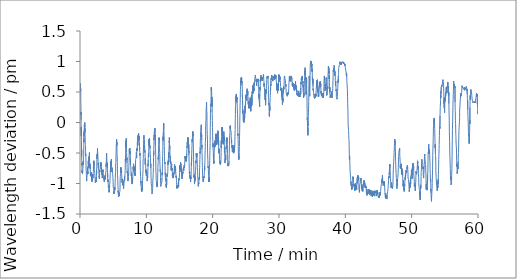
| Category | time / s |
|---|---|
| 0.0 | 0.529 |
| 0.004467121760050456 | 0.517 |
| 0.009117587407430013 | 0.542 |
| 0.013951404889424642 | 0.591 |
| 0.018701871236165363 | 0.566 |
| 0.023435688018798827 | 0.64 |
| 0.033303332328796384 | 0.628 |
| 0.038303836186726885 | 0.64 |
| 0.04400440057118734 | 0.64 |
| 0.04900490442911784 | 0.628 |
| 0.05747241973876953 | 0.603 |
| 0.06765677134195963 | 0.579 |
| 0.07260727087656657 | 0.591 |
| 0.08245824972788493 | 0.554 |
| 0.08747541904449463 | 0.529 |
| 0.09310932159423828 | 0.529 |
| 0.10212688446044922 | 0.554 |
| 0.10771076679229737 | 0.492 |
| 0.11311132113138835 | 0.431 |
| 0.12204553286234537 | 0.357 |
| 0.1271127223968506 | 0.332 |
| 0.13723038832346598 | 0.295 |
| 0.14213088353474934 | 0.246 |
| 0.14828150272369384 | 0.123 |
| 0.15388205051422119 | 0.172 |
| 0.1628996213277181 | 0.037 |
| 0.17298397223154705 | -0.086 |
| 0.1776177724202474 | -0.135 |
| 0.1833850065867106 | -0.074 |
| 0.1891355832417806 | -0.16 |
| 0.19448611736297608 | -0.222 |
| 0.20397040049235027 | -0.135 |
| 0.20925424893697103 | -0.222 |
| 0.21502149899800618 | -0.283 |
| 0.22358902295430502 | -0.32 |
| 0.2293229341506958 | -0.332 |
| 0.2386572043100993 | -0.542 |
| 0.2444577693939209 | -0.443 |
| 0.2530919869740804 | -0.566 |
| 0.25787578423817953 | -0.628 |
| 0.26264293988545734 | -0.628 |
| 0.26861018339792886 | -0.652 |
| 0.2775277535120646 | -0.689 |
| 0.28236157099405923 | -0.677 |
| 0.2873120705286662 | -0.665 |
| 0.29682968457539877 | -0.714 |
| 0.3016135056813558 | -0.739 |
| 0.30796411832173665 | -0.763 |
| 0.31664833227793376 | -0.825 |
| 0.3218655188878377 | -0.812 |
| 0.32669933636983234 | -0.812 |
| 0.33640030225118 | -0.788 |
| 0.34218421777089436 | -0.812 |
| 0.3512351195017497 | -0.788 |
| 0.3560522715250651 | -0.776 |
| 0.36585325400034585 | -0.8 |
| 0.37525418599446614 | -0.837 |
| 0.38588858445485436 | -0.837 |
| 0.39487281640370686 | -0.825 |
| 0.40455711682637535 | -0.812 |
| 0.41440810362497965 | -0.8 |
| 0.4254258712132772 | -0.776 |
| 0.43396007219950355 | -0.763 |
| 0.44362768332163494 | -0.776 |
| 0.44996167023976646 | -0.751 |
| 0.4555622180302938 | -0.714 |
| 0.4644964536031087 | -0.64 |
| 0.47446412245432534 | -0.628 |
| 0.484165088335673 | -0.689 |
| 0.49444943269093833 | -0.689 |
| 0.49923325379689537 | -0.702 |
| 0.5048504829406738 | -0.677 |
| 0.5143180847167969 | -0.64 |
| 0.5201520204544068 | -0.603 |
| 0.5297696352005005 | -0.603 |
| 0.5385038534800212 | -0.603 |
| 0.5442877531051635 | -0.579 |
| 0.5549054861068725 | -0.542 |
| 0.5634563525517782 | -0.419 |
| 0.569190255800883 | -0.382 |
| 0.5796913067499797 | -0.271 |
| 0.5889422178268433 | -0.32 |
| 0.5981098016103109 | -0.197 |
| 0.607944122950236 | -0.16 |
| 0.6140780687332154 | -0.222 |
| 0.6224622329076132 | -0.135 |
| 0.6323132197062175 | -0.111 |
| 0.6383638381958008 | -0.086 |
| 0.6473147392272949 | -0.074 |
| 0.653165316581726 | -0.037 |
| 0.6616828362147014 | -0.025 |
| 0.6678001006444295 | -0.049 |
| 0.6812181234359741 | -0.025 |
| 0.6912357886632283 | -0.025 |
| 0.6963863054911296 | -0.074 |
| 0.7031036376953125 | -0.086 |
| 0.7118711868921915 | -0.037 |
| 0.7176050821940104 | 0 |
| 0.7276894330978394 | -0.148 |
| 0.7371570348739624 | -0.098 |
| 0.7475414196650187 | -0.172 |
| 0.752508568763733 | -0.16 |
| 0.7589425563812255 | -0.209 |
| 0.7675767501195272 | -0.197 |
| 0.778977902730306 | -0.197 |
| 0.7850285053253174 | -0.246 |
| 0.7941294193267823 | -0.295 |
| 0.7992299159367879 | -0.357 |
| 0.8091308991114299 | -0.369 |
| 0.8153648694356282 | -0.357 |
| 0.8241990884145101 | -0.369 |
| 0.8309330860773723 | -0.382 |
| 0.839850656191508 | -0.455 |
| 0.8503850380579631 | -0.542 |
| 0.8558355887730916 | -0.517 |
| 0.8612694501876831 | -0.529 |
| 0.8700536727905274 | -0.542 |
| 0.8798046350479126 | -0.542 |
| 0.8860886017481486 | -0.579 |
| 0.895589550336202 | -0.579 |
| 0.9050238370895386 | -0.665 |
| 0.9103577057520549 | -0.714 |
| 0.9192419211069743 | -0.726 |
| 0.9290262381235759 | -0.788 |
| 0.9392272551854451 | -0.8 |
| 0.9458612362543742 | -0.812 |
| 0.9545454502105712 | -0.849 |
| 0.9641130685806274 | -0.874 |
| 0.9738473892211914 | -0.874 |
| 0.983981720606486 | -0.886 |
| 0.9937493721644084 | -0.899 |
| 1.0035003344217936 | -0.96 |
| 1.0101010004679363 | -0.923 |
| 1.015301521619161 | -0.923 |
| 1.0293362696965536 | -0.923 |
| 1.034503436088562 | -0.936 |
| 1.0443210840225219 | -0.911 |
| 1.0500883340835572 | -0.911 |
| 1.0588725566864015 | -0.874 |
| 1.0689068873723349 | -0.874 |
| 1.0747574726740519 | -0.849 |
| 1.0802746852238974 | -0.825 |
| 1.0861419359842936 | -0.8 |
| 1.0947261333465577 | -0.8 |
| 1.1045937856038412 | -0.812 |
| 1.1115278005599976 | -0.8 |
| 1.1200953324635823 | -0.763 |
| 1.1260625998179117 | -0.739 |
| 1.1344467719395956 | -0.763 |
| 1.1495816230773925 | -0.812 |
| 1.1561322689056397 | -0.849 |
| 1.1657832384109497 | -0.812 |
| 1.1803346872329712 | -0.837 |
| 1.1853518565495809 | -0.825 |
| 1.1954028526941936 | -0.788 |
| 1.201220122973124 | -0.788 |
| 1.2152215162913005 | -0.763 |
| 1.224822465578715 | -0.763 |
| 1.2399239857991537 | -0.739 |
| 1.250041651725769 | -0.714 |
| 1.2560255845387778 | -0.739 |
| 1.26472647190094 | -0.628 |
| 1.2708604017893472 | -0.689 |
| 1.2799779891967773 | -0.64 |
| 1.2864452997843425 | -0.603 |
| 1.2953295230865478 | -0.702 |
| 1.301630155245463 | -0.726 |
| 1.3101643323898315 | -0.665 |
| 1.316314951578776 | -0.714 |
| 1.3250658194224039 | -0.665 |
| 1.3348334709803262 | -0.677 |
| 1.341900849342346 | -0.603 |
| 1.3507517337799073 | -0.566 |
| 1.3605027039845785 | -0.628 |
| 1.3719705184300741 | -0.591 |
| 1.3818215052286784 | -0.628 |
| 1.3906057198842368 | -0.554 |
| 1.4011901060740153 | -0.615 |
| 1.4097076177597045 | -0.566 |
| 1.4194586038589478 | -0.492 |
| 1.4296929518381754 | -0.579 |
| 1.439027221997579 | -0.603 |
| 1.4458612362543741 | -0.628 |
| 1.4557789007822672 | -0.628 |
| 1.464863133430481 | -0.677 |
| 1.47494748433431 | -0.665 |
| 1.4813814560572307 | -0.714 |
| 1.4906657218933106 | -0.677 |
| 1.4992165724436441 | -0.677 |
| 1.5046504497528077 | -0.714 |
| 1.5135680198669434 | -0.714 |
| 1.5232523202896118 | -0.751 |
| 1.533169968922933 | -0.714 |
| 1.5394372701644898 | -0.763 |
| 1.5488048712412517 | -0.763 |
| 1.5581724723180135 | -0.812 |
| 1.5671733697255452 | -0.849 |
| 1.5772910515467327 | -0.874 |
| 1.5920925378799438 | -0.812 |
| 1.6014101187388101 | -0.849 |
| 1.61164448261261 | -0.862 |
| 1.6176950852076213 | -0.837 |
| 1.6266459862391154 | -0.874 |
| 1.6312297662099202 | -0.837 |
| 1.64113077322642 | -0.837 |
| 1.6515317996342977 | -0.837 |
| 1.6615494728088378 | -0.849 |
| 1.6672500530878702 | -0.812 |
| 1.6761675993601481 | -0.837 |
| 1.6861352682113648 | -0.886 |
| 1.6913357893625895 | -0.886 |
| 1.7031203031539917 | -0.874 |
| 1.711804501215617 | -0.837 |
| 1.7178551038106282 | -0.825 |
| 1.7264559666315715 | -0.849 |
| 1.733239968617757 | -0.849 |
| 1.743841036160787 | -0.923 |
| 1.752508568763733 | -0.923 |
| 1.7622762203216553 | -0.923 |
| 1.7721271991729737 | -0.936 |
| 1.7783111492792765 | -0.948 |
| 1.7882621526718139 | -0.936 |
| 1.7973463853200278 | -0.948 |
| 1.8075974225997924 | -0.972 |
| 1.817715088526408 | -0.96 |
| 1.8243824164072673 | -0.96 |
| 1.8338000377019246 | -0.886 |
| 1.8433509826660157 | -0.923 |
| 1.8496349493662516 | -0.911 |
| 1.8582691351572673 | -0.96 |
| 1.86391970316569 | -0.948 |
| 1.8736206690470378 | -0.923 |
| 1.8836050192515055 | -0.923 |
| 1.8894722700119018 | -0.849 |
| 1.8981897989908854 | -0.874 |
| 1.9079241196314494 | -0.862 |
| 1.9181084712346395 | -0.849 |
| 1.9279261191685995 | -0.837 |
| 1.933893370628357 | -0.849 |
| 1.943360988299052 | -0.849 |
| 1.9531619707743326 | -0.874 |
| 1.9598126331965129 | -0.911 |
| 1.968946886062622 | -0.886 |
| 1.9786811828613282 | -0.825 |
| 1.9888155380884807 | -0.825 |
| 1.9984331528345745 | -0.812 |
| 2.00805078347524 | -0.825 |
| 2.0180851221084595 | -0.8 |
| 2.0289862155914307 | -0.726 |
| 2.034486770629883 | -0.751 |
| 2.043504333496094 | -0.64 |
| 2.0532052993774412 | -0.665 |
| 2.0627895832061767 | -0.677 |
| 2.072473899523417 | -0.652 |
| 2.0774410565694175 | -0.628 |
| 2.087125372886658 | -0.64 |
| 2.0982764879862468 | -0.652 |
| 2.1082274675369264 | -0.689 |
| 2.116811672846476 | -0.652 |
| 2.122545568148295 | -0.652 |
| 2.1286961873372396 | -0.64 |
| 2.1378304322560626 | -0.652 |
| 2.148664855957031 | -0.677 |
| 2.157065685590108 | -0.776 |
| 2.1668166716893515 | -0.776 |
| 2.1766509691874187 | -0.776 |
| 2.183151618639628 | -0.763 |
| 2.192769249280294 | -0.763 |
| 2.2013534545898437 | -0.788 |
| 2.2108877340952557 | -0.812 |
| 2.217288366953532 | -0.825 |
| 2.225855898857117 | -0.837 |
| 2.235590203603109 | -0.837 |
| 2.2453745206197104 | -0.849 |
| 2.2601593176523846 | -0.899 |
| 2.2699769894282023 | -0.911 |
| 2.2762609322865806 | -0.911 |
| 2.286578639348348 | -0.911 |
| 2.295496185620626 | -0.911 |
| 2.305330522855123 | -0.96 |
| 2.3110477526982627 | -0.985 |
| 2.3198653062184653 | -0.985 |
| 2.3294829368591308 | -0.985 |
| 2.339483936627706 | -0.972 |
| 2.345334521929423 | -0.985 |
| 2.3548521359761554 | -0.948 |
| 2.365153169631958 | -0.948 |
| 2.3799046357472737 | -0.96 |
| 2.3898222843805947 | -0.972 |
| 2.3998066186904907 | -0.96 |
| 2.4093075672785442 | -0.96 |
| 2.4151248216629027 | -0.948 |
| 2.429126222928365 | -0.948 |
| 2.439477252960205 | -0.972 |
| 2.449211565653483 | -0.96 |
| 2.455495516459147 | -0.899 |
| 2.464146383603414 | -0.923 |
| 2.474180738131205 | -0.886 |
| 2.4839983860651653 | -0.899 |
| 2.4901156504948934 | -0.788 |
| 2.4988998730977374 | -0.837 |
| 2.508767517407735 | -0.8 |
| 2.5185518344243367 | -0.812 |
| 2.5287861824035645 | -0.726 |
| 2.538570499420166 | -0.677 |
| 2.5483548164367678 | -0.615 |
| 2.5546054363250734 | -0.566 |
| 2.568473490079244 | -0.579 |
| 2.5784244855244953 | -0.591 |
| 2.5881421168645224 | -0.517 |
| 2.5983598232269287 | -0.579 |
| 2.6080774545669554 | -0.517 |
| 2.6192285696665447 | -0.505 |
| 2.6279127677281697 | -0.48 |
| 2.6378304163614907 | -0.419 |
| 2.6479814529418944 | -0.468 |
| 2.6577157497406008 | -0.455 |
| 2.6673500537872314 | -0.48 |
| 2.677134354909261 | -0.468 |
| 2.683585000038147 | -0.517 |
| 2.6920191685358685 | -0.554 |
| 2.6982364734013875 | -0.566 |
| 2.7072040398915607 | -0.566 |
| 2.7179717699686687 | -0.591 |
| 2.7268893400828045 | -0.64 |
| 2.736590305964152 | -0.665 |
| 2.7467746496200562 | -0.689 |
| 2.756308937072754 | -0.665 |
| 2.7673433860143026 | -0.751 |
| 2.7762609322865806 | -0.751 |
| 2.7859952529271443 | -0.763 |
| 2.795879570643107 | -0.751 |
| 2.8026468992233275 | -0.739 |
| 2.8125479062398275 | -0.763 |
| 2.8212321043014525 | -0.788 |
| 2.8314831177393596 | -0.788 |
| 2.8365169525146485 | -0.788 |
| 2.846217918395996 | -0.825 |
| 2.8579357703526815 | -0.825 |
| 2.866920002301534 | -0.825 |
| 2.876670972506205 | -0.862 |
| 2.88630526860555 | -0.862 |
| 2.897089687983195 | -0.899 |
| 2.911424454053243 | -0.874 |
| 2.921158750851949 | -0.874 |
| 2.931243101755778 | -0.923 |
| 2.9410274028778076 | -0.862 |
| 2.9511284192403155 | -0.837 |
| 2.960879405339559 | -0.788 |
| 2.9706803719202677 | -0.8 |
| 2.9806647062301637 | -0.812 |
| 2.9865986347198485 | -0.776 |
| 2.9960662364959716 | -0.763 |
| 3.005983901023865 | -0.763 |
| 3.015584866205851 | -0.763 |
| 3.0254025220870973 | -0.776 |
| 3.035170149803162 | -0.751 |
| 3.045287839571635 | -0.739 |
| 3.0559389034907025 | -0.714 |
| 3.0647564490636188 | -0.689 |
| 3.0748241186141967 | -0.677 |
| 3.080891402562459 | -0.652 |
| 3.0899423042933147 | -0.689 |
| 3.100059986114502 | -0.714 |
| 3.10987761815389 | -0.689 |
| 3.1199119726816815 | -0.726 |
| 3.1306130329767865 | -0.677 |
| 3.139097221692403 | -0.714 |
| 3.148898204167684 | -0.677 |
| 3.1590492010116575 | -0.652 |
| 3.168700170516968 | -0.702 |
| 3.178434483210246 | -0.714 |
| 3.1882354497909544 | -0.689 |
| 3.1977697531382243 | -0.714 |
| 3.2121878544489544 | -0.763 |
| 3.2217387994130453 | -0.739 |
| 3.2315064509709677 | -0.751 |
| 3.2413407723108927 | -0.788 |
| 3.251475119590759 | -0.776 |
| 3.262326200803121 | -0.776 |
| 3.2719605048497518 | -0.812 |
| 3.2812114159266152 | -0.8 |
| 3.2918458223342895 | -0.788 |
| 3.3004966894785563 | -0.849 |
| 3.30999763806661 | -0.825 |
| 3.319865282376607 | -0.825 |
| 3.3296329339345294 | -0.862 |
| 3.3399339516957602 | -0.874 |
| 3.35000163714091 | -0.886 |
| 3.3612694183985394 | -0.911 |
| 3.3703370014826457 | -0.899 |
| 3.380004636446635 | -0.862 |
| 3.386038565635681 | -0.874 |
| 3.3950894673665366 | -0.837 |
| 3.4097742875417074 | -0.849 |
| 3.416474954287211 | -0.849 |
| 3.4250924666722615 | -0.849 |
| 3.434960134824117 | -0.837 |
| 3.441410787900289 | -0.776 |
| 3.4548954566319785 | -0.763 |
| 3.465029803911845 | -0.8 |
| 3.4710970878601075 | -0.8 |
| 3.479797951380412 | -0.776 |
| 3.489732273419698 | -0.8 |
| 3.500616685549418 | -0.812 |
| 3.509684268633525 | -0.837 |
| 3.520618685086568 | -0.849 |
| 3.5294028997421263 | -0.825 |
| 3.53915388584137 | -0.849 |
| 3.549071534474691 | -0.849 |
| 3.5592225551605225 | -0.874 |
| 3.5689568519592285 | -0.899 |
| 3.575490856170654 | -0.886 |
| 3.5853418350219726 | -0.899 |
| 3.5952761729558307 | -0.899 |
| 3.6042603890101117 | -0.923 |
| 3.613878019650777 | -0.899 |
| 3.623578985532125 | -0.948 |
| 3.6333966334660848 | -0.96 |
| 3.6431976159413657 | -0.948 |
| 3.6530319372812907 | -0.96 |
| 3.6627662340799967 | -0.972 |
| 3.6728505849838258 | -0.972 |
| 3.683201622962952 | -0.948 |
| 3.69305260181427 | -0.972 |
| 3.7038203557332356 | -0.923 |
| 3.7126045703887938 | -0.923 |
| 3.722855583826701 | -0.936 |
| 3.732706570625305 | -0.923 |
| 3.7398739496866864 | -0.886 |
| 3.750641703605652 | -0.899 |
| 3.759592588742574 | -0.886 |
| 3.769676939646403 | -0.936 |
| 3.7762942711512246 | -0.936 |
| 3.7849451224009196 | -0.886 |
| 3.7950961351394654 | -0.899 |
| 3.8047637859980266 | -0.862 |
| 3.8146481037139894 | -0.886 |
| 3.8245824178059897 | -0.923 |
| 3.8346834341684977 | -0.874 |
| 3.841067401568095 | -0.899 |
| 3.8499182860056558 | -0.899 |
| 3.8594192345937093 | -0.849 |
| 3.866286603609721 | -0.849 |
| 3.87502080599467 | -0.825 |
| 3.885638538996379 | -0.825 |
| 3.894706106185913 | -0.837 |
| 3.9049071232477823 | -0.812 |
| 3.9150248050689695 | -0.8 |
| 3.924792432785034 | -0.776 |
| 3.9363102515538535 | -0.702 |
| 3.9464112679163614 | -0.714 |
| 3.9559455553690595 | -0.677 |
| 3.966279935836792 | -0.726 |
| 3.9748807827631634 | -0.64 |
| 3.986615284283956 | -0.579 |
| 3.9954661687215167 | -0.529 |
| 4.005400506655375 | -0.505 |
| 4.016284918785095 | -0.517 |
| 4.0249524513880415 | -0.529 |
| 4.04005397160848 | -0.591 |
| 4.046037904421488 | -0.603 |
| 4.055155467987061 | -0.628 |
| 4.069406906763713 | -0.64 |
| 4.079157869021098 | -0.615 |
| 4.093642656008402 | -0.665 |
| 4.1032769521077475 | -0.652 |
| 4.112877917289734 | -0.689 |
| 4.122578883171082 | -0.665 |
| 4.133463303248088 | -0.751 |
| 4.143130938212077 | -0.837 |
| 4.152248517672221 | -0.899 |
| 4.162132835388183 | -0.837 |
| 4.172883915901184 | -0.899 |
| 4.186601956685384 | -0.972 |
| 4.193202622731527 | -0.972 |
| 4.20362032254537 | -0.972 |
| 4.217155019442241 | -0.985 |
| 4.2275727192560835 | -0.936 |
| 4.237423706054687 | -0.972 |
| 4.247191349665324 | -0.972 |
| 4.261909484863281 | -0.985 |
| 4.271760471661886 | -1.034 |
| 4.281544788678487 | -1.071 |
| 4.291162419319153 | -1.083 |
| 4.301180068651835 | -1.059 |
| 4.312181186676026 | -1.059 |
| 4.322265521685282 | -1.059 |
| 4.331666469573975 | -1.034 |
| 4.341550787289937 | -1.046 |
| 4.347801399230957 | -1.071 |
| 4.3619361559549965 | -1.12 |
| 4.372237189610799 | -1.108 |
| 4.382354871431986 | -1.145 |
| 4.392239189147949 | -1.157 |
| 4.40217350323995 | -1.132 |
| 4.417008336385091 | -1.096 |
| 4.426609285672506 | -1.132 |
| 4.437693738937378 | -1.132 |
| 4.446477937698364 | -1.083 |
| 4.457112336158753 | -1.059 |
| 4.470930385589599 | -1.071 |
| 4.481031386057536 | -1.009 |
| 4.490949050585429 | -1.022 |
| 4.500700036684672 | -0.997 |
| 4.510367671648662 | -0.972 |
| 4.524885789553324 | -0.948 |
| 4.531403104464213 | -0.911 |
| 4.540554022789001 | -0.923 |
| 4.550588353474935 | -0.899 |
| 4.560406001408895 | -0.849 |
| 4.571557116508484 | -0.825 |
| 4.58059135278066 | -0.788 |
| 4.590975721677144 | -0.812 |
| 4.597159671783447 | -0.8 |
| 4.6071106672286986 | -0.726 |
| 4.621395436922709 | -0.751 |
| 4.631446433067322 | -0.665 |
| 4.6409807205200195 | -0.689 |
| 4.650581669807434 | -0.64 |
| 4.661066071192423 | -0.652 |
| 4.6713170846303305 | -0.64 |
| 4.679934620857239 | -0.652 |
| 4.689668917655945 | -0.665 |
| 4.701536766688029 | -0.628 |
| 4.710421005884807 | -0.615 |
| 4.721438765525818 | -0.603 |
| 4.731773138046265 | -0.603 |
| 4.740690684318542 | -0.652 |
| 4.751025048891703 | -0.714 |
| 4.76082603931427 | -0.739 |
| 4.769543568293254 | -0.739 |
| 4.780761353174845 | -0.788 |
| 4.79026231765747 | -0.812 |
| 4.799879932403565 | -0.788 |
| 4.809314219156901 | -0.763 |
| 4.819298553466797 | -0.739 |
| 4.83013296922048 | -0.751 |
| 4.83898385365804 | -0.751 |
| 4.848751505215962 | -0.751 |
| 4.85858580271403 | -0.726 |
| 4.8701203028361 | -0.739 |
| 4.883688322703043 | -0.763 |
| 4.8936893224716185 | -0.763 |
| 4.904557069142659 | -0.763 |
| 4.914324720700582 | -0.8 |
| 4.923658982912699 | -0.837 |
| 4.938077084223429 | -0.862 |
| 4.949128206570943 | -0.874 |
| 4.9584458033243815 | -0.899 |
| 4.9682467699050905 | -0.923 |
| 4.9778977394104 | -0.923 |
| 4.99273255666097 | -0.972 |
| 5.002850238482157 | -1.009 |
| 5.012517873446146 | -1.059 |
| 5.022152169545492 | -1.046 |
| 5.0320864836374914 | -1.046 |
| 5.0433376232783 | -1.059 |
| 5.052521872520447 | -1.071 |
| 5.062139503161112 | -1.083 |
| 5.072323854764303 | -1.071 |
| 5.082124837239584 | -1.096 |
| 5.093059269587199 | -1.12 |
| 5.101676789919535 | -1.157 |
| 5.111744451522827 | -1.169 |
| 5.121528768539429 | -1.132 |
| 5.131296420097351 | -1.169 |
| 5.145481173197428 | -1.182 |
| 5.155365482966105 | -1.169 |
| 5.161899471282959 | -1.157 |
| 5.171050389607747 | -1.169 |
| 5.180934699376424 | -1.169 |
| 5.191519101460774 | -1.157 |
| 5.201736783981323 | -1.145 |
| 5.21080436706543 | -1.132 |
| 5.221772138277689 | -1.12 |
| 5.230623022715251 | -1.059 |
| 5.241640782356262 | -1.083 |
| 5.250558336575826 | -1.096 |
| 5.260175967216492 | -1.108 |
| 5.27081036567688 | -1.083 |
| 5.279344550768534 | -1.059 |
| 5.2901289701461796 | -1.059 |
| 5.299763250350952 | -0.985 |
| 5.310014287630717 | -0.936 |
| 5.3194652398427325 | -0.936 |
| 5.328949522972107 | -0.899 |
| 5.3389171679814655 | -0.862 |
| 5.349084854125977 | -0.825 |
| 5.365369820594788 | -0.825 |
| 5.374470718701681 | -0.8 |
| 5.384305055936178 | -0.677 |
| 5.395056120554606 | -0.677 |
| 5.408807484308879 | -0.652 |
| 5.418941839536031 | -0.64 |
| 5.42930953502655 | -0.517 |
| 5.440210636456808 | -0.529 |
| 5.454445385932923 | -0.468 |
| 5.4647464195887245 | -0.369 |
| 5.475014122327169 | -0.369 |
| 5.481831471125285 | -0.357 |
| 5.490499003728231 | -0.345 |
| 5.505550503730774 | -0.345 |
| 5.515384817123413 | -0.271 |
| 5.529936265945435 | -0.332 |
| 5.539587235450744 | -0.369 |
| 5.5510050535202025 | -0.32 |
| 5.560039289792379 | -0.394 |
| 5.571273732185364 | -0.382 |
| 5.580191302299499 | -0.492 |
| 5.590075620015463 | -0.529 |
| 5.599826606114705 | -0.529 |
| 5.611161073048909 | -0.566 |
| 5.624812436103821 | -0.652 |
| 5.634980122248332 | -0.702 |
| 5.644764423370361 | -0.776 |
| 5.654915436108907 | -0.849 |
| 5.664549732208252 | -0.874 |
| 5.678984522819519 | -0.862 |
| 5.688735485076904 | -0.911 |
| 5.698253099123637 | -0.96 |
| 5.707654054959615 | -0.972 |
| 5.717288335164388 | -1.034 |
| 5.732206503550212 | -1.059 |
| 5.747091317176819 | -1.096 |
| 5.757859071095784 | -1.145 |
| 5.766476583480835 | -1.12 |
| 5.776260900497436 | -1.132 |
| 5.791045721371969 | -1.182 |
| 5.800663336118062 | -1.169 |
| 5.810047618548075 | -1.182 |
| 5.820165284474691 | -1.219 |
| 5.826515936851502 | -1.219 |
| 5.839933935801188 | -1.219 |
| 5.849684921900431 | -1.219 |
| 5.859519219398498 | -1.157 |
| 5.869336867332459 | -1.182 |
| 5.880304638544718 | -1.169 |
| 5.895006100336711 | -1.194 |
| 5.904740420977275 | -1.206 |
| 5.915341488520304 | -1.206 |
| 5.924309039115906 | -1.206 |
| 5.934076682726542 | -1.182 |
| 5.948578135172526 | -1.157 |
| 5.963829652468363 | -1.157 |
| 5.973563973108927 | -1.169 |
| 5.983781655629476 | -1.157 |
| 5.99433270295461 | -1.145 |
| 6.007800722122193 | -1.132 |
| 6.018218437830607 | -1.096 |
| 6.0276527007420855 | -1.083 |
| 6.03738702138265 | -1.059 |
| 6.046971305211385 | -0.96 |
| 6.062039486567179 | -0.923 |
| 6.072757220268249 | -0.886 |
| 6.0815914392471315 | -0.886 |
| 6.091742451985677 | -0.862 |
| 6.102826889355978 | -0.837 |
| 6.117711702982585 | -0.825 |
| 6.126629273096721 | -0.788 |
| 6.136396916707357 | -0.776 |
| 6.146181217829386 | -0.739 |
| 6.156798950831095 | -0.739 |
| 6.170450321833292 | -0.812 |
| 6.180384635925293 | -0.739 |
| 6.191152389844259 | -0.825 |
| 6.199953269958496 | -0.837 |
| 6.209670901298523 | -0.837 |
| 6.220905367533366 | -0.751 |
| 6.231106384595235 | -0.739 |
| 6.239857252438863 | -0.751 |
| 6.249758251508077 | -0.763 |
| 6.259359200795491 | -0.776 |
| 6.274127356211344 | -0.812 |
| 6.284211683273315 | -0.849 |
| 6.294079351425171 | -0.837 |
| 6.303513622283935 | -0.849 |
| 6.313181249300639 | -0.923 |
| 6.323782316843668 | -0.96 |
| 6.333583299318949 | -0.985 |
| 6.343984333674113 | -0.96 |
| 6.35395200252533 | -0.923 |
| 6.362936234474182 | -0.911 |
| 6.3822214841842655 | -0.972 |
| 6.391889119148255 | -0.985 |
| 6.401906784375509 | -0.948 |
| 6.412941233317057 | -0.96 |
| 6.422742215792338 | -0.972 |
| 6.436460256576538 | -0.936 |
| 6.446227884292602 | -0.985 |
| 6.456112217903137 | -0.997 |
| 6.465496484438578 | -0.972 |
| 6.4752641359965 | -1.022 |
| 6.48546515305837 | -0.997 |
| 6.496266237894694 | -1.034 |
| 6.506583937009176 | -0.985 |
| 6.515234804153442 | -0.972 |
| 6.526402568817138 | -0.96 |
| 6.536686937014262 | -0.985 |
| 6.546487919489542 | -0.972 |
| 6.560272638003031 | -1.059 |
| 6.570040265719096 | -1.083 |
| 6.57990791797638 | -1.059 |
| 6.590942366917928 | -1.059 |
| 6.6001266161600745 | -1.046 |
| 6.6101776202519735 | -1.034 |
| 6.619845255215963 | -1.022 |
| 6.630012933413187 | -0.997 |
| 6.639747254053751 | -0.997 |
| 6.655032102266947 | -0.997 |
| 6.664983105659485 | -0.972 |
| 6.679984601338704 | -0.972 |
| 6.689952270189921 | -0.936 |
| 6.699769902229309 | -0.948 |
| 6.714338032404582 | -0.911 |
| 6.724372371037801 | -0.948 |
| 6.7341400225957235 | -0.948 |
| 6.744191018740336 | -0.948 |
| 6.755175455411275 | -0.874 |
| 6.769343535105388 | -0.874 |
| 6.776110887527466 | -0.886 |
| 6.785311802228292 | -0.849 |
| 6.794312699635824 | -0.825 |
| 6.805813852945963 | -0.788 |
| 6.819281872113546 | -0.763 |
| 6.8300662676493324 | -0.603 |
| 6.839200520515442 | -0.603 |
| 6.848184752464294 | -0.591 |
| 6.857885718345642 | -0.64 |
| 6.877237669626871 | -0.529 |
| 6.892722535133362 | -0.308 |
| 6.9024235010147095 | -0.406 |
| 6.9123245000839235 | -0.357 |
| 6.922342173258463 | -0.357 |
| 6.937143651644389 | -0.32 |
| 6.946861282984416 | -0.357 |
| 6.957545685768127 | -0.295 |
| 6.9667299350102745 | -0.295 |
| 6.978231088320414 | -0.259 |
| 6.9927658875783285 | -0.332 |
| 7.002550188700358 | -0.283 |
| 7.01208446820577 | -0.443 |
| 7.021852119763692 | -0.492 |
| 7.0311530510584515 | -0.48 |
| 7.045754504203797 | -0.505 |
| 7.055505482355754 | -0.579 |
| 7.065289783477783 | -0.615 |
| 7.075024104118347 | -0.579 |
| 7.084641718864441 | -0.665 |
| 7.099526556332906 | -0.739 |
| 7.114411369959513 | -0.825 |
| 7.124279022216797 | -0.825 |
| 7.134246683120727 | -0.812 |
| 7.143897652626038 | -0.8 |
| 7.15973257223765 | -0.825 |
| 7.1687668005625405 | -0.837 |
| 7.1785511175791425 | -0.862 |
| 7.188635452588399 | -0.874 |
| 7.198803154627482 | -0.899 |
| 7.213571286201477 | -0.899 |
| 7.223355603218079 | -0.911 |
| 7.232806555430094 | -0.96 |
| 7.242507521311442 | -0.972 |
| 7.257525682449341 | -0.96 |
| 7.267610017458598 | -0.886 |
| 7.277561020851135 | -0.886 |
| 7.287395334243774 | -0.849 |
| 7.297062969207763 | -0.874 |
| 7.307864054044088 | -0.862 |
| 7.322098803520203 | -0.874 |
| 7.332949884732565 | -0.862 |
| 7.342750867207845 | -0.849 |
| 7.35313523610433 | -0.763 |
| 7.363069566090902 | -0.726 |
| 7.3787211338678995 | -0.702 |
| 7.387688700358073 | -0.714 |
| 7.397606348991394 | -0.652 |
| 7.40759068330129 | -0.628 |
| 7.417975052197774 | -0.455 |
| 7.433243250846862 | -0.468 |
| 7.4433609326680505 | -0.431 |
| 7.454228687286377 | -0.48 |
| 7.46821342309316 | -0.48 |
| 7.477931054433187 | -0.505 |
| 7.488398766517639 | -0.492 |
| 7.497866384188334 | -0.419 |
| 7.5077173709869385 | -0.492 |
| 7.517318336168925 | -0.48 |
| 7.524068999290466 | -0.468 |
| 7.537787040074666 | -0.468 |
| 7.547404670715332 | -0.517 |
| 7.553838634490967 | -0.48 |
| 7.562356170018514 | -0.468 |
| 7.57209046681722 | -0.505 |
| 7.581774767239889 | -0.505 |
| 7.5915090878804525 | -0.628 |
| 7.601393405596415 | -0.603 |
| 7.611527752876282 | -0.615 |
| 7.621078705787658 | -0.689 |
| 7.632129804293315 | -0.702 |
| 7.641130701700846 | -0.702 |
| 7.65086502234141 | -0.702 |
| 7.660749340057373 | -0.726 |
| 7.670750339825948 | -0.726 |
| 7.681034700075785 | -0.763 |
| 7.687085302670797 | -0.788 |
| 7.696636255582174 | -0.837 |
| 7.706603916486104 | -0.825 |
| 7.715971517562866 | -0.825 |
| 7.72587251663208 | -0.874 |
| 7.7357568343480425 | -0.874 |
| 7.742440835634867 | -0.862 |
| 7.75237516562144 | -0.862 |
| 7.761742766698202 | -0.849 |
| 7.772943886121114 | -0.825 |
| 7.781461405754089 | -0.837 |
| 7.791379070281982 | -0.911 |
| 7.7971629699071245 | -0.923 |
| 7.806163867314656 | -0.948 |
| 7.812964550654093 | -0.972 |
| 7.826799265543619 | -0.985 |
| 7.836350218454997 | -0.96 |
| 7.842634185155233 | -1.009 |
| 7.851585086186727 | -0.948 |
| 7.861119365692138 | -0.911 |
| 7.871253720919291 | -0.923 |
| 7.877754370371501 | -0.923 |
| 7.886471899350484 | -0.923 |
| 7.896639585494995 | -0.923 |
| 7.906457233428955 | -0.96 |
| 7.917658352851868 | -0.985 |
| 7.926242550214131 | -0.948 |
| 7.935843499501546 | -0.96 |
| 7.942027449607849 | -0.936 |
| 7.951161702473958 | -0.936 |
| 7.9611460367838545 | -0.886 |
| 7.967796699206034 | -0.899 |
| 7.976414219538371 | -0.849 |
| 7.986265222231547 | -0.849 |
| 7.995682819684347 | -0.849 |
| 8.00596718788147 | -0.8 |
| 8.015718150138856 | -0.726 |
| 8.025819166501362 | -0.714 |
| 8.035603483517965 | -0.739 |
| 8.045304449399312 | -0.726 |
| 8.055005423227946 | -0.776 |
| 8.060889355341594 | -0.714 |
| 8.070256956418355 | -0.714 |
| 8.079791235923768 | -0.677 |
| 8.089475536346436 | -0.739 |
| 8.099543205897014 | -0.751 |
| 8.109244187672934 | -0.726 |
| 8.120861999193828 | -0.714 |
| 8.129779569307964 | -0.702 |
| 8.139897235234578 | -0.739 |
| 8.15151507059733 | -0.751 |
| 8.160065937042237 | -0.776 |
| 8.17006693681081 | -0.812 |
| 8.179667886098226 | -0.8 |
| 8.189902234077454 | -0.763 |
| 8.199969919522603 | -0.763 |
| 8.20585383574168 | -0.739 |
| 8.214888087908427 | -0.849 |
| 8.224589053789774 | -0.837 |
| 8.23415667215983 | -0.837 |
| 8.244641049702961 | -0.812 |
| 8.254242022832235 | -0.862 |
| 8.26442636648814 | -0.862 |
| 8.274093985557556 | -0.825 |
| 8.284278353055319 | -0.837 |
| 8.295296120643616 | -0.825 |
| 8.303946987787883 | -0.837 |
| 8.313497932751973 | -0.874 |
| 8.323265568415325 | -0.837 |
| 8.333016554514566 | -0.812 |
| 8.343367584546407 | -0.751 |
| 8.353001888593038 | -0.788 |
| 8.363036219278971 | -0.751 |
| 8.369603554407755 | -0.665 |
| 8.378471104303996 | -0.652 |
| 8.39285586675008 | -0.603 |
| 8.399073155721029 | -0.615 |
| 8.408257420857748 | -0.603 |
| 8.417841704686483 | -0.603 |
| 8.424742404619852 | -0.591 |
| 8.433726620674133 | -0.603 |
| 8.443544268608093 | -0.615 |
| 8.453228569030761 | -0.579 |
| 8.463112902641296 | -0.566 |
| 8.473530602455138 | -0.542 |
| 8.483398254712423 | -0.529 |
| 8.493115886052449 | -0.492 |
| 8.503083570798237 | -0.505 |
| 8.508834139506023 | -0.492 |
| 8.518501766522725 | -0.517 |
| 8.528652787208557 | -0.529 |
| 8.54000391960144 | -0.579 |
| 8.549621534347533 | -0.554 |
| 8.555488801002502 | -0.492 |
| 8.564006320635478 | -0.48 |
| 8.57405731678009 | -0.419 |
| 8.583858299255372 | -0.431 |
| 8.593559273084004 | -0.419 |
| 8.604377023379008 | -0.468 |
| 8.61352793375651 | -0.455 |
| 8.633446606000264 | -0.431 |
| 8.64028062025706 | -0.419 |
| 8.648998149236043 | -0.32 |
| 8.659165835380554 | -0.332 |
| 8.668916805585225 | -0.32 |
| 8.678867801030476 | -0.345 |
| 8.688868800799051 | -0.382 |
| 8.699019821484884 | -0.332 |
| 8.708704121907552 | -0.345 |
| 8.7151047706604 | -0.259 |
| 8.725505805015564 | -0.32 |
| 8.734290019671123 | -0.332 |
| 8.744291019439697 | -0.332 |
| 8.754358688990274 | -0.246 |
| 8.760192600886027 | -0.209 |
| 8.774760723114014 | -0.246 |
| 8.78052797317505 | -0.222 |
| 8.789445519447327 | -0.259 |
| 8.799796549479167 | -0.209 |
| 8.805063756306966 | -0.197 |
| 8.816131536165873 | -0.185 |
| 8.829766217867533 | -0.234 |
| 8.835966833432515 | -0.185 |
| 8.844801052411396 | -0.259 |
| 8.854418683052064 | -0.283 |
| 8.86581981976827 | -0.259 |
| 8.874537372589112 | -0.234 |
| 8.88435502052307 | -0.283 |
| 8.894289334615072 | -0.259 |
| 8.904623699188232 | -0.222 |
| 8.91959187189738 | -0.295 |
| 8.929876240094503 | -0.332 |
| 8.939910570780436 | -0.369 |
| 8.946161206563314 | -0.332 |
| 8.955262104670206 | -0.345 |
| 8.965363121032714 | -0.382 |
| 8.975597469011943 | -0.431 |
| 8.980564634005228 | -0.406 |
| 8.989998920758564 | -0.455 |
| 9.000083255767823 | -0.455 |
| 9.011651086807252 | -0.492 |
| 9.020635302861532 | -0.517 |
| 9.030953001976012 | -0.542 |
| 9.03733696937561 | -0.542 |
| 9.046154538790384 | -0.505 |
| 9.057422320048014 | -0.542 |
| 9.065989836057026 | -0.603 |
| 9.076890937487285 | -0.628 |
| 9.08530843257904 | -0.739 |
| 9.096326200167338 | -0.788 |
| 9.107610670725505 | -0.8 |
| 9.11617820262909 | -0.8 |
| 9.122978885968527 | -0.862 |
| 9.131763084729512 | -0.886 |
| 9.141414054234822 | -0.899 |
| 9.151931770642598 | -0.923 |
| 9.16129937171936 | -0.936 |
| 9.17110035419464 | -0.96 |
| 9.180784654617309 | -0.96 |
| 9.186968604723612 | -0.985 |
| 9.201236701011657 | -0.96 |
| 9.207137282689413 | -1.034 |
| 9.216121522585551 | -1.046 |
| 9.225939170519512 | -1.034 |
| 9.230923000971476 | -1.046 |
| 9.242457485198974 | -1.071 |
| 9.251108352343241 | -1.083 |
| 9.261292703946431 | -1.108 |
| 9.271343700091045 | -1.083 |
| 9.28157807191213 | -1.108 |
| 9.291229033470154 | -1.108 |
| 9.29752966562907 | -1.096 |
| 9.306597232818604 | -1.083 |
| 9.31668156782786 | -1.132 |
| 9.326499215761821 | -1.132 |
| 9.336300206184386 | -1.12 |
| 9.345984506607056 | -1.132 |
| 9.35605218410492 | -1.132 |
| 9.362369489669799 | -1.12 |
| 9.37098700205485 | -1.132 |
| 9.385721802711487 | -1.083 |
| 9.396472883224487 | -1.034 |
| 9.406190538406372 | -1.096 |
| 9.41627487341563 | -1.034 |
| 9.42582581837972 | -1.022 |
| 9.436760250727335 | -0.948 |
| 9.44517776966095 | -0.911 |
| 9.45469536781311 | -0.886 |
| 9.464696367581686 | -0.899 |
| 9.474514023462932 | -0.849 |
| 9.484598366419474 | -0.825 |
| 9.495316100120544 | -0.788 |
| 9.50383361975352 | -0.702 |
| 9.513467915852864 | -0.64 |
| 9.523218886057537 | -0.64 |
| 9.534670035044352 | -0.591 |
| 9.543570939699809 | -0.529 |
| 9.553421918551127 | -0.455 |
| 9.56318957010905 | -0.431 |
| 9.572873870531717 | -0.443 |
| 9.582591501871745 | -0.455 |
| 9.592659171422323 | -0.406 |
| 9.59864310423533 | -0.369 |
| 9.607777349154155 | -0.443 |
| 9.617661666870116 | -0.32 |
| 9.627095953623455 | -0.246 |
| 9.636896936098735 | -0.209 |
| 9.642164119084676 | -0.222 |
| 9.651698406537374 | -0.271 |
| 9.661149350802104 | -0.295 |
| 9.671283706029255 | -0.295 |
| 9.681351367632548 | -0.32 |
| 9.69098567167918 | -0.295 |
| 9.700986671447755 | -0.32 |
| 9.71057097117106 | -0.332 |
| 9.72093866666158 | -0.332 |
| 9.730222916603088 | -0.32 |
| 9.740040572484334 | -0.357 |
| 9.749808216094971 | -0.382 |
| 9.759992567698161 | -0.48 |
| 9.770043587684631 | -0.455 |
| 9.780344605445862 | -0.468 |
| 9.79002890586853 | -0.455 |
| 9.799779884020488 | -0.505 |
| 9.806530555089315 | -0.492 |
| 9.815431451797485 | -0.579 |
| 9.825165756543477 | -0.64 |
| 9.83536676565806 | -0.689 |
| 9.841467388470967 | -0.689 |
| 9.850651637713115 | -0.615 |
| 9.859635869661966 | -0.591 |
| 9.86968686580658 | -0.652 |
| 9.87935450077057 | -0.64 |
| 9.885838484764099 | -0.652 |
| 9.895506119728088 | -0.652 |
| 9.905657132466635 | -0.677 |
| 9.914174652099609 | -0.763 |
| 9.923508922259012 | -0.751 |
| 9.93322656949361 | -0.763 |
| 9.943127552668253 | -0.825 |
| 9.949094820022584 | -0.825 |
| 9.959679206212362 | -0.776 |
| 9.969346833229064 | -0.812 |
| 9.978164386749267 | -0.837 |
| 9.987898683547973 | -0.837 |
| 9.997766335805258 | -0.874 |
| 10.012434482574463 | -0.812 |
| 10.023018868764241 | -0.812 |
| 10.032469820976257 | -0.776 |
| 10.03867043654124 | -0.837 |
| 10.046987938880921 | -0.837 |
| 10.061756086349487 | -0.837 |
| 10.068523422876995 | -0.812 |
| 10.077140951156617 | -0.837 |
| 10.087141950925192 | -0.886 |
| 10.09682625134786 | -0.911 |
| 10.108110721906026 | -0.936 |
| 10.116711568832397 | -0.96 |
| 10.126379203796386 | -0.948 |
| 10.136530216534933 | -0.936 |
| 10.141364034016927 | -0.923 |
| 10.152448487281799 | -0.948 |
| 10.161966101328533 | -0.911 |
| 10.171583716074625 | -0.886 |
| 10.18090132077535 | -0.911 |
| 10.187301969528198 | -0.923 |
| 10.196752905845642 | -0.899 |
| 10.206037171681722 | -0.911 |
| 10.215854819615682 | -0.886 |
| 10.225672467549641 | -0.886 |
| 10.2357568025589 | -0.763 |
| 10.246457886695861 | -0.739 |
| 10.255458768208822 | -0.689 |
| 10.266526556015014 | -0.689 |
| 10.275677466392517 | -0.714 |
| 10.284811719258625 | -0.615 |
| 10.295779466629028 | -0.591 |
| 10.304397002855938 | -0.603 |
| 10.310647638638814 | -0.529 |
| 10.319548519452413 | -0.529 |
| 10.32926615079244 | -0.505 |
| 10.341117334365844 | -0.566 |
| 10.349901549021403 | -0.566 |
| 10.360419273376465 | -0.492 |
| 10.370686968167623 | -0.406 |
| 10.38080464998881 | -0.345 |
| 10.394339338938396 | -0.283 |
| 10.40394030412038 | -0.345 |
| 10.410390933354696 | -0.295 |
| 10.419425169626871 | -0.382 |
| 10.429709537823994 | -0.271 |
| 10.439610536893209 | -0.308 |
| 10.445977838834127 | -0.332 |
| 10.454562020301818 | -0.332 |
| 10.465946483612061 | -0.283 |
| 10.475947483380635 | -0.259 |
| 10.489615519841513 | -0.283 |
| 10.495932817459106 | -0.308 |
| 10.504583684603373 | -0.332 |
| 10.514468002319337 | -0.369 |
| 10.52446900208791 | -0.419 |
| 10.535420099894205 | -0.382 |
| 10.543970950444539 | -0.431 |
| 10.553705271085104 | -0.419 |
| 10.563706270853679 | -0.431 |
| 10.569806869824728 | -0.455 |
| 10.579891220728557 | -0.48 |
| 10.588508749008179 | -0.505 |
| 10.598293050130208 | -0.529 |
| 10.608494083086649 | -0.517 |
| 10.618245053291322 | -0.529 |
| 10.629479519526164 | -0.579 |
| 10.638380400339763 | -0.615 |
| 10.648048035303752 | -0.714 |
| 10.657815686861674 | -0.677 |
| 10.667633318901062 | -0.689 |
| 10.679067802429199 | -0.677 |
| 10.687718669573465 | -0.751 |
| 10.6977530002594 | -0.8 |
| 10.70777067343394 | -0.874 |
| 10.714571356773376 | -0.899 |
| 10.728072698911031 | -0.948 |
| 10.73812370300293 | -0.997 |
| 10.749474835395812 | -0.997 |
| 10.758025685946146 | -0.997 |
| 10.767810002962749 | -0.985 |
| 10.782728171348571 | -1.009 |
| 10.78926215171814 | -1.046 |
| 10.797829667727152 | -1.071 |
| 10.804246989885966 | -1.059 |
| 10.81283118724823 | -1.071 |
| 10.82434900601705 | -1.108 |
| 10.83441666762034 | -1.108 |
| 10.842817521095276 | -1.12 |
| 10.85281852086385 | -1.108 |
| 10.862402804692586 | -1.169 |
| 10.872770500183105 | -1.157 |
| 10.8817214012146 | -1.145 |
| 10.891489052772522 | -1.157 |
| 10.901006650924682 | -1.145 |
| 10.910857653617859 | -1.132 |
| 10.921175352732341 | -1.145 |
| 10.930759636561076 | -1.12 |
| 10.940577284495037 | -1.108 |
| 10.95044493675232 | -1.083 |
| 10.960212588310242 | -1.059 |
| 10.971680402755737 | -0.96 |
| 10.980864636103313 | -0.96 |
| 10.995332749684652 | -0.948 |
| 11.00156672000885 | -0.948 |
| 11.0103009223938 | -0.911 |
| 11.025052404403686 | -0.862 |
| 11.0351034005483 | -0.837 |
| 11.044887717564901 | -0.837 |
| 11.051288350423176 | -0.812 |
| 11.05983920097351 | -0.739 |
| 11.070673616727193 | -0.714 |
| 11.079757873217265 | -0.652 |
| 11.089775538444519 | -0.579 |
| 11.099509835243225 | -0.505 |
| 11.109210801124572 | -0.529 |
| 11.12317888736725 | -0.468 |
| 11.129596185684203 | -0.419 |
| 11.138897116978963 | -0.406 |
| 11.14844806989034 | -0.357 |
| 11.154465333620708 | -0.259 |
| 11.168350052833556 | -0.283 |
| 11.178184366226196 | -0.283 |
| 11.18940216700236 | -0.209 |
| 11.198219720522562 | -0.234 |
| 11.208387406667073 | -0.185 |
| 11.218788433074952 | -0.148 |
| 11.228106037775676 | -0.185 |
| 11.238007020950317 | -0.16 |
| 11.248241384824118 | -0.234 |
| 11.254358649253845 | -0.185 |
| 11.267793337504068 | -0.098 |
| 11.27759431997935 | -0.098 |
| 11.283911617596944 | -0.098 |
| 11.289562169710795 | -0.123 |
| 11.298179705937704 | -0.098 |
| 11.308147366841634 | -0.172 |
| 11.317781670888264 | -0.185 |
| 11.32776600519816 | -0.172 |
| 11.337750339508057 | -0.234 |
| 11.347517967224121 | -0.209 |
| 11.362286122639974 | -0.369 |
| 11.37202041943868 | -0.394 |
| 11.378654416402181 | -0.382 |
| 11.388088703155518 | -0.431 |
| 11.397672986984253 | -0.443 |
| 11.4114910364151 | -0.529 |
| 11.421258687973022 | -0.603 |
| 11.427542654673259 | -0.714 |
| 11.44184406598409 | -0.8 |
| 11.447828006744384 | -0.825 |
| 11.46222943464915 | -0.825 |
| 11.472130433718364 | -0.862 |
| 11.482348116238912 | -0.923 |
| 11.492482471466065 | -0.948 |
| 11.499116468429566 | -0.936 |
| 11.512951183319093 | -0.948 |
| 11.52431898911794 | -0.972 |
| 11.534319988886516 | -0.997 |
| 11.543104203542073 | -0.997 |
| 11.552905186017354 | -0.997 |
| 11.5675066391627 | -1.034 |
| 11.577640986442566 | -1.034 |
| 11.582774837811789 | -1.022 |
| 11.592475803693135 | -1.009 |
| 11.60249346892039 | -1.009 |
| 11.613827935854594 | -1.022 |
| 11.62327888806661 | -1.059 |
| 11.632463137308756 | -1.046 |
| 11.64233078956604 | -1.009 |
| 11.648548070589701 | -0.972 |
| 11.661949419975281 | -0.985 |
| 11.671417037645975 | -1.034 |
| 11.68145136833191 | -0.985 |
| 11.691002321243285 | -0.948 |
| 11.700736618041992 | -0.923 |
| 11.711871067682901 | -0.874 |
| 11.721422036488852 | -0.837 |
| 11.731256333986918 | -0.8 |
| 11.741907405853272 | -0.739 |
| 11.750958315531413 | -0.702 |
| 11.760642615954081 | -0.689 |
| 11.770260254542032 | -0.677 |
| 11.780611268679301 | -0.652 |
| 11.7903289159139 | -0.628 |
| 11.800013216336568 | -0.579 |
| 11.809630854924519 | -0.603 |
| 11.819265135129292 | -0.529 |
| 11.828999455769857 | -0.529 |
| 11.838567066192628 | -0.517 |
| 11.848651417096455 | -0.419 |
| 11.858802437782288 | -0.357 |
| 11.868786772092184 | -0.357 |
| 11.875004053115845 | -0.308 |
| 11.883754936854045 | -0.308 |
| 11.893522572517394 | -0.32 |
| 11.903490233421326 | -0.295 |
| 11.913791251182555 | -0.246 |
| 11.92379225095113 | -0.234 |
| 11.93374325434367 | -0.283 |
| 11.943894267082214 | -0.259 |
| 11.954762037595113 | -0.332 |
| 11.963712922732036 | -0.382 |
| 11.973680583635966 | -0.431 |
| 11.983331553141277 | -0.431 |
| 11.993515904744466 | -0.455 |
| 12.003283556302389 | -0.443 |
| 12.013267866770427 | -0.492 |
| 12.023085522651673 | -0.554 |
| 12.03291983604431 | -0.603 |
| 12.042654156684875 | -0.665 |
| 12.052771822611492 | -0.665 |
| 12.062306102116903 | -0.677 |
| 12.071807066599527 | -0.726 |
| 12.081608033180236 | -0.776 |
| 12.091392350196838 | -0.8 |
| 12.102676820755004 | -0.788 |
| 12.111311022440592 | -0.776 |
| 12.12119533220927 | -0.8 |
| 12.131229670842488 | -0.849 |
| 12.14104731877645 | -0.899 |
| 12.150898305575053 | -0.936 |
| 12.160849301020304 | -0.911 |
| 12.17190039952596 | -0.985 |
| 12.181301355361938 | -1.046 |
| 12.191035652160645 | -1.034 |
| 12.20065328280131 | -1.059 |
| 12.21027090549469 | -1.022 |
| 12.220255239804585 | -1.022 |
| 12.23542342185974 | -1.034 |
| 12.241590706507365 | -1.034 |
| 12.255425421396891 | -1.022 |
| 12.2655264377594 | -1.034 |
| 12.271493705113729 | -1.022 |
| 12.280577937761942 | -1.009 |
| 12.290245572725931 | -1.009 |
| 12.300013216336568 | -1.022 |
| 12.310514267285665 | -1.022 |
| 12.319865202903747 | -1.034 |
| 12.329599499702454 | -1.022 |
| 12.339800516764322 | -1.009 |
| 12.34950150648753 | -0.972 |
| 12.359719189008077 | -0.948 |
| 12.369353485107421 | -0.936 |
| 12.37943782011668 | -0.886 |
| 12.389522171020507 | -0.825 |
| 12.401089986165365 | -0.862 |
| 12.409657502174378 | -0.812 |
| 12.419558501243591 | -0.763 |
| 12.429559501012166 | -0.677 |
| 12.439010453224181 | -0.64 |
| 12.453945271174113 | -0.542 |
| 12.460195899009705 | -0.542 |
| 12.469863533973694 | -0.505 |
| 12.479464483261108 | -0.443 |
| 12.488965439796448 | -0.394 |
| 12.499199803670248 | -0.32 |
| 12.509267473220826 | -0.308 |
| 12.51596813996633 | -0.246 |
| 12.526019136110941 | -0.295 |
| 12.534703350067138 | -0.234 |
| 12.544454320271809 | -0.222 |
| 12.55462200641632 | -0.259 |
| 12.564639671643574 | -0.172 |
| 12.574407323201497 | -0.098 |
| 12.584141635894776 | -0.098 |
| 12.594976035753886 | -0.049 |
| 12.604376983642577 | -0.098 |
| 12.613561232884726 | -0.012 |
| 12.623478889465332 | 0 |
| 12.633079854647319 | -0.037 |
| 12.643230867385864 | -0.086 |
| 12.6528151512146 | -0.148 |
| 12.662949506441752 | -0.135 |
| 12.668633405367533 | -0.209 |
| 12.67931780020396 | -0.222 |
| 12.69320251941681 | -0.259 |
| 12.70325353940328 | -0.369 |
| 12.713354555765788 | -0.394 |
| 12.724538985888163 | -0.455 |
| 12.733389886220296 | -0.505 |
| 12.74474101861318 | -0.554 |
| 12.753308534622192 | -0.615 |
| 12.759592501322429 | -0.628 |
| 12.768276699384053 | -0.652 |
| 12.778277699152628 | -0.64 |
| 12.788295372327168 | -0.677 |
| 12.798179690043131 | -0.652 |
| 12.804847017923992 | -0.677 |
| 12.814698020617167 | -0.714 |
| 12.823132189114888 | -0.726 |
| 12.837917002042134 | -0.8 |
| 12.848134684562684 | -0.825 |
| 12.857935667037964 | -0.849 |
| 12.867786653836568 | -0.825 |
| 12.877670971552531 | -0.899 |
| 12.889705522855122 | -0.936 |
| 12.90327353477478 | -0.96 |
| 12.91292450428009 | -0.96 |
| 12.922675466537475 | -0.972 |
| 12.932726486523945 | -0.972 |
| 12.942627469698587 | -0.936 |
| 12.952811821301777 | -0.936 |
| 12.959179123242697 | -0.936 |
| 12.96791333357493 | -0.911 |
| 12.977797651290894 | -0.972 |
| 12.988332033157349 | -1.046 |
| 12.997449620564778 | -1.009 |
| 13.007467285792034 | -1.046 |
| 13.01756828625997 | -1.071 |
| 13.027269268035889 | -1.071 |
| 13.0379536708196 | -1.022 |
| 13.051588368415832 | -0.997 |
| 13.061222672462463 | -1.022 |
| 13.071640372276306 | -1.022 |
| 13.081891385714213 | -0.936 |
| 13.093742569287619 | -0.886 |
| 13.10297683874766 | -0.886 |
| 13.113427869478862 | -0.862 |
| 13.123178855578105 | -0.837 |
| 13.133246533075969 | -0.886 |
| 13.14684788386027 | -0.899 |
| 13.156348832448323 | -0.874 |
| 13.165933140118916 | -0.874 |
| 13.175784118970235 | -0.862 |
| 13.185568435986836 | -0.849 |
| 13.196819551785786 | -0.874 |
| 13.206687204043071 | -0.849 |
| 13.215288066864014 | -0.862 |
| 13.22537240187327 | -0.837 |
| 13.236706868807476 | -0.8 |
| 13.250358239809673 | -0.751 |
| 13.25687555472056 | -0.739 |
| 13.265326404571534 | -0.652 |
| 13.27504403591156 | -0.689 |
| 13.284661666552227 | -0.652 |
| 13.29634617169698 | -0.652 |
| 13.30511372089386 | -0.628 |
| 13.314581338564555 | -0.652 |
| 13.324348966280619 | -0.603 |
| 13.334266638755798 | -0.579 |
| 13.349101456006368 | -0.542 |
| 13.359152452150981 | -0.517 |
| 13.369020104408264 | -0.492 |
| 13.379071100552876 | -0.505 |
| 13.389038769404094 | -0.579 |
| 13.403756920496622 | -0.48 |
| 13.413957937558491 | -0.48 |
| 13.423592217763265 | -0.419 |
| 13.433443220456441 | -0.394 |
| 13.443194182713826 | -0.382 |
| 13.457945672671 | -0.308 |
| 13.467713300387064 | -0.332 |
| 13.477497617403666 | -0.246 |
| 13.487781969706218 | -0.308 |
| 13.49848305384318 | -0.345 |
| 13.511801036198934 | -0.406 |
| 13.521535348892211 | -0.382 |
| 13.531419666608175 | -0.394 |
| 13.541020639737447 | -0.394 |
| 13.5505215883255 | -0.443 |
| 13.562106068929037 | -0.492 |
| 13.571023639043172 | -0.505 |
| 13.580657935142517 | -0.554 |
| 13.590375566482544 | -0.628 |
| 13.60034323533376 | -0.652 |
| 13.610327569643657 | -0.615 |
| 13.620095221201579 | -0.554 |
| 13.629812852541606 | -0.628 |
| 13.639363805452982 | -0.677 |
| 13.648998101552328 | -0.64 |
| 13.663766233126323 | -0.665 |
| 13.67345053354899 | -0.64 |
| 13.683434867858887 | -0.665 |
| 13.693402536710103 | -0.677 |
| 13.703153522809346 | -0.689 |
| 13.71783831914266 | -0.726 |
| 13.728389366467793 | -0.739 |
| 13.737306936581929 | -0.714 |
| 13.747374606132507 | -0.788 |
| 13.76179269949595 | -0.726 |
| 13.778394373257955 | -0.726 |
| 13.78776196638743 | -0.702 |
| 13.797046232223511 | -0.689 |
| 13.80776396592458 | -0.702 |
| 13.816398167610169 | -0.677 |
| 13.827299253145855 | -0.702 |
| 13.83585011959076 | -0.751 |
| 13.845534420013427 | -0.776 |
| 13.854918686548869 | -0.763 |
| 13.864903020858765 | -0.763 |
| 13.875654085477192 | -0.776 |
| 13.8852383852005 | -0.751 |
| 13.894255956013998 | -0.763 |
| 13.909140769640604 | -0.788 |
| 13.919375133514404 | -0.849 |
| 13.93107630411784 | -0.874 |
| 13.940427239735921 | -0.862 |
| 13.949444802602132 | -0.837 |
| 13.95954581896464 | -0.837 |
| 13.969130102793375 | -0.849 |
| 13.980231221516927 | -0.837 |
| 13.98884874979655 | -0.849 |
| 13.998449699083965 | -0.849 |
| 14.008050672213237 | -0.849 |
| 14.017634956041972 | -0.911 |
| 14.029236117998758 | -0.849 |
| 14.038270354270935 | -0.862 |
| 14.047821323076883 | -0.874 |
| 14.057805633544922 | -0.862 |
| 14.067889984448751 | -0.862 |
| 14.082541449864705 | -0.874 |
| 14.092525784174601 | -0.862 |
| 14.102026732762655 | -0.899 |
| 14.111627689997356 | -0.874 |
| 14.121562019983928 | -0.849 |
| 14.132046405474345 | -0.849 |
| 14.14166403611501 | -0.862 |
| 14.15161501566569 | -0.837 |
| 14.16151602268219 | -0.825 |
| 14.17146700223287 | -0.849 |
| 14.186718535423278 | -0.812 |
| 14.196752866109213 | -0.788 |
| 14.206670538584392 | -0.776 |
| 14.21663818359375 | -0.751 |
| 14.223338850339253 | -0.763 |
| 14.237090237935384 | -0.726 |
| 14.246757872899373 | -0.751 |
| 14.25739227135976 | -0.689 |
| 14.266676537195842 | -0.714 |
| 14.276344172159831 | -0.726 |
| 14.291012303034465 | -0.726 |
| 14.30071325302124 | -0.739 |
| 14.310347572962444 | -0.763 |
| 14.320081869761148 | -0.776 |
| 14.330332883199056 | -0.751 |
| 14.345067699750265 | -0.763 |
| 14.354551982879638 | -0.8 |
| 14.364436300595601 | -0.763 |
| 14.374153939882914 | -0.812 |
| 14.383588218688965 | -0.714 |
| 14.394956016540528 | -0.776 |
| 14.404640316963196 | -0.751 |
| 14.413857920964558 | -0.776 |
| 14.423608883221943 | -0.8 |
| 14.433509866396586 | -0.788 |
| 14.448244682947795 | -0.8 |
| 14.458362372716268 | -0.849 |
| 14.465229717890422 | -0.874 |
| 14.474663988749187 | -0.899 |
| 14.48361488978068 | -0.886 |
| 14.49493268330892 | -0.886 |
| 14.505283721288045 | -0.874 |
| 14.51395125389099 | -0.886 |
| 14.523518872261047 | -0.886 |
| 14.530436237653097 | -0.911 |
| 14.543737570444742 | -0.948 |
| 14.55328852335612 | -0.948 |
| 14.563139502207438 | -0.985 |
| 14.573090505599975 | -1.009 |
| 14.583024819691977 | -1.009 |
| 14.594159269332886 | -1.059 |
| 14.603676883379618 | -1.059 |
| 14.613194521268209 | -1.083 |
| 14.622628784179687 | -1.034 |
| 14.632613118489584 | -1.071 |
| 14.643797572453817 | -1.046 |
| 14.653498538335164 | -1.034 |
| 14.662316083908081 | -1.059 |
| 14.67198371887207 | -1.071 |
| 14.681701350212098 | -1.083 |
| 14.69241909980774 | -1.083 |
| 14.701436670621236 | -1.046 |
| 14.712121073404948 | -1.046 |
| 14.721255318323772 | -1.046 |
| 14.730706270535787 | -1.046 |
| 14.741290656725566 | -1.059 |
| 14.750024851163229 | -1.071 |
| 14.759775837262472 | -1.034 |
| 14.76942680676778 | -1.022 |
| 14.779494468371073 | -1.046 |
| 14.799296450614928 | -1.059 |
| 14.808997416496277 | -1.022 |
| 14.818798398971557 | -1.009 |
| 14.828666051228842 | -0.985 |
| 14.838667050997417 | -0.985 |
| 14.850268220901489 | -1.022 |
| 14.863702885309856 | -1.046 |
| 14.873820567131043 | -0.936 |
| 14.883688219388326 | -0.948 |
| 14.893455870946248 | -0.936 |
| 14.904573655128479 | -0.911 |
| 14.913557887077332 | -0.948 |
| 14.923575536410015 | -0.923 |
| 14.933209832509359 | -0.936 |
| 14.943327522277832 | -0.923 |
| 14.954395286242168 | -0.911 |
| 14.963546204566956 | -0.936 |
| 14.972880466779072 | -0.911 |
| 14.982764784495036 | -0.899 |
| 14.992615787188212 | -0.886 |
| 15.007467269897461 | -0.825 |
| 15.017751638094584 | -0.714 |
| 15.026569167772928 | -0.739 |
| 15.03620347181956 | -0.714 |
| 15.051154971122742 | -0.751 |
| 15.065939768155415 | -0.702 |
| 15.07580743630727 | -0.739 |
| 15.085425051053365 | -0.751 |
| 15.095259388287863 | -0.776 |
| 15.105077036221822 | -0.726 |
| 15.115228033065796 | -0.739 |
| 15.124862337112427 | -0.751 |
| 15.131646354993185 | -0.714 |
| 15.140197205543519 | -0.689 |
| 15.150281556447347 | -0.652 |
| 15.162016050020855 | -0.702 |
| 15.170966951052348 | -0.714 |
| 15.18073460261027 | -0.689 |
| 15.190402221679687 | -0.677 |
| 15.196919536590576 | -0.702 |
| 15.210387555758158 | -0.677 |
| 15.220621919631958 | -0.714 |
| 15.230489571889242 | -0.776 |
| 15.240273888905843 | -0.812 |
| 15.249774837493897 | -0.812 |
| 15.264692989985148 | -0.8 |
| 15.274577299753824 | -0.8 |
| 15.284378282229106 | -0.726 |
| 15.295629421869913 | -0.812 |
| 15.304480306307475 | -0.837 |
| 15.319898502031963 | -0.849 |
| 15.330199535687765 | -0.849 |
| 15.338850402832032 | -0.812 |
| 15.348318020502726 | -0.825 |
| 15.35818567276001 | -0.874 |
| 15.368220003445943 | -0.849 |
| 15.377970989545187 | -0.923 |
| 15.387721951802572 | -0.899 |
| 15.402273400624592 | -0.899 |
| 15.411891039212545 | -0.899 |
| 15.427159237861634 | -0.899 |
| 15.43691020011902 | -0.899 |
| 15.446777852376302 | -0.899 |
| 15.456828872362772 | -0.911 |
| 15.46652983824412 | -0.899 |
| 15.481397986412048 | -0.837 |
| 15.491032282511393 | -0.812 |
| 15.500933265686035 | -0.837 |
| 15.511084286371867 | -0.8 |
| 15.521852032343547 | -0.776 |
| 15.532086388270061 | -0.788 |
| 15.540953954060873 | -0.788 |
| 15.550804917017619 | -0.788 |
| 15.560889267921448 | -0.788 |
| 15.570573568344116 | -0.776 |
| 15.586308487256368 | -0.763 |
| 15.594759321212768 | -0.763 |
| 15.604443621635436 | -0.739 |
| 15.614177934328715 | -0.739 |
| 15.623895565668741 | -0.751 |
| 15.639247099558512 | -0.788 |
| 15.64559773604075 | -0.763 |
| 15.654932006200154 | -0.776 |
| 15.664399615923564 | -0.763 |
| 15.674383950233459 | -0.751 |
| 15.689535466829936 | -0.726 |
| 15.6963361342748 | -0.702 |
| 15.706053789456686 | -0.689 |
| 15.71512135664622 | -0.689 |
| 15.725239038467407 | -0.739 |
| 15.735390051205952 | -0.726 |
| 15.745224372545879 | -0.739 |
| 15.756358822186789 | -0.739 |
| 15.765209706624349 | -0.726 |
| 15.774710655212402 | -0.702 |
| 15.785311698913574 | -0.665 |
| 15.794412620862325 | -0.64 |
| 15.804130252202352 | -0.64 |
| 15.8136812210083 | -0.628 |
| 15.824615637461344 | -0.615 |
| 15.838933738072713 | -0.603 |
| 15.845284366607666 | -0.603 |
| 15.854285271962484 | -0.554 |
| 15.86401956876119 | -0.591 |
| 15.874437284469604 | -0.554 |
| 15.889155419667562 | -0.566 |
| 15.899889834721883 | -0.628 |
| 15.90909074942271 | -0.591 |
| 15.91924177010854 | -0.566 |
| 15.92907608350118 | -0.591 |
| 15.940827250480652 | -0.554 |
| 15.950811584790548 | -0.579 |
| 15.960245871543885 | -0.591 |
| 15.969713489214579 | -0.628 |
| 15.979314438501994 | -0.591 |
| 15.98998216787974 | -0.64 |
| 15.999683133761089 | -0.591 |
| 16.009650802612306 | -0.615 |
| 16.019218436876933 | -0.628 |
| 16.02928610642751 | -0.579 |
| 16.040920599301657 | -0.554 |
| 16.049538119633993 | -0.566 |
| 16.06035588582357 | -0.542 |
| 16.069540119171144 | -0.554 |
| 16.07909108797709 | -0.579 |
| 16.093625871340432 | -0.517 |
| 16.108744049072264 | -0.529 |
| 16.11921175320943 | -0.431 |
| 16.12892940044403 | -0.431 |
| 16.13904708226522 | -0.394 |
| 16.153748552004497 | -0.419 |
| 16.163382856051125 | -0.406 |
| 16.17380055586497 | -0.406 |
| 16.18363486925761 | -0.32 |
| 16.193719220161437 | -0.357 |
| 16.2083873351415 | -0.345 |
| 16.218221672375996 | -0.357 |
| 16.228055969874063 | -0.345 |
| 16.2385236899058 | -0.295 |
| 16.24694120089213 | -0.271 |
| 16.258342337608337 | -0.246 |
| 16.26881004969279 | -0.283 |
| 16.277460916837057 | -0.32 |
| 16.287911971410114 | -0.271 |
| 16.29819631576538 | -0.246 |
| 16.308063968022665 | -0.345 |
| 16.31671483516693 | -0.308 |
| 16.32653248310089 | -0.283 |
| 16.336566837628684 | -0.32 |
| 16.347451249758404 | -0.332 |
| 16.371603671709696 | -0.455 |
| 16.38150465488434 | -0.406 |
| 16.391522336006165 | -0.357 |
| 16.40122328599294 | -0.492 |
| 16.415891416867574 | -0.468 |
| 16.425309038162233 | -0.529 |
| 16.434926652908324 | -0.542 |
| 16.444727635383607 | -0.652 |
| 16.45564540227254 | -0.677 |
| 16.469230103492738 | -0.751 |
| 16.478964400291442 | -0.788 |
| 16.48878205617269 | -0.837 |
| 16.498249665896097 | -0.825 |
| 16.508050632476806 | -0.837 |
| 16.52238540649414 | -0.8 |
| 16.532769783337912 | -0.812 |
| 16.54745458761851 | -0.849 |
| 16.557272219657897 | -0.899 |
| 16.567006532351176 | -0.899 |
| 16.581741333007812 | -0.886 |
| 16.5914089679718 | -0.862 |
| 16.601209950447082 | -0.862 |
| 16.611227615674338 | -0.874 |
| 16.62086191972097 | -0.923 |
| 16.631863021850585 | -0.886 |
| 16.642547416687012 | -0.911 |
| 16.656432135899863 | -0.923 |
| 16.66836667060852 | -0.972 |
| 16.678334339459738 | -0.948 |
| 16.692419068018594 | -0.899 |
| 16.70237007141113 | -0.886 |
| 16.71327117284139 | -0.886 |
| 16.722022032737733 | -0.899 |
| 16.731689667701723 | -0.923 |
| 16.746591170628864 | -0.886 |
| 16.756108768781026 | -0.849 |
| 16.76614312330882 | -0.8 |
| 16.77607745329539 | -0.739 |
| 16.78596177101135 | -0.689 |
| 16.7976629336675 | -0.652 |
| 16.80681385199229 | -0.702 |
| 16.81633146603902 | -0.702 |
| 16.832049703598024 | -0.566 |
| 16.841967368125914 | -0.505 |
| 16.855952103932697 | -0.492 |
| 16.865969769159953 | -0.517 |
| 16.87578740119934 | -0.505 |
| 16.88533837000529 | -0.382 |
| 16.894972666104636 | -0.295 |
| 16.90570707321167 | -0.295 |
| 16.914874649047853 | -0.271 |
| 16.92467563947042 | -0.32 |
| 16.934509952863056 | -0.295 |
| 16.94427760442098 | -0.271 |
| 16.959445786476135 | -0.172 |
| 16.969246753056844 | -0.148 |
| 16.979181083043418 | -0.148 |
| 16.989165417353313 | -0.197 |
| 16.999749819437664 | -0.148 |
| 17.01353452205658 | -0.197 |
| 17.02410223484039 | -0.209 |
| 17.034136589368185 | -0.222 |
| 17.043637537956236 | -0.185 |
| 17.053371834754945 | -0.234 |
| 17.068290003140767 | -0.308 |
| 17.074357271194458 | -0.295 |
| 17.083758203188577 | -0.32 |
| 17.092625753084818 | -0.394 |
| 17.10219338734945 | -0.431 |
| 17.1165948232015 | -0.579 |
| 17.12639580567678 | -0.603 |
| 17.13633011976878 | -0.665 |
| 17.146497821807863 | -0.677 |
| 17.15593208471934 | -0.763 |
| 17.170700232187908 | -0.8 |
| 17.185535049438478 | -0.899 |
| 17.195536049207053 | -0.874 |
| 17.205387036005657 | -0.899 |
| 17.211871019999187 | -0.911 |
| 17.222305385271707 | -0.874 |
| 17.232289719581605 | -0.849 |
| 17.241740671793618 | -0.899 |
| 17.25117495059967 | -0.985 |
| 17.26094258626302 | -1.009 |
| 17.27671083609263 | -0.997 |
| 17.285245021184284 | -0.997 |
| 17.294962652524312 | -0.96 |
| 17.30466361840566 | -0.923 |
| 17.31603144009908 | -0.96 |
| 17.330516203244528 | -0.899 |
| 17.33975047270457 | -0.911 |
| 17.348868052164715 | -0.936 |
| 17.363519517580666 | -0.874 |
| 17.37317048708598 | -0.874 |
| 17.38787194887797 | -0.849 |
| 17.397539583841958 | -0.812 |
| 17.40732388496399 | -0.812 |
| 17.41735823949178 | -0.788 |
| 17.427092536290488 | -0.763 |
| 17.447027866045634 | -0.726 |
| 17.45827898979187 | -0.702 |
| 17.467779938379923 | -0.64 |
| 17.476997518539427 | -0.64 |
| 17.48719855149587 | -0.652 |
| 17.49816632270813 | -0.665 |
| 17.506967202822366 | -0.615 |
| 17.516618156433104 | -0.591 |
| 17.526069100697836 | -0.505 |
| 17.540887252489725 | -0.554 |
| 17.55597208340963 | -0.542 |
| 17.5660231033961 | -0.554 |
| 17.57590742111206 | -0.554 |
| 17.585975082715354 | -0.517 |
| 17.59589275519053 | -0.542 |
| 17.60692718823751 | -0.554 |
| 17.61537803808848 | -0.554 |
| 17.62524568239848 | -0.505 |
| 17.63487998644511 | -0.579 |
| 17.645597720146178 | -0.579 |
| 17.656648818651835 | -0.579 |
| 17.665083003044128 | -0.603 |
| 17.675017317136128 | -0.64 |
| 17.68478496869405 | -0.677 |
| 17.69446926911672 | -0.739 |
| 17.70873737335205 | -0.763 |
| 17.718338322639465 | -0.8 |
| 17.73313980102539 | -0.788 |
| 17.743490839004515 | -0.788 |
| 17.75289178689321 | -0.862 |
| 17.768860054016113 | -0.911 |
| 17.777477566401164 | -0.923 |
| 17.78699518839518 | -0.936 |
| 17.79767958323161 | -0.923 |
| 17.806747166315713 | -0.985 |
| 17.82149863243103 | -0.985 |
| 17.836033439636232 | -1.046 |
| 17.84556770324707 | -1.034 |
| 17.855568703015646 | -0.985 |
| 17.865319689114887 | -0.972 |
| 17.879671120643614 | -0.985 |
| 17.889455437660217 | -0.997 |
| 17.8993230899175 | -1.009 |
| 17.910740900039674 | -0.997 |
| 17.92080856959025 | -0.985 |
| 17.934393270810446 | -0.972 |
| 17.944260923067727 | -0.923 |
| 17.953895219167073 | -0.899 |
| 17.963779536883035 | -0.899 |
| 17.97341383298238 | -0.911 |
| 17.988131968180337 | -0.936 |
| 17.998016285896302 | -0.911 |
| 18.00771725177765 | -0.911 |
| 18.017618250846862 | -0.862 |
| 18.027752606074014 | -0.763 |
| 18.03960378964742 | -0.739 |
| 18.049204738934836 | -0.689 |
| 18.058222301801045 | -0.652 |
| 18.068323318163554 | -0.603 |
| 18.07959112326304 | -0.579 |
| 18.093225820859274 | -0.505 |
| 18.103410172462464 | -0.48 |
| 18.113261151313782 | -0.505 |
| 18.123412171999615 | -0.406 |
| 18.132929786046347 | -0.394 |
| 18.14756458600362 | -0.271 |
| 18.157448903719583 | -0.259 |
| 18.16708319981893 | -0.246 |
| 18.17698418299357 | -0.172 |
| 18.186618487040203 | -0.172 |
| 18.200869901974997 | -0.135 |
| 18.21090423266093 | -0.148 |
| 18.221621982256572 | -0.111 |
| 18.230439519882204 | -0.086 |
| 18.24134062131246 | -0.098 |
| 18.255558721224467 | -0.074 |
| 18.265526366233825 | -0.062 |
| 18.280061149597167 | -0.037 |
| 18.290012152989707 | -0.123 |
| 18.29977980454763 | -0.148 |
| 18.314647952715557 | -0.209 |
| 18.324515604972838 | -0.234 |
| 18.33456660111745 | -0.197 |
| 18.34545103708903 | -0.283 |
| 18.359302417437235 | -0.406 |
| 18.37428725560506 | -0.369 |
| 18.384188238779704 | -0.443 |
| 18.393922535578408 | -0.492 |
| 18.404173572858173 | -0.505 |
| 18.414407936731973 | -0.529 |
| 18.429092717170715 | -0.628 |
| 18.43999381860097 | -0.652 |
| 18.448561334609984 | -0.702 |
| 18.458478999137878 | -0.739 |
| 18.468596688906352 | -0.751 |
| 18.483414816856385 | -0.862 |
| 18.49339915116628 | -0.923 |
| 18.50328346888224 | -0.911 |
| 18.513367819786072 | -0.948 |
| 18.52320213317871 | -0.96 |
| 18.552805105845135 | -0.948 |
| 18.558922386169435 | -0.96 |
| 18.567489902178448 | -0.972 |
| 18.57710751692454 | -0.972 |
| 18.58687516848246 | -0.972 |
| 18.60187667210897 | -0.972 |
| 18.61177767117818 | -0.96 |
| 18.621528633435567 | -0.96 |
| 18.636146767934164 | -0.923 |
| 18.646314454078674 | -0.886 |
| 18.661282602945963 | -0.874 |
| 18.670800232887267 | -0.899 |
| 18.68051787217458 | -0.899 |
| 18.69035218556722 | -0.874 |
| 18.70051987171173 | -0.911 |
| 18.719671789805094 | -0.886 |
| 18.7294060866038 | -0.862 |
| 18.73924039999644 | -0.849 |
| 18.748808018366496 | -0.837 |
| 18.75880901813507 | -0.8 |
| 18.773593839009603 | -0.751 |
| 18.78367818991343 | -0.739 |
| 18.79034551779429 | -0.776 |
| 18.799913136164346 | -0.714 |
| 18.81339782079061 | -0.714 |
| 18.829166070620218 | -0.64 |
| 18.837816937764487 | -0.542 |
| 18.847634569803873 | -0.554 |
| 18.85721886952718 | -0.517 |
| 18.86731988588969 | -0.455 |
| 18.882088017463683 | -0.406 |
| 18.89167231718699 | -0.345 |
| 18.901606639226276 | -0.308 |
| 18.911324286460875 | -0.308 |
| 18.921541968981426 | -0.308 |
| 18.93616010348002 | -0.234 |
| 18.9462277730306 | -0.074 |
| 18.95604542096456 | -0.012 |
| 18.965763052304585 | -0.025 |
| 18.975564034779868 | -0.012 |
| 18.990432182947796 | 0.037 |
| 19.000166503588357 | 0.074 |
| 19.010567537943523 | 0.148 |
| 19.01990180015564 | 0.209 |
| 19.029652786254882 | 0.197 |
| 19.049621438980104 | 0.246 |
| 19.060689202944438 | 0.271 |
| 19.070773553848266 | 0.332 |
| 19.080107816060384 | 0.32 |
| 19.089192072550457 | 0.295 |
| 19.10384353796641 | 0.185 |
| 19.11444458961487 | 0.197 |
| 19.12334548632304 | 0.172 |
| 19.13454660574595 | 0.16 |
| 19.144480919837953 | 0.012 |
| 19.154748622576395 | -0.074 |
| 19.164099550247194 | -0.111 |
| 19.174217240015665 | -0.135 |
| 19.183684849739073 | -0.123 |
| 19.19458593527476 | -0.197 |
| 19.205370354652405 | -0.209 |
| 19.219088387489318 | -0.32 |
| 19.228589336077373 | -0.468 |
| 19.23827363650004 | -0.505 |
| 19.253391822179157 | -0.517 |
| 19.263142784436543 | -0.603 |
| 19.277727588017783 | -0.615 |
| 19.284428254763284 | -0.628 |
| 19.29297910531362 | -0.702 |
| 19.307363867759705 | -0.702 |
| 19.31709818840027 | -0.739 |
| 19.326815819740297 | -0.726 |
| 19.336816819508872 | -0.714 |
| 19.346401119232176 | -0.751 |
| 19.360885906219483 | -0.812 |
| 19.37058687210083 | -0.812 |
| 19.380237833658853 | -0.8 |
| 19.391472283999125 | -0.874 |
| 19.405140320460003 | -0.923 |
| 19.419758454958597 | -0.899 |
| 19.429576102892558 | -0.972 |
| 19.43934375445048 | -0.923 |
| 19.449428089459737 | -0.936 |
| 19.45921240647634 | -0.972 |
| 19.474113885561625 | -0.911 |
| 19.48493163585663 | -0.923 |
| 19.49908305009206 | -0.812 |
| 19.505533703168233 | -0.812 |
| 19.514534584681194 | -0.788 |
| 19.529369401931763 | -0.714 |
| 19.538820354143777 | -0.702 |
| 19.548337968190513 | -0.677 |
| 19.55828897158305 | -0.628 |
| 19.56817328929901 | -0.554 |
| 19.582974767684938 | -0.505 |
| 19.593059102694195 | -0.455 |
| 19.603026787439983 | -0.419 |
| 19.61297776699066 | -0.345 |
| 19.62251205444336 | -0.222 |
| 19.637313532829285 | -0.123 |
| 19.64729786713918 | -0.025 |
| 19.65824897289276 | 0.037 |
| 19.672817087173463 | 0.148 |
| 19.681134589513142 | 0.197 |
| 19.695819385846455 | 0.172 |
| 19.705537017186483 | 0.222 |
| 19.715337999661763 | 0.308 |
| 19.726172423362733 | 0.271 |
| 19.73694016933441 | 0.295 |
| 19.750474850336712 | 0.369 |
| 19.760625871022544 | 0.443 |
| 19.770426853497824 | 0.529 |
| 19.780577866236367 | 0.554 |
| 19.790078822771708 | 0.579 |
| 19.804963636398316 | 0.529 |
| 19.815631365776063 | 0.529 |
| 19.824148885409038 | 0.566 |
| 19.835099983215333 | 0.542 |
| 19.84555103778839 | 0.505 |
| 19.859485753377278 | 0.443 |
| 19.869486753145853 | 0.455 |
| 19.879237739245095 | 0.394 |
| 19.889038705825804 | 0.419 |
| 19.89943975607554 | 0.259 |
| 19.913974539438883 | 0.382 |
| 19.923125449816386 | 0.308 |
| 19.9327263991038 | 0.135 |
| 19.942427388827006 | 0.135 |
| 19.951994999249777 | 0.037 |
| 19.966446455319723 | -0.025 |
| 19.97623075644175 | -0.086 |
| 19.98551502227783 | -0.16 |
| 19.99533267021179 | -0.222 |
| 20.004833618799847 | -0.234 |
| 20.025719038645427 | -0.308 |
| 20.03428657054901 | -0.394 |
| 20.044120883941652 | -0.345 |
| 20.053971870740256 | -0.406 |
| 20.063606150945027 | -0.431 |
| 20.07840765317281 | -0.419 |
| 20.088241950670877 | -0.443 |
| 20.098459649086 | -0.48 |
| 20.10819395383199 | -0.517 |
| 20.117811584472655 | -0.566 |
| 20.13242970307668 | -0.517 |
| 20.142714071273804 | -0.628 |
| 20.152648401260375 | -0.677 |
| 20.15946575005849 | -0.628 |
| 20.168033266067503 | -0.628 |
| 20.182851417859396 | -0.665 |
| 20.193185782432558 | -0.628 |
| 20.203103454907737 | -0.615 |
| 20.213871184984843 | -0.554 |
| 20.22808926900228 | -0.492 |
| 20.239107036590575 | -0.492 |
| 20.24770789941152 | -0.455 |
| 20.25772557258606 | -0.382 |
| 20.267926589647928 | -0.419 |
| 20.277544220288593 | -0.382 |
| 20.289128716786703 | -0.369 |
| 20.29934639930725 | -0.357 |
| 20.30843063990275 | -0.357 |
| 20.318064936002095 | -0.308 |
| 20.32808260122935 | -0.394 |
| 20.342800736427307 | -0.369 |
| 20.35301843484243 | -0.394 |
| 20.36315279006958 | -0.369 |
| 20.373287137349447 | -0.357 |
| 20.384121553103128 | -0.357 |
| 20.39458924929301 | -0.382 |
| 20.403906853993735 | -0.283 |
| 20.417858250935872 | -0.369 |
| 20.428142603238424 | -0.32 |
| 20.447477889060973 | -0.332 |
| 20.45722885131836 | -0.283 |
| 20.467463199297587 | -0.197 |
| 20.477080837885538 | -0.234 |
| 20.48729853630066 | -0.271 |
| 20.49826628367106 | -0.209 |
| 20.507267189025878 | -0.246 |
| 20.516951489448548 | -0.185 |
| 20.52785258293152 | -0.197 |
| 20.541087237993874 | -0.283 |
| 20.55230503877004 | -0.234 |
| 20.562339369455973 | -0.283 |
| 20.571673639615376 | -0.295 |
| 20.581374605496723 | -0.357 |
| 20.591042232513427 | -0.332 |
| 20.60591038862864 | -0.369 |
| 20.615444668134053 | -0.308 |
| 20.62552901903788 | -0.259 |
| 20.63558002312978 | -0.345 |
| 20.646581117312113 | -0.271 |
| 20.660499183336892 | -0.295 |
| 20.67055018742879 | -0.259 |
| 20.680617849032085 | -0.295 |
| 20.690352169672646 | -0.259 |
| 20.701253255208332 | -0.259 |
| 20.715821369489035 | -0.209 |
| 20.725839034716287 | -0.197 |
| 20.734873286883037 | -0.234 |
| 20.744424239794412 | -0.16 |
| 20.7540252049764 | -0.234 |
| 20.768693335851033 | -0.135 |
| 20.779811120033266 | -0.185 |
| 20.789845434824624 | -0.148 |
| 20.79997979005178 | -0.148 |
| 20.809947450955708 | -0.135 |
| 20.82381552060445 | -0.222 |
| 20.834016537666322 | -0.234 |
| 20.84383416970571 | -0.308 |
| 20.853951851526897 | -0.271 |
| 20.86461958885193 | -0.234 |
| 20.878220955530804 | -0.345 |
| 20.888371968269347 | -0.295 |
| 20.903373471895854 | -0.382 |
| 20.91324111620585 | -0.455 |
| 20.922992086410524 | -0.48 |
| 20.937943585713704 | -0.455 |
| 20.947761233647665 | -0.505 |
| 20.95774556795756 | -0.455 |
| 20.967246516545615 | -0.443 |
| 20.976697452863057 | -0.431 |
| 20.996482769648235 | -0.455 |
| 21.007083837191264 | -0.468 |
| 21.021018552780152 | -0.529 |
| 21.03060285250346 | -0.566 |
| 21.040620517730712 | -0.554 |
| 21.060155804951986 | -0.566 |
| 21.070306817690533 | -0.64 |
| 21.080024472872417 | -0.628 |
| 21.09019213517507 | -0.665 |
| 21.099909782409668 | -0.665 |
| 21.115244650840758 | -0.64 |
| 21.12494561672211 | -0.652 |
| 21.13524665037791 | -0.677 |
| 21.14553100268046 | -0.652 |
| 21.15513196786245 | -0.628 |
| 21.16861665248871 | -0.689 |
| 21.17836763858795 | -0.689 |
| 21.188551982243855 | -0.677 |
| 21.198236282666524 | -0.689 |
| 21.208020583788553 | -0.702 |
| 21.223038752873737 | -0.652 |
| 21.23272306919098 | -0.652 |
| 21.242440700531006 | -0.628 |
| 21.252175005277 | -0.603 |
| 21.262009318669637 | -0.579 |
| 21.27649410565694 | -0.492 |
| 21.2862450838089 | -0.419 |
| 21.29722952047984 | -0.295 |
| 21.306147066752114 | -0.419 |
| 21.316164739926656 | -0.369 |
| 21.330749519666035 | -0.271 |
| 21.342033982276917 | -0.259 |
| 21.350601522127786 | -0.259 |
| 21.360202487309774 | -0.234 |
| 21.376104068756103 | -0.209 |
| 21.391005555788677 | -0.123 |
| 21.399673088391623 | -0.086 |
| 21.40925738811493 | -0.148 |
| 21.424408904711406 | -0.074 |
| 21.439660422007243 | -0.222 |
| 21.44936138788859 | -0.172 |
| 21.459329056739808 | -0.074 |
| 21.468913356463116 | -0.16 |
| 21.478964352607726 | -0.222 |
| 21.490215468406678 | -0.271 |
| 21.50431688626607 | -0.246 |
| 21.514167873064675 | -0.259 |
| 21.523935516675312 | -0.209 |
| 21.53376983801524 | -0.271 |
| 21.548187939325967 | -0.32 |
| 21.557838900883993 | -0.283 |
| 21.567573221524558 | -0.345 |
| 21.577474204699197 | -0.357 |
| 21.587641882896424 | -0.345 |
| 21.602393349011738 | -0.32 |
| 21.61357780297597 | -0.357 |
| 21.627412517865498 | -0.259 |
| 21.63706350326538 | -0.197 |
| 21.646897800763448 | -0.185 |
| 21.662182672818503 | -0.234 |
| 21.6719003200531 | -0.185 |
| 21.681651282310487 | -0.148 |
| 21.69193563461304 | -0.209 |
| 21.70208667119344 | -0.222 |
| 21.721855306625365 | -0.271 |
| 21.731556272506715 | -0.308 |
| 21.74157395362854 | -0.234 |
| 21.75164162317912 | -0.308 |
| 21.761392585436504 | -0.357 |
| 21.776610787709554 | -0.492 |
| 21.78669512271881 | -0.443 |
| 21.79651277065277 | -0.419 |
| 21.80764722029368 | -0.492 |
| 21.81691482067108 | -0.517 |
| 21.837166833877564 | -0.505 |
| 21.846451099713644 | -0.554 |
| 21.856718786557515 | -0.665 |
| 21.866536434491476 | -0.652 |
| 21.876504103342693 | -0.603 |
| 21.89140558242798 | -0.615 |
| 21.901223238309225 | -0.591 |
| 21.91212433973948 | -0.542 |
| 21.921758635838827 | -0.554 |
| 21.930226135253907 | -0.554 |
| 21.9452943166097 | -0.566 |
| 21.95641208489736 | -0.554 |
| 21.966129740079243 | -0.615 |
| 21.975664019584656 | -0.529 |
| 21.985598333676656 | -0.492 |
| 22.0000497897466 | -0.48 |
| 22.01073418458303 | -0.455 |
| 22.019901768366495 | -0.455 |
| 22.028919339179993 | -0.455 |
| 22.04003712336222 | -0.406 |
| 22.0536384900411 | -0.431 |
| 22.063472803433736 | -0.369 |
| 22.07299041748047 | -0.271 |
| 22.082608032226563 | -0.345 |
| 22.097042822837828 | -0.295 |
| 22.11242768764496 | -0.332 |
| 22.122328686714173 | -0.308 |
| 22.13242970307668 | -0.283 |
| 22.14221400419871 | -0.32 |
| 22.152265000343323 | -0.246 |
| 22.16698313554128 | -0.246 |
| 22.17773421605428 | -0.308 |
| 22.19705282052358 | -0.308 |
| 22.2069704691569 | -0.357 |
| 22.218238266309104 | -0.431 |
| 22.231822951634726 | -0.443 |
| 22.24159060319265 | -0.505 |
| 22.25135825475057 | -0.542 |
| 22.26117590268453 | -0.603 |
| 22.27109355131785 | -0.652 |
| 22.29101221561432 | -0.702 |
| 22.301096550623576 | -0.677 |
| 22.311714283625285 | -0.689 |
| 22.32128190199534 | -0.714 |
| 22.33123290538788 | -0.702 |
| 22.345200967788696 | -0.677 |
| 22.355251971880595 | -0.714 |
| 22.366153049468995 | -0.714 |
| 22.374737254778545 | -0.702 |
| 22.385855038960774 | -0.677 |
| 22.400423153241476 | -0.665 |
| 22.409957432746886 | -0.689 |
| 22.41917503674825 | -0.702 |
| 22.429142689704896 | -0.714 |
| 22.44024380048116 | -0.689 |
| 22.450194803873696 | -0.689 |
| 22.459762422243752 | -0.64 |
| 22.469246705373127 | -0.615 |
| 22.479131023089092 | -0.591 |
| 22.503533466657004 | -0.505 |
| 22.528352602322897 | -0.382 |
| 22.538153584798177 | -0.295 |
| 22.548237935702005 | -0.271 |
| 22.55773888429006 | -0.259 |
| 22.57242368857066 | -0.209 |
| 22.582007988293967 | -0.209 |
| 22.591492255528767 | -0.209 |
| 22.602076649665833 | -0.185 |
| 22.611127551396688 | -0.148 |
| 22.626212406158448 | -0.062 |
| 22.635930037498476 | -0.062 |
| 22.64693113962809 | -0.098 |
| 22.656582101186117 | -0.074 |
| 22.670866870880126 | -0.049 |
| 22.685618336995443 | -0.111 |
| 22.695369323094685 | -0.098 |
| 22.705170289675394 | -0.123 |
| 22.716238069534302 | -0.123 |
| 22.72593903541565 | -0.098 |
| 22.74962473710378 | -0.135 |
| 22.759325702985127 | -0.135 |
| 22.769160016377768 | -0.123 |
| 22.780177783966064 | -0.16 |
| 22.790228803952534 | -0.209 |
| 22.803780150413512 | -0.234 |
| 22.81334776878357 | -0.246 |
| 22.8229820728302 | -0.295 |
| 22.8328497171402 | -0.332 |
| 22.847701199849446 | -0.283 |
| 22.862936067581177 | -0.332 |
| 22.873920504252116 | -0.357 |
| 22.88342145284017 | -0.369 |
| 22.89268905321757 | -0.369 |
| 22.90237335364024 | -0.369 |
| 22.919091685612997 | -0.357 |
| 22.92937605381012 | -0.419 |
| 22.938993668556215 | -0.369 |
| 22.94899466832479 | -0.394 |
| 22.957945569356283 | -0.431 |
| 22.972880403200787 | -0.48 |
| 22.982814717292786 | -0.394 |
| 22.99254903793335 | -0.443 |
| 23.002783385912576 | -0.394 |
| 23.012934406598408 | -0.431 |
| 23.027569206555686 | -0.406 |
| 23.037403519948324 | -0.431 |
| 23.048187923431396 | -0.406 |
| 23.057522185643514 | -0.431 |
| 23.07189028263092 | -0.431 |
| 23.086508417129515 | -0.468 |
| 23.096409416198732 | -0.492 |
| 23.106093716621398 | -0.505 |
| 23.11584468682607 | -0.455 |
| 23.126295733451844 | -0.406 |
| 23.140030439694723 | -0.419 |
| 23.150631499290466 | -0.431 |
| 23.159332370758058 | -0.431 |
| 23.169116687774657 | -0.468 |
| 23.17993443806966 | -0.505 |
| 23.18985208670298 | -0.406 |
| 23.199903082847595 | -0.406 |
| 23.20933736960093 | -0.394 |
| 23.21952172120412 | -0.369 |
| 23.233706466356914 | -0.406 |
| 23.243574118614198 | -0.419 |
| 23.25847562154134 | -0.394 |
| 23.268759989738463 | -0.382 |
| 23.279461050033568 | -0.48 |
| 23.29306240081787 | -0.443 |
| 23.303080066045126 | -0.455 |
| 23.313014403978983 | -0.419 |
| 23.322782055536905 | -0.406 |
| 23.332299669583637 | -0.382 |
| 23.35185162226359 | -0.308 |
| 23.361519249280295 | -0.234 |
| 23.3724036693573 | -0.185 |
| 23.381621273358665 | -0.135 |
| 23.390605505307516 | -0.111 |
| 23.405440322558086 | 0.037 |
| 23.41560798486074 | 0.062 |
| 23.425592319170633 | 0.135 |
| 23.43707679907481 | 0.259 |
| 23.450594838460287 | 0.295 |
| 23.465162952740986 | 0.332 |
| 23.47508060137431 | 0.406 |
| 23.484781583150227 | 0.394 |
| 23.494665900866192 | 0.406 |
| 23.50430020491282 | 0.406 |
| 23.518935004870098 | 0.406 |
| 23.52978608608246 | 0.419 |
| 23.538870318730673 | 0.443 |
| 23.548354601860048 | 0.345 |
| 23.557988905906676 | 0.357 |
| 23.57267370223999 | 0.468 |
| 23.582291332880654 | 0.419 |
| 23.592359002431234 | 0.431 |
| 23.602376667658486 | 0.394 |
| 23.613427766164143 | 0.382 |
| 23.636863454182944 | 0.394 |
| 23.647014466921487 | 0.419 |
| 23.65681544939677 | 0.382 |
| 23.667483186721803 | 0.406 |
| 23.676250735918682 | 0.32 |
| 23.69118555386861 | 0.308 |
| 23.701886622111 | 0.271 |
| 23.7113542397817 | 0.283 |
| 23.720588485399883 | 0.234 |
| 23.730256136258443 | 0.222 |
| 23.744390869140624 | 0.135 |
| 23.75534196694692 | 0.148 |
| 23.76605970064799 | 0.086 |
| 23.776710772514342 | -0.049 |
| 23.790328804651896 | -0.16 |
| 23.800413139661153 | -0.209 |
| 23.81018078327179 | -0.185 |
| 23.820015104611716 | -0.222 |
| 23.831782952944437 | -0.283 |
| 23.845234282811482 | -0.32 |
| 23.85478523572286 | -0.394 |
| 23.86448620160421 | -0.419 |
| 23.87425385316213 | -0.431 |
| 23.883821487426758 | -0.505 |
| 23.898289585113524 | -0.554 |
| 23.907957235972088 | -0.579 |
| 23.917524854342144 | -0.591 |
| 23.927309171358743 | -0.615 |
| 23.938060235977172 | -0.554 |
| 23.948494601249696 | -0.554 |
| 23.958945655822752 | -0.591 |
| 23.96771320501963 | -0.579 |
| 23.977630869547525 | -0.492 |
| 23.98801523844401 | -0.492 |
| 24.002149987220765 | -0.468 |
| 24.01201763947805 | -0.468 |
| 24.022352004051207 | -0.431 |
| 24.032036304473877 | -0.394 |
| 24.043320751190187 | -0.283 |
| 24.056622083981832 | -0.222 |
| 24.066123032569884 | -0.16 |
| 24.076190718015035 | -0.111 |
| 24.086008365948995 | -0.012 |
| 24.095692666371665 | 0.037 |
| 24.110110767682393 | 0.135 |
| 24.119911750157673 | 0.16 |
| 24.130729500452677 | 0.283 |
| 24.139763736724852 | 0.271 |
| 24.149398032824198 | 0.332 |
| 24.163599451382954 | 0.332 |
| 24.178167589505513 | 0.505 |
| 24.189318704605103 | 0.542 |
| 24.198269589742026 | 0.591 |
| 24.208037233352663 | 0.603 |
| 24.222655351956686 | 0.665 |
| 24.232856369018556 | 0.64 |
| 24.242090638478597 | 0.689 |
| 24.251824935277302 | 0.677 |
| 24.261592586835224 | 0.665 |
| 24.27637739976247 | 0.665 |
| 24.286095039049783 | 0.714 |
| 24.29767951965332 | 0.739 |
| 24.31093085606893 | 0.689 |
| 24.32194861570994 | 0.714 |
| 24.336133368810017 | 0.702 |
| 24.346901122728983 | 0.652 |
| 24.35686876773834 | 0.739 |
| 24.36643640200297 | 0.726 |
| 24.375003918011984 | 0.702 |
| 24.38998875617981 | 0.677 |
| 24.40027311642965 | 0.652 |
| 24.414324522018433 | 0.677 |
| 24.424308856328327 | 0.665 |
| 24.43422652085622 | 0.603 |
| 24.454411872227986 | 0.615 |
| 24.46459621588389 | 0.554 |
| 24.474397206306456 | 0.443 |
| 24.4853316227595 | 0.419 |
| 24.494599223136902 | 0.455 |
| 24.5096173842748 | 0.283 |
| 24.519751739501952 | 0.271 |
| 24.529302684466042 | 0.148 |
| 24.544270849227907 | 0.185 |
| 24.558855652809143 | 0.209 |
| 24.568473267555238 | 0.209 |
| 24.579157670338947 | 0.148 |
| 24.592909049987792 | 0.098 |
| 24.603060070673624 | 0.098 |
| 24.6182115872701 | 0.086 |
| 24.62839593887329 | 0.025 |
| 24.639730405807494 | 0.074 |
| 24.65318173567454 | 0.111 |
| 24.66293272177378 | 0.135 |
| 24.677800869941713 | 0.111 |
| 24.688051883379618 | 0.049 |
| 24.698136234283446 | 0.098 |
| 24.7129043896993 | 0 |
| 24.72378880182902 | 0.025 |
| 24.737606851259866 | 0.062 |
| 24.74867462317149 | 0.037 |
| 24.763026054700216 | 0.037 |
| 24.77301038901011 | 0.049 |
| 24.783361419041952 | 0.025 |
| 24.797329489390055 | 0.185 |
| 24.808397269248964 | 0.135 |
| 24.818014883995055 | 0.074 |
| 24.82774920463562 | 0.098 |
| 24.837983552614848 | 0.123 |
| 24.8533517519633 | 0.135 |
| 24.861752605438234 | 0.16 |
| 24.871770270665486 | 0.185 |
| 24.881537906328838 | 0.16 |
| 24.896372715632122 | 0.271 |
| 24.911307549476625 | 0.197 |
| 24.92300872008006 | 0.246 |
| 24.933759784698488 | 0.295 |
| 24.944310855865478 | 0.259 |
| 24.958028888702394 | 0.332 |
| 24.972747015953065 | 0.357 |
| 24.98414816856384 | 0.369 |
| 24.997866201400758 | 0.443 |
| 25.009567387898763 | 0.406 |
| 25.023585454622904 | 0.455 |
| 25.038653620084126 | 0.394 |
| 25.05303838253021 | 0.431 |
| 25.064722887674968 | 0.406 |
| 25.078424270947774 | 0.382 |
| 25.088441936175027 | 0.406 |
| 25.099726382891337 | 0.382 |
| 25.109427372614544 | 0.406 |
| 25.120261788368225 | 0.419 |
| 25.130046089490254 | 0.394 |
| 25.13938035170237 | 0.357 |
| 25.153681786855064 | 0.468 |
| 25.164032816886902 | 0.517 |
| 25.17386713822683 | 0.492 |
| 25.183651455243428 | 0.517 |
| 25.19766952196757 | 0.554 |
| 25.20942068894704 | 0.517 |
| 25.219355018933616 | 0.48 |
| 25.22827258904775 | 0.529 |
| 25.239056984583538 | 0.468 |
| 25.252825037638345 | 0.505 |
| 25.262492672602335 | 0.443 |
| 25.273243737220763 | 0.468 |
| 25.283878135681153 | 0.455 |
| 25.292412320772808 | 0.517 |
| 25.30391346613566 | 0.468 |
| 25.317498167355854 | 0.419 |
| 25.327415815989177 | 0.406 |
| 25.337216806411742 | 0.394 |
| 25.34668441613515 | 0.357 |
| 25.361535906791687 | 0.345 |
| 25.369119985898337 | 0.295 |
| 25.37872095108032 | 0.345 |
| 25.39265568256378 | 0.332 |
| 25.40364011923472 | 0.308 |
| 25.41424117088318 | 0.32 |
| 25.4236421028773 | 0.246 |
| 25.433293088277182 | 0.234 |
| 25.44312738577525 | 0.259 |
| 25.454011821746825 | 0.32 |
| 25.472997053464255 | 0.234 |
| 25.482881371180216 | 0.234 |
| 25.494082482655845 | 0.32 |
| 25.50456686814626 | 0.259 |
| 25.514301188786824 | 0.246 |
| 25.52896931966146 | 0.234 |
| 25.542437322934468 | 0.308 |
| 25.55238831837972 | 0.259 |
| 25.56338942050934 | 0.271 |
| 25.573057055473328 | 0.271 |
| 25.587108453114826 | 0.32 |
| 25.5970427831014 | 0.283 |
| 25.60706045627594 | 0.345 |
| 25.617744851112366 | 0.259 |
| 25.631646235783894 | 0.332 |
| 25.646664420763653 | 0.295 |
| 25.657582171758015 | 0.406 |
| 25.667383154233296 | 0.345 |
| 25.67790087064107 | 0.234 |
| 25.68826856613159 | 0.234 |
| 25.707537166277568 | 0.283 |
| 25.717188119888306 | 0.295 |
| 25.728789289792378 | 0.32 |
| 25.7384902715683 | 0.308 |
| 25.747957873344422 | 0.185 |
| 25.7617592493693 | 0.234 |
| 25.772710355122886 | 0.308 |
| 25.782728020350138 | 0.259 |
| 25.79317905108134 | 0.283 |
| 25.802546668052674 | 0.345 |
| 25.8164480527242 | 0.271 |
| 25.82708245118459 | 0.32 |
| 25.836400055885314 | 0.431 |
| 25.8461510181427 | 0.419 |
| 25.860769152641296 | 0.406 |
| 25.875620635350547 | 0.419 |
| 25.88632171948751 | 0.455 |
| 25.900106422106425 | 0.345 |
| 25.91117418607076 | 0.332 |
| 25.92140854994456 | 0.283 |
| 25.936160016059876 | 0.406 |
| 25.94497756958008 | 0.431 |
| 25.95646204948425 | 0.505 |
| 25.966713086764017 | 0.48 |
| 25.97649740378062 | 0.492 |
| 25.99064880212148 | 0.505 |
| 26.005633632342022 | 0.505 |
| 26.016534717877708 | 0.505 |
| 26.030686155954996 | 0.468 |
| 26.040520469347637 | 0.603 |
| 26.052104949951172 | 0.615 |
| 26.06243932247162 | 0.542 |
| 26.071106855074564 | 0.603 |
| 26.081024519602458 | 0.554 |
| 26.091625571250916 | 0.505 |
| 26.10499356587728 | 0.566 |
| 26.111644236246743 | 0.529 |
| 26.120628468195598 | 0.517 |
| 26.130312768618264 | 0.542 |
| 26.141463883717854 | 0.48 |
| 26.15146488348643 | 0.492 |
| 26.16018243630727 | 0.468 |
| 26.16970003445943 | 0.48 |
| 26.179417689641316 | 0.517 |
| 26.190485453605653 | 0.591 |
| 26.20468688805898 | 0.542 |
| 26.215121253331503 | 0.566 |
| 26.22495556672414 | 0.517 |
| 26.234673206011454 | 0.554 |
| 26.245857652028402 | 0.603 |
| 26.25479188760122 | 0.652 |
| 26.264376187324523 | 0.603 |
| 26.274143822987874 | 0.64 |
| 26.28416148821513 | 0.603 |
| 26.298846284548443 | 0.665 |
| 26.308863949775695 | 0.677 |
| 26.31868160565694 | 0.689 |
| 26.328382587432863 | 0.677 |
| 26.337866870562234 | 0.702 |
| 26.352885039647422 | 0.714 |
| 26.359602371851604 | 0.714 |
| 26.369670033454895 | 0.702 |
| 26.378354239463807 | 0.702 |
| 26.38825523853302 | 0.726 |
| 26.403323403994243 | 0.751 |
| 26.413107721010842 | 0.739 |
| 26.42284201780955 | 0.763 |
| 26.43315971692403 | 0.776 |
| 26.44454420407613 | 0.776 |
| 26.458828949928282 | 0.751 |
| 26.4687966187795 | 0.763 |
| 26.47868093649546 | 0.751 |
| 26.488831949234008 | 0.726 |
| 26.498499584197997 | 0.739 |
| 26.50971736907959 | 0.726 |
| 26.519201652208963 | 0.739 |
| 26.529386019706727 | 0.714 |
| 26.539470354715984 | 0.702 |
| 26.54928800264994 | 0.702 |
| 26.558622272809348 | 0.677 |
| 26.567673166592915 | 0.702 |
| 26.577207454045613 | 0.689 |
| 26.587041767438254 | 0.665 |
| 26.59702610174815 | 0.689 |
| 26.611677567164104 | 0.628 |
| 26.621478549639384 | 0.628 |
| 26.631229519844055 | 0.615 |
| 26.641030502319335 | 0.603 |
| 26.650748133659363 | 0.628 |
| 26.665132919947307 | 0.628 |
| 26.67510058879852 | 0.64 |
| 26.68611835638682 | 0.689 |
| 26.69593600432078 | 0.665 |
| 26.709770719210308 | 0.714 |
| 26.724905570348103 | 0.714 |
| 26.734839884440103 | 0.689 |
| 26.744607535998025 | 0.689 |
| 26.754325167338052 | 0.689 |
| 26.765042901039124 | 0.714 |
| 26.778660933176678 | 0.702 |
| 26.788361899058025 | 0.702 |
| 26.799329670270286 | 0.726 |
| 26.813497749964395 | 0.714 |
| 26.82338206768036 | 0.714 |
| 26.833299732208253 | 0.726 |
| 26.84331740538279 | 0.726 |
| 26.8530517021815 | 0.714 |
| 26.862752668062846 | 0.702 |
| 26.87318704922994 | 0.689 |
| 26.88272133668264 | 0.714 |
| 26.89223895072937 | 0.677 |
| 26.90190658569336 | 0.628 |
| 26.91169090270996 | 0.628 |
| 26.921341872215272 | 0.579 |
| 26.931592885653178 | 0.566 |
| 26.941327206293742 | 0.542 |
| 26.951661570866904 | 0.48 |
| 26.961529223124185 | 0.406 |
| 26.97498055299123 | 0.468 |
| 26.99433250427246 | 0.382 |
| 27.00918398698171 | 0.369 |
| 27.019968406359354 | 0.357 |
| 27.034036469459533 | 0.357 |
| 27.048737939198812 | 0.357 |
| 27.05850558280945 | 0.295 |
| 27.069340006510416 | 0.295 |
| 27.078024204572042 | 0.259 |
| 27.087658500671388 | 0.295 |
| 27.102343304951987 | 0.308 |
| 27.112427639961243 | 0.431 |
| 27.121995266278585 | 0.517 |
| 27.133163054784138 | 0.579 |
| 27.142413965861003 | 0.529 |
| 27.15618201891581 | 0.542 |
| 27.166149687767028 | 0.579 |
| 27.180801153182983 | 0.702 |
| 27.190252089500426 | 0.677 |
| 27.199619682629905 | 0.665 |
| 27.21405447324117 | 0.739 |
| 27.223955456415812 | 0.714 |
| 27.23380643526713 | 0.702 |
| 27.244240816434225 | 0.677 |
| 27.25474186738332 | 0.739 |
| 27.26946000258128 | 0.726 |
| 27.278927620251974 | 0.751 |
| 27.288461899757387 | 0.776 |
| 27.297896186510723 | 0.763 |
| 27.307347138722736 | 0.739 |
| 27.32243196964264 | 0.726 |
| 27.332149600982667 | 0.714 |
| 27.34188392162323 | 0.714 |
| 27.35216828982035 | 0.714 |
| 27.36616968313853 | 0.714 |
| 27.376504055658977 | 0.702 |
| 27.386371699968972 | 0.726 |
| 27.397322805722556 | 0.739 |
| 27.40712377230326 | 0.714 |
| 27.42162521680196 | 0.726 |
| 27.432276288668316 | 0.739 |
| 27.44626101652781 | 0.689 |
| 27.456962084770204 | 0.714 |
| 27.467746504147847 | 0.702 |
| 27.481447871526083 | 0.726 |
| 27.490948820114134 | 0.689 |
| 27.50058311621348 | 0.702 |
| 27.510800806681313 | 0.702 |
| 27.52045176823934 | 0.689 |
| 27.535369936625163 | 0.714 |
| 27.5463543732961 | 0.739 |
| 27.55527191956838 | 0.714 |
| 27.565039571126302 | 0.702 |
| 27.575490601857503 | 0.739 |
| 27.588791934649148 | 0.739 |
| 27.598642921447755 | 0.726 |
| 27.608410573005678 | 0.739 |
| 27.623512069384258 | 0.751 |
| 27.63324639002482 | 0.763 |
| 27.648081199328104 | 0.776 |
| 27.657798838615417 | 0.788 |
| 27.667549816767373 | 0.776 |
| 27.677034099896748 | 0.763 |
| 27.686435039838155 | 0.739 |
| 27.701569883028665 | 0.726 |
| 27.711270848910015 | 0.702 |
| 27.72108850479126 | 0.714 |
| 27.731739568710328 | 0.677 |
| 27.740907152493794 | 0.677 |
| 27.752308289210003 | 0.591 |
| 27.76177589893341 | 0.64 |
| 27.771210169792177 | 0.615 |
| 27.780644456545513 | 0.579 |
| 27.79181223710378 | 0.591 |
| 27.805380272865296 | 0.566 |
| 27.816014671325682 | 0.579 |
| 27.82994938691457 | 0.529 |
| 27.839833704630532 | 0.542 |
| 27.85045143763224 | 0.492 |
| 27.86470285256704 | 0.505 |
| 27.87458718617757 | 0.505 |
| 27.884604851404827 | 0.468 |
| 27.89450583457947 | 0.468 |
| 27.904323482513426 | 0.369 |
| 27.91934165159861 | 0.48 |
| 27.92915929953257 | 0.542 |
| 27.939043617248537 | 0.443 |
| 27.948711252212526 | 0.492 |
| 27.958228890101115 | 0.492 |
| 27.9726136525472 | 0.283 |
| 27.982347949345908 | 0.283 |
| 27.99196558793386 | 0.295 |
| 28.001949922243753 | 0.283 |
| 28.011900901794434 | 0.394 |
| 28.023135368029276 | 0.48 |
| 28.032152938842774 | 0.505 |
| 28.041670552889506 | 0.492 |
| 28.051404865582786 | 0.529 |
| 28.06253929932912 | 0.48 |
| 28.072023582458495 | 0.517 |
| 28.08189123471578 | 0.48 |
| 28.091742237408955 | 0.554 |
| 28.10189323425293 | 0.603 |
| 28.121395182609557 | 0.615 |
| 28.132646322250366 | 0.64 |
| 28.141380516688027 | 0.64 |
| 28.151264850298563 | 0.702 |
| 28.16119917233785 | 0.726 |
| 28.17231695652008 | 0.726 |
| 28.18081780274709 | 0.751 |
| 28.190802137056988 | 0.739 |
| 28.2007031361262 | 0.751 |
| 28.210604119300843 | 0.726 |
| 28.220221734046937 | 0.726 |
| 28.22997272014618 | 0.726 |
| 28.239607016245525 | 0.739 |
| 28.249307990074158 | 0.726 |
| 28.25922565460205 | 0.726 |
| 28.27411046822866 | 0.751 |
| 28.284094802538554 | 0.763 |
| 28.293879119555154 | 0.726 |
| 28.30374677181244 | 0.714 |
| 28.314514501889548 | 0.739 |
| 28.327799169222512 | 0.714 |
| 28.337583486239115 | 0.763 |
| 28.34728443622589 | 0.739 |
| 28.35685207049052 | 0.689 |
| 28.366536370913188 | 0.628 |
| 28.38238795598348 | 0.64 |
| 28.391238832473753 | 0.603 |
| 28.40108981927236 | 0.542 |
| 28.410557452837626 | 0.406 |
| 28.421091818809508 | 0.406 |
| 28.434509833653767 | 0.406 |
| 28.44429415067037 | 0.382 |
| 28.454928533236185 | 0.382 |
| 28.468846599260967 | 0.283 |
| 28.478497568766276 | 0.32 |
| 28.493349051475526 | 0.295 |
| 28.50325003465017 | 0.234 |
| 28.513101037343343 | 0.234 |
| 28.523052016894024 | 0.185 |
| 28.532936334609985 | 0.16 |
| 28.547754486401875 | 0.098 |
| 28.55807218551636 | 0.16 |
| 28.56692308584849 | 0.123 |
| 28.57634068330129 | 0.197 |
| 28.586058322588602 | 0.209 |
| 28.600609787305196 | 0.259 |
| 28.610810804367066 | 0.197 |
| 28.62081180413564 | 0.283 |
| 28.630496104558308 | 0.283 |
| 28.641080482800803 | 0.332 |
| 28.66041575272878 | 0.369 |
| 28.670333417256675 | 0.406 |
| 28.680251065889994 | 0.406 |
| 28.690185403823854 | 0.443 |
| 28.70160320599874 | 0.455 |
| 28.715371251106262 | 0.542 |
| 28.72508888244629 | 0.517 |
| 28.734789872169493 | 0.579 |
| 28.74927463531494 | 0.579 |
| 28.75977568626404 | 0.628 |
| 28.770510101318358 | 0.603 |
| 28.7793776512146 | 0.591 |
| 28.788878599802654 | 0.689 |
| 28.798896272977192 | 0.689 |
| 28.80956400235494 | 0.689 |
| 28.818231534957885 | 0.689 |
| 28.828282539049784 | 0.726 |
| 28.838400220870973 | 0.702 |
| 28.849751353263855 | 0.714 |
| 28.864102784792582 | 0.714 |
| 28.87422046661377 | 0.751 |
| 28.88388810157776 | 0.751 |
| 28.89367240269979 | 0.776 |
| 28.90334005355835 | 0.776 |
| 28.91827487150828 | 0.739 |
| 28.92772581577301 | 0.763 |
| 28.937326788902283 | 0.763 |
| 28.9471777677536 | 0.751 |
| 28.95689539909363 | 0.776 |
| 28.972130250930785 | 0.751 |
| 28.98191456794739 | 0.739 |
| 28.991582202911378 | 0.726 |
| 29.001233172416686 | 0.751 |
| 29.01085080305735 | 0.714 |
| 29.021535205841065 | 0.702 |
| 29.03113617102305 | 0.714 |
| 29.039653666814168 | 0.702 |
| 29.049571339289347 | 0.702 |
| 29.059338982899984 | 0.714 |
| 29.070790115992228 | 0.714 |
| 29.080491105715435 | 0.677 |
| 29.089608669281006 | 0.689 |
| 29.099559672673543 | 0.702 |
| 29.11436115105947 | 0.726 |
| 29.133879772822063 | 0.726 |
| 29.148531238238018 | 0.739 |
| 29.15938231945038 | 0.714 |
| 29.16970000267029 | 0.726 |
| 29.179667687416078 | 0.714 |
| 29.198686250050862 | 0.739 |
| 29.207737151781718 | 0.739 |
| 29.21790483792623 | 0.763 |
| 29.22757247289022 | 0.776 |
| 29.237723485628763 | 0.776 |
| 29.249391317367554 | 0.739 |
| 29.258292206128438 | 0.702 |
| 29.2681098540624 | 0.726 |
| 29.277894171079 | 0.751 |
| 29.287361788749696 | 0.726 |
| 29.301813220977785 | 0.702 |
| 29.31276431878408 | 0.714 |
| 29.323098683357237 | 0.726 |
| 29.333149687449136 | 0.763 |
| 29.342834003766377 | 0.776 |
| 29.356485350926718 | 0.763 |
| 29.367036422093708 | 0.788 |
| 29.37600397268931 | 0.776 |
| 29.38558827241262 | 0.763 |
| 29.397256104151406 | 0.776 |
| 29.406957070032757 | 0.763 |
| 29.420458420117697 | 0.726 |
| 29.43035941918691 | 0.739 |
| 29.440343753496805 | 0.739 |
| 29.451894903182982 | 0.726 |
| 29.461412517229714 | 0.739 |
| 29.470246736208598 | 0.726 |
| 29.479831035931905 | 0.763 |
| 29.48956533273061 | 0.714 |
| 29.50014971892039 | 0.739 |
| 29.509233967463175 | 0.726 |
| 29.519151616096497 | 0.739 |
| 29.53020273844401 | 0.776 |
| 29.540670434633892 | 0.776 |
| 29.55533857345581 | 0.739 |
| 29.564822856585184 | 0.726 |
| 29.57547392050425 | 0.751 |
| 29.585174886385598 | 0.702 |
| 29.59430913925171 | 0.677 |
| 29.608593900998432 | 0.665 |
| 29.618078184127807 | 0.689 |
| 29.62822920481364 | 0.689 |
| 29.638763586680096 | 0.677 |
| 29.648164518674214 | 0.665 |
| 29.662715967496236 | 0.603 |
| 29.672766987482706 | 0.628 |
| 29.68281798362732 | 0.615 |
| 29.692552304267885 | 0.529 |
| 29.702319939931233 | 0.542 |
| 29.71712141831716 | 0.615 |
| 29.72680571873983 | 0.603 |
| 29.736706701914468 | 0.554 |
| 29.751024802525837 | 0.554 |
| 29.76079245408376 | 0.591 |
| 29.77576060295105 | 0.48 |
| 29.78539492289225 | 0.48 |
| 29.795245885849 | 0.591 |
| 29.804680172602335 | 0.529 |
| 29.815881284077964 | 0.542 |
| 29.829332637786866 | 0.566 |
| 29.839983701705933 | 0.542 |
| 29.84968466758728 | 0.554 |
| 29.85930230617523 | 0.591 |
| 29.869136619567872 | 0.517 |
| 29.880804451306663 | 0.64 |
| 29.890555437405904 | 0.628 |
| 29.8992062886556 | 0.579 |
| 29.90889058907827 | 0.64 |
| 29.918724902470906 | 0.615 |
| 29.929642669359843 | 0.665 |
| 29.939493656158447 | 0.702 |
| 29.94957798322042 | 0.726 |
| 29.959278972943626 | 0.726 |
| 29.968329866727192 | 0.751 |
| 29.983098022143047 | 0.788 |
| 29.99283231894175 | 0.714 |
| 30.002583305040996 | 0.689 |
| 30.013401039441426 | 0.665 |
| 30.02370207309723 | 0.714 |
| 30.037436787287394 | 0.702 |
| 30.047487783432008 | 0.714 |
| 30.05790548324585 | 0.739 |
| 30.06782315572103 | 0.776 |
| 30.076657366752624 | 0.763 |
| 30.091192150115965 | 0.726 |
| 30.10099313259125 | 0.702 |
| 30.110460750261943 | 0.689 |
| 30.12014505068461 | 0.714 |
| 30.130696105957032 | 0.726 |
| 30.140747102101646 | 0.714 |
| 30.149981371561687 | 0.739 |
| 30.160432402292887 | 0.751 |
| 30.17113348642985 | 0.751 |
| 30.184818188349407 | 0.714 |
| 30.194602505366007 | 0.689 |
| 30.204420153299967 | 0.702 |
| 30.21440447171529 | 0.689 |
| 30.224572149912515 | 0.652 |
| 30.235173217455547 | 0.615 |
| 30.24872457186381 | 0.591 |
| 30.258675567309062 | 0.566 |
| 30.26872657140096 | 0.529 |
| 30.280077719688414 | 0.529 |
| 30.29364573955536 | 0.554 |
| 30.30329668521881 | 0.566 |
| 30.313047671318053 | 0.566 |
| 30.32278196811676 | 0.554 |
| 30.332682967185974 | 0.517 |
| 30.34765113989512 | 0.505 |
| 30.357368771235148 | 0.505 |
| 30.368519886334738 | 0.566 |
| 30.37787082195282 | 0.517 |
| 30.38768846988678 | 0.529 |
| 30.40157318909963 | 0.468 |
| 30.41109080314636 | 0.419 |
| 30.420775119463602 | 0.406 |
| 30.43125948905945 | 0.455 |
| 30.440893785158792 | 0.468 |
| 30.454811835289 | 0.529 |
| 30.465062872568765 | 0.419 |
| 30.47456382115682 | 0.369 |
| 30.48526488939921 | 0.394 |
| 30.49838287035624 | 0.443 |
| 30.513051001230874 | 0.468 |
| 30.522835318247477 | 0.295 |
| 30.533469700813292 | 0.406 |
| 30.542687304814656 | 0.32 |
| 30.557222088177998 | 0.369 |
| 30.572023566563924 | 0.345 |
| 30.58189121882121 | 0.394 |
| 30.592958982785543 | 0.357 |
| 30.603193354606628 | 0.394 |
| 30.613077672322593 | 0.468 |
| 30.627279082934063 | 0.505 |
| 30.636996738115947 | 0.566 |
| 30.64754778544108 | 0.517 |
| 30.657698806126913 | 0.48 |
| 30.667366433143616 | 0.505 |
| 30.68056774934133 | 0.517 |
| 30.6914021730423 | 0.542 |
| 30.7017032066981 | 0.591 |
| 30.711320837338764 | 0.579 |
| 30.721088473002116 | 0.542 |
| 30.734889849027 | 0.542 |
| 30.744874183336893 | 0.566 |
| 30.754675165812174 | 0.554 |
| 30.764526152610777 | 0.615 |
| 30.775560585657754 | 0.628 |
| 30.789161936442056 | 0.726 |
| 30.799146286646526 | 0.726 |
| 30.810014033317564 | 0.739 |
| 30.82328201929728 | 0.739 |
| 30.83471650282542 | 0.763 |
| 30.84463415145874 | 0.763 |
| 30.854368472099303 | 0.751 |
| 30.86448615392049 | 0.739 |
| 30.874520468711854 | 0.726 |
| 30.88453814983368 | 0.726 |
| 30.89507253964742 | 0.714 |
| 30.90540690422058 | 0.726 |
| 30.91534121831258 | 0.726 |
| 30.92490885257721 | 0.726 |
| 30.938710236549376 | 0.714 |
| 30.948794571558633 | 0.714 |
| 30.95984568595886 | 0.702 |
| 30.968713235855102 | 0.689 |
| 30.97918095588684 | 0.64 |
| 30.992948985099794 | 0.652 |
| 31.007417106628417 | 0.628 |
| 31.0171013991038 | 0.603 |
| 31.026785699526467 | 0.628 |
| 31.036353317896523 | 0.579 |
| 31.05113813877106 | 0.554 |
| 31.062339250246684 | 0.554 |
| 31.0717902024587 | 0.529 |
| 31.082207902272543 | 0.492 |
| 31.095709252357484 | 0.505 |
| 31.11132748921712 | 0.48 |
| 31.121095132827758 | 0.48 |
| 31.131746204694114 | 0.48 |
| 31.141747204462686 | 0.48 |
| 31.15498185157776 | 0.455 |
| 31.169599986076356 | 0.468 |
| 31.179400952657065 | 0.468 |
| 31.18930195172628 | 0.468 |
| 31.200353050231932 | 0.48 |
| 31.20973733266195 | 0.492 |
| 31.22368873755137 | 0.48 |
| 31.23350636959076 | 0.455 |
| 31.243140665690103 | 0.431 |
| 31.252774969736734 | 0.468 |
| 31.26234258810679 | 0.48 |
| 31.27336035569509 | 0.455 |
| 31.283861406644185 | 0.443 |
| 31.293645715713502 | 0.48 |
| 31.30224658648173 | 0.48 |
| 31.31168084939321 | 0.492 |
| 31.326549021402993 | 0.48 |
| 31.336199967066445 | 0.455 |
| 31.34696772098541 | 0.492 |
| 31.360752439498903 | 0.468 |
| 31.3675364335378 | 0.468 |
| 31.381471172968546 | 0.48 |
| 31.396439337730406 | 0.48 |
| 31.406156969070434 | 0.48 |
| 31.4157745997111 | 0.492 |
| 31.425342218081155 | 0.48 |
| 31.43984367052714 | 0.492 |
| 31.44957798322042 | 0.505 |
| 31.459428970019022 | 0.517 |
| 31.469196605682374 | 0.554 |
| 31.484031422932944 | 0.579 |
| 31.4937824010849 | 0.628 |
| 31.50366671880086 | 0.652 |
| 31.51836818854014 | 0.677 |
| 31.529452633857726 | 0.665 |
| 31.543387349446615 | 0.702 |
| 31.55377173423767 | 0.702 |
| 31.56352270444234 | 0.751 |
| 31.573873734474184 | 0.726 |
| 31.583408037821453 | 0.714 |
| 31.593959085146587 | 0.714 |
| 31.602826635042828 | 0.726 |
| 31.61254426638285 | 0.726 |
| 31.62357869942983 | 0.763 |
| 31.63336301644643 | 0.763 |
| 31.647581100463867 | 0.702 |
| 31.657148734728494 | 0.677 |
| 31.67181686560313 | 0.689 |
| 31.68173453807831 | 0.726 |
| 31.69138548374176 | 0.677 |
| 31.706403652826946 | 0.689 |
| 31.7164213180542 | 0.702 |
| 31.726972389221192 | 0.714 |
| 31.73689003785451 | 0.702 |
| 31.745790934562685 | 0.702 |
| 31.76037572224935 | 0.689 |
| 31.770543400446574 | 0.689 |
| 31.780344382921854 | 0.714 |
| 31.790278720855714 | 0.677 |
| 31.800979789098104 | 0.714 |
| 31.81486450036367 | 0.739 |
| 31.825632254282635 | 0.714 |
| 31.835516571998596 | 0.726 |
| 31.849451303482056 | 0.763 |
| 31.85898558298747 | 0.776 |
| 31.873553705215453 | 0.763 |
| 31.883671387036642 | 0.776 |
| 31.893405683835347 | 0.776 |
| 31.90314000447591 | 0.751 |
| 31.91284097035726 | 0.751 |
| 31.92780913511912 | 0.751 |
| 31.93786013921102 | 0.751 |
| 31.948394521077475 | 0.776 |
| 31.958295520146688 | 0.714 |
| 31.96819650332133 | 0.665 |
| 31.98226456642151 | 0.64 |
| 31.992765617370605 | 0.652 |
| 32.00651700496674 | 0.603 |
| 32.02165185610453 | 0.615 |
| 32.03270295461019 | 0.652 |
| 32.0458376010259 | 0.591 |
| 32.05648867289225 | 0.615 |
| 32.065239532788596 | 0.615 |
| 32.07480715115865 | 0.615 |
| 32.08515820503235 | 0.64 |
| 32.098959589004515 | 0.652 |
| 32.1097439845403 | 0.603 |
| 32.11981166998545 | 0.615 |
| 32.130229369799295 | 0.64 |
| 32.143614053726196 | 0.628 |
| 32.15339835484823 | 0.603 |
| 32.16403275330861 | 0.603 |
| 32.17376705010732 | 0.615 |
| 32.18371805349986 | 0.603 |
| 32.197119402885434 | 0.566 |
| 32.2069537003835 | 0.579 |
| 32.21757143338521 | 0.554 |
| 32.231089448928834 | 0.603 |
| 32.24135715166728 | 0.579 |
| 32.25195821921031 | 0.579 |
| 32.26195920308431 | 0.554 |
| 32.27212688922882 | 0.554 |
| 32.28187786738078 | 0.579 |
| 32.29141215483347 | 0.579 |
| 32.30526353518168 | 0.529 |
| 32.31501452128092 | 0.529 |
| 32.32461547056834 | 0.566 |
| 32.335449886322024 | 0.517 |
| 32.34456746578216 | 0.529 |
| 32.35916891892751 | 0.542 |
| 32.369453303019206 | 0.566 |
| 32.378437519073486 | 0.579 |
| 32.38838852246602 | 0.591 |
| 32.3982728322347 | 0.628 |
| 32.41339101791382 | 0.579 |
| 32.42284197012584 | 0.566 |
| 32.433276335398354 | 0.554 |
| 32.452328252792356 | 0.591 |
| 32.463296000162764 | 0.615 |
| 32.48193120161692 | 0.628 |
| 32.49164883295695 | 0.677 |
| 32.50114978949229 | 0.615 |
| 32.512300904591875 | 0.566 |
| 32.522335235277815 | 0.566 |
| 32.53603660265605 | 0.615 |
| 32.54705438613892 | 0.628 |
| 32.556888699531555 | 0.615 |
| 32.566556334495544 | 0.591 |
| 32.57614061832428 | 0.542 |
| 32.59090876579285 | 0.591 |
| 32.60532686710358 | 0.542 |
| 32.61549455324809 | 0.566 |
| 32.626545667648315 | 0.529 |
| 32.63632996877035 | 0.529 |
| 32.64996466636658 | 0.517 |
| 32.660849086443584 | 0.517 |
| 32.67056673367818 | 0.505 |
| 32.67981765270233 | 0.492 |
| 32.690168682734175 | 0.529 |
| 32.703520019849144 | 0.455 |
| 32.71372105280558 | 0.455 |
| 32.72347202301025 | 0.455 |
| 32.73398973941803 | 0.455 |
| 32.74454080263774 | 0.443 |
| 32.75825883547465 | 0.468 |
| 32.768209838867186 | 0.48 |
| 32.77794413566589 | 0.443 |
| 32.79262893994649 | 0.455 |
| 32.80769712130229 | 0.443 |
| 32.818214837710066 | 0.443 |
| 32.831816188494365 | 0.443 |
| 32.84180052280426 | 0.431 |
| 32.85660200119018 | 0.455 |
| 32.86720305283864 | 0.443 |
| 32.878037468592325 | 0.455 |
| 32.88792180220286 | 0.443 |
| 32.89757277170817 | 0.443 |
| 32.91114078362783 | 0.443 |
| 32.922408588727315 | 0.443 |
| 32.93570992151896 | 0.48 |
| 32.946360969543456 | 0.443 |
| 32.955428552627566 | 0.431 |
| 32.965096187591556 | 0.517 |
| 32.97983098824819 | 0.443 |
| 32.98966530164083 | 0.443 |
| 32.99989967346191 | 0.419 |
| 33.009333936373395 | 0.419 |
| 33.01968496640523 | 0.431 |
| 33.03430310090383 | 0.468 |
| 33.04407073656718 | 0.455 |
| 33.05798880259196 | 0.431 |
| 33.072990306218465 | 0.455 |
| 33.08440811634064 | 0.443 |
| 33.09817615350087 | 0.455 |
| 33.108460521698 | 0.419 |
| 33.11851151784261 | 0.406 |
| 33.128595852851866 | 0.443 |
| 33.138880236943564 | 0.419 |
| 33.152898303667705 | 0.455 |
| 33.16289930343628 | 0.443 |
| 33.172583603858946 | 0.48 |
| 33.18310132026672 | 0.468 |
| 33.19763610363007 | 0.455 |
| 33.21262093385061 | 0.48 |
| 33.22253858248393 | 0.492 |
| 33.23203953901927 | 0.517 |
| 33.24294063250224 | 0.492 |
| 33.25234157244365 | 0.505 |
| 33.265859587987265 | 0.48 |
| 33.27642731666565 | 0.468 |
| 33.286811685562135 | 0.566 |
| 33.3006797393163 | 0.615 |
| 33.307797122001645 | 0.665 |
| 33.32116511662801 | 0.628 |
| 33.332066202163695 | 0.64 |
| 33.342533922195436 | 0.652 |
| 33.35285162130992 | 0.652 |
| 33.36688636938731 | 0.726 |
| 33.38353801568349 | 0.739 |
| 33.39403906663259 | 0.689 |
| 33.40462345282237 | 0.714 |
| 33.41425777276357 | 0.739 |
| 33.428342501322426 | 0.702 |
| 33.439110255241395 | 0.726 |
| 33.45256158510844 | 0.726 |
| 33.46307930151622 | 0.702 |
| 33.47726407051086 | 0.739 |
| 33.48898190657298 | 0.763 |
| 33.50276660124461 | 0.751 |
| 33.5137677192688 | 0.726 |
| 33.5232519865036 | 0.689 |
| 33.533603016535444 | 0.702 |
| 33.54367070198059 | 0.677 |
| 33.55368836720785 | 0.689 |
| 33.56360603968302 | 0.702 |
| 33.57309029897054 | 0.677 |
| 33.583324670791626 | 0.652 |
| 33.59680935541789 | 0.677 |
| 33.60666033426921 | 0.665 |
| 33.616477982203165 | 0.603 |
| 33.62702903747559 | 0.603 |
| 33.63669667243958 | 0.579 |
| 33.65083142121633 | 0.615 |
| 33.66196587085724 | 0.505 |
| 33.67121678988139 | 0.505 |
| 33.6813178062439 | 0.468 |
| 33.69496916929881 | 0.468 |
| 33.7099373181661 | 0.406 |
| 33.72007167339325 | 0.431 |
| 33.72967263857524 | 0.455 |
| 33.739440266291304 | 0.468 |
| 33.750124669075014 | 0.468 |
| 33.76370937029521 | 0.431 |
| 33.77529385089874 | 0.443 |
| 33.78872853914897 | 0.505 |
| 33.798846220970155 | 0.579 |
| 33.808397165934245 | 0.566 |
| 33.82343200047811 | 0.591 |
| 33.83368303775787 | 0.677 |
| 33.84485081831614 | 0.677 |
| 33.854185088475546 | 0.726 |
| 33.864802821477255 | 0.751 |
| 33.879437605539955 | 0.763 |
| 33.8928722858429 | 0.849 |
| 33.90360668500264 | 0.788 |
| 33.914074405034384 | 0.837 |
| 33.928092471758525 | 0.899 |
| 33.94252725442251 | 0.886 |
| 33.956978702545165 | 0.911 |
| 33.966696333885196 | 0.911 |
| 33.97733073234558 | 0.886 |
| 33.98674833774567 | 0.763 |
| 34.000266353289284 | 0.689 |
| 34.0148678223292 | 0.64 |
| 34.02543553511302 | 0.64 |
| 34.034969822565714 | 0.603 |
| 34.04483748277028 | 0.517 |
| 34.05887222290039 | 0.48 |
| 34.07074007193248 | 0.455 |
| 34.08430808385213 | 0.468 |
| 34.09415908654531 | 0.517 |
| 34.104910151163736 | 0.591 |
| 34.11886155605316 | 0.665 |
| 34.1286958694458 | 0.689 |
| 34.13893021742503 | 0.714 |
| 34.1489812374115 | 0.739 |
| 34.15886555512746 | 0.751 |
| 34.1730169693629 | 0.652 |
| 34.18263458410899 | 0.542 |
| 34.19340233802795 | 0.492 |
| 34.203836719195046 | 0.443 |
| 34.21378770669301 | 0.431 |
| 34.22755575180054 | 0.332 |
| 34.23897355397542 | 0.234 |
| 34.25275827248891 | 0.111 |
| 34.2628759543101 | 0.049 |
| 34.27811080614726 | 0.074 |
| 34.28969530264536 | 0.012 |
| 34.30007967154185 | -0.062 |
| 34.31008067131042 | -0.086 |
| 34.31928158601125 | -0.135 |
| 34.33366635640462 | -0.098 |
| 34.34428408940633 | -0.111 |
| 34.35490182240804 | -0.209 |
| 34.368503173192344 | -0.074 |
| 34.37830415566762 | -0.025 |
| 34.38997198740641 | -0.049 |
| 34.40017302036286 | 0.025 |
| 34.41500783761342 | 0.037 |
| 34.42565888563792 | 0.111 |
| 34.43554321924845 | 0.123 |
| 34.44971129894257 | 0.16 |
| 34.460295685132344 | 0.222 |
| 34.47009666760763 | 0.283 |
| 34.480047671000165 | 0.345 |
| 34.50345000425975 | 0.492 |
| 34.52008500099182 | 0.603 |
| 34.53018600145976 | 0.652 |
| 34.54387071927388 | 0.726 |
| 34.55392172336578 | 0.763 |
| 34.56482280095418 | 0.776 |
| 34.57972430388133 | 0.702 |
| 34.5929589509964 | 0.615 |
| 34.607177035013834 | 0.48 |
| 34.61681133906047 | 0.455 |
| 34.627945788701375 | 0.431 |
| 34.646164266268414 | 0.468 |
| 34.65699868996938 | 0.542 |
| 34.67111677328746 | 0.628 |
| 34.68170115152995 | 0.763 |
| 34.695502535502115 | 0.862 |
| 34.709853967030845 | 0.948 |
| 34.72077173391978 | 0.936 |
| 34.73025601704915 | 0.948 |
| 34.740823737780254 | 0.972 |
| 34.75102475484212 | 0.997 |
| 34.766109601656595 | 0.972 |
| 34.776410619417824 | 1.009 |
| 34.78579490184784 | 1.009 |
| 34.79574590524037 | 1.009 |
| 34.8095806201299 | 0.997 |
| 34.81943159898122 | 0.985 |
| 34.83389972050985 | 0.997 |
| 34.84426741600036 | 0.96 |
| 34.85408507188161 | 0.997 |
| 34.86765308380127 | 0.997 |
| 34.87785410086314 | 0.923 |
| 34.888338486353554 | 0.972 |
| 34.898056117693585 | 0.936 |
| 34.9085905234019 | 0.923 |
| 34.92215853532155 | 0.96 |
| 34.931726169586184 | 0.923 |
| 34.94137712319692 | 0.96 |
| 34.95242823759715 | 0.886 |
| 34.965979584058125 | 0.862 |
| 34.97771408557892 | 0.886 |
| 34.98773175080617 | 0.837 |
| 35.0010997692744 | 0.862 |
| 35.01111743450165 | 0.825 |
| 35.022401889165245 | 0.812 |
| 35.03663665453593 | 0.689 |
| 35.050354687372845 | 0.739 |
| 35.060255686442055 | 0.726 |
| 35.071356789271036 | 0.726 |
| 35.08147447109222 | 0.702 |
| 35.09545919895172 | 0.64 |
| 35.10581023693085 | 0.677 |
| 35.11607791582743 | 0.714 |
| 35.12637894948323 | 0.591 |
| 35.13677999973297 | 0.529 |
| 35.15246490637461 | 0.542 |
| 35.16564954916636 | 0.554 |
| 35.176850668589275 | 0.529 |
| 35.19035201867421 | 0.529 |
| 35.2009864171346 | 0.492 |
| 35.21468778451284 | 0.468 |
| 35.225555539131165 | 0.468 |
| 35.2387401898702 | 0.443 |
| 35.248457837104795 | 0.443 |
| 35.25925890604655 | 0.443 |
| 35.273126951853435 | 0.431 |
| 35.283444650967915 | 0.419 |
| 35.29372901916504 | 0.406 |
| 35.30726370016734 | 0.419 |
| 35.31779810587565 | 0.406 |
| 35.33164948622386 | 0.406 |
| 35.34290060202281 | 0.419 |
| 35.35626862049103 | 0.419 |
| 35.367036350568135 | 0.394 |
| 35.3808377345403 | 0.419 |
| 35.396389285723366 | 0.468 |
| 35.406440289815265 | 0.468 |
| 35.41634128888448 | 0.455 |
| 35.429742622375485 | 0.468 |
| 35.44047703742981 | 0.443 |
| 35.45424506664276 | 0.443 |
| 35.46576288541158 | 0.406 |
| 35.4792809009552 | 0.406 |
| 35.48918190002441 | 0.394 |
| 35.4989162047704 | 0.406 |
| 35.51343432267507 | 0.394 |
| 35.5285525004069 | 0.406 |
| 35.53940358956655 | 0.419 |
| 35.552871600786844 | 0.419 |
| 35.56777308781942 | 0.455 |
| 35.57739071846008 | 0.431 |
| 35.58852516810099 | 0.48 |
| 35.602376556396486 | 0.529 |
| 35.612860933939615 | 0.517 |
| 35.626862335205075 | 0.566 |
| 35.63768006960551 | 0.591 |
| 35.64778108596802 | 0.579 |
| 35.661165769894914 | 0.591 |
| 35.671283435821536 | 0.579 |
| 35.6860515832901 | 0.677 |
| 35.696852668126425 | 0.652 |
| 35.71070405642192 | 0.615 |
| 35.72063838640849 | 0.579 |
| 35.735739882787065 | 0.689 |
| 35.74642428557078 | 0.702 |
| 35.75695866743724 | 0.603 |
| 35.770843402544656 | 0.64 |
| 35.78181114991506 | 0.702 |
| 35.791695483525594 | 0.702 |
| 35.805463520685834 | 0.628 |
| 35.81614791552226 | 0.665 |
| 35.83023266792297 | 0.566 |
| 35.84086706638336 | 0.591 |
| 35.85490180651347 | 0.579 |
| 35.86465276877085 | 0.591 |
| 35.874453751246136 | 0.517 |
| 35.885454853375755 | 0.492 |
| 35.899072885513306 | 0.554 |
| 35.91425773302714 | 0.443 |
| 35.92907588481903 | 0.419 |
| 35.94017700354258 | 0.443 |
| 35.953945032755534 | 0.419 |
| 35.963996052742004 | 0.406 |
| 35.97506381670634 | 0.431 |
| 35.98848181565602 | 0.419 |
| 35.999366235733035 | 0.419 |
| 36.009583934148154 | 0.431 |
| 36.02278525034587 | 0.443 |
| 36.03376968701681 | 0.492 |
| 36.04762106736501 | 0.505 |
| 36.057588736216225 | 0.542 |
| 36.06797310511271 | 0.554 |
| 36.07802410125733 | 0.542 |
| 36.09155880610148 | 0.566 |
| 36.106476950645444 | 0.64 |
| 36.11737803618113 | 0.615 |
| 36.127279035250346 | 0.591 |
| 36.13799676895142 | 0.652 |
| 36.14833113352458 | 0.64 |
| 36.16203250090281 | 0.665 |
| 36.17293360233307 | 0.652 |
| 36.18335130214691 | 0.665 |
| 36.196919337908426 | 0.64 |
| 36.206870317459106 | 0.628 |
| 36.22222185134888 | 0.677 |
| 36.231889486312866 | 0.652 |
| 36.24302393595378 | 0.579 |
| 36.25629193782807 | 0.566 |
| 36.26655963261922 | 0.566 |
| 36.2802943388621 | 0.603 |
| 36.2900119860967 | 0.64 |
| 36.30027967294057 | 0.591 |
| 36.31034733454386 | 0.566 |
| 36.32399870554606 | 0.529 |
| 36.34390070438385 | 0.48 |
| 36.35503515402476 | 0.517 |
| 36.364902806282046 | 0.455 |
| 36.37493713696798 | 0.443 |
| 36.38885520299276 | 0.443 |
| 36.39895620346069 | 0.455 |
| 36.410057322184244 | 0.443 |
| 36.423692003885904 | 0.431 |
| 36.43455975055694 | 0.419 |
| 36.44854448636373 | 0.468 |
| 36.45941224892934 | 0.455 |
| 36.46962993939717 | 0.443 |
| 36.48353131612142 | 0.455 |
| 36.494065721829735 | 0.468 |
| 36.50766707261403 | 0.468 |
| 36.51805143356323 | 0.455 |
| 36.53243621985118 | 0.48 |
| 36.54368733565013 | 0.468 |
| 36.553655004501344 | 0.443 |
| 36.56743972301483 | 0.431 |
| 36.57844081719716 | 0.48 |
| 36.5922088543574 | 0.468 |
| 36.60202650229136 | 0.443 |
| 36.61276090145111 | 0.431 |
| 36.62659563223521 | 0.48 |
| 36.63739670117696 | 0.406 |
| 36.65083138942718 | 0.431 |
| 36.662515886624654 | 0.406 |
| 36.676217254002886 | 0.419 |
| 36.69106875260671 | 0.431 |
| 36.701536456743874 | 0.406 |
| 36.71522115071615 | 0.406 |
| 36.726522286732994 | 0.455 |
| 36.74010698795318 | 0.468 |
| 36.75514182249705 | 0.505 |
| 36.76622625192007 | 0.566 |
| 36.77729403972626 | 0.591 |
| 36.78806176980336 | 0.677 |
| 36.801829822858174 | 0.714 |
| 36.81686464945475 | 0.739 |
| 36.83166613578796 | 0.726 |
| 36.846084252993265 | 0.763 |
| 36.860819053649905 | 0.714 |
| 36.87065336704254 | 0.689 |
| 36.88578820228577 | 0.665 |
| 36.8972226858139 | 0.665 |
| 36.91042400201162 | 0.64 |
| 36.92127508322398 | 0.542 |
| 36.931742803255716 | 0.517 |
| 36.945027470588684 | 0.529 |
| 36.956128589312236 | 0.591 |
| 36.96986328760783 | 0.591 |
| 36.98066437244415 | 0.591 |
| 36.99501580397288 | 0.628 |
| 37.010033973058064 | 0.554 |
| 37.02098507086436 | 0.579 |
| 37.0341197013855 | 0.603 |
| 37.04492078622182 | 0.628 |
| 37.05848882198334 | 0.628 |
| 37.07840747038524 | 0.665 |
| 37.089641936620076 | 0.689 |
| 37.10392668247223 | 0.689 |
| 37.11394435564677 | 0.739 |
| 37.12877917289734 | 0.751 |
| 37.14341397285462 | 0.677 |
| 37.15444840590159 | 0.652 |
| 37.16824978987376 | 0.591 |
| 37.17925088405609 | 0.529 |
| 37.19310227235158 | 0.443 |
| 37.20777040322621 | 0.443 |
| 37.222188520431516 | 0.431 |
| 37.23712335427602 | 0.443 |
| 37.24685765107473 | 0.443 |
| 37.262092502911884 | 0.431 |
| 37.273193621635436 | 0.48 |
| 37.2865616162618 | 0.468 |
| 37.296812653541565 | 0.517 |
| 37.311147419611615 | 0.554 |
| 37.322398535410564 | 0.591 |
| 37.335449838638304 | 0.591 |
| 37.346500953038536 | 0.554 |
| 37.35956892172496 | 0.591 |
| 37.371103405952454 | 0.714 |
| 37.3849214553833 | 0.751 |
| 37.395422506332395 | 0.8 |
| 37.409407234191896 | 0.8 |
| 37.42000828584035 | 0.825 |
| 37.430342666308086 | 0.886 |
| 37.44866115252177 | 0.923 |
| 37.460362339019774 | 0.886 |
| 37.470013284683226 | 0.849 |
| 37.48013096650441 | 0.862 |
| 37.49058202107747 | 0.812 |
| 37.50428338845571 | 0.899 |
| 37.51518448988597 | 0.899 |
| 37.52883585294088 | 0.8 |
| 37.53932022253672 | 0.837 |
| 37.55315495332082 | 0.812 |
| 37.56802308559418 | 0.714 |
| 37.578624153137206 | 0.776 |
| 37.592692240079245 | 0.714 |
| 37.602643219629925 | 0.652 |
| 37.613927682240806 | 0.591 |
| 37.62814576625824 | 0.579 |
| 37.63926355044047 | 0.554 |
| 37.64946456750234 | 0.505 |
| 37.66281590461731 | 0.579 |
| 37.67351698875427 | 0.48 |
| 37.687501700719196 | 0.492 |
| 37.698836167653404 | 0.48 |
| 37.71255421638489 | 0.431 |
| 37.72268857161204 | 0.406 |
| 37.734223055839536 | 0.431 |
| 37.74795775413513 | 0.419 |
| 37.75925888220469 | 0.431 |
| 37.77302691936493 | 0.419 |
| 37.78414470354716 | 0.443 |
| 37.79842947324117 | 0.443 |
| 37.81196415424347 | 0.443 |
| 37.826748967170715 | 0.419 |
| 37.84198381900787 | 0.443 |
| 37.85166811943054 | 0.468 |
| 37.86643626689911 | 0.455 |
| 37.87805408636729 | 0.468 |
| 37.89153878688812 | 0.468 |
| 37.901456435521446 | 0.443 |
| 37.91619123617808 | 0.505 |
| 37.93119273980459 | 0.419 |
| 37.945360819498696 | 0.431 |
| 37.95582853953044 | 0.443 |
| 37.96906320254008 | 0.431 |
| 37.97989760239919 | 0.406 |
| 37.99526581764221 | 0.406 |
| 38.0087504863739 | 0.431 |
| 38.02011830012004 | 0.419 |
| 38.030702686309816 | 0.431 |
| 38.044620752334595 | 0.443 |
| 38.05597188472748 | 0.468 |
| 38.06977326869965 | 0.492 |
| 38.08149110476176 | 0.492 |
| 38.095309154192606 | 0.505 |
| 38.1070436557134 | 0.554 |
| 38.12564551830292 | 0.665 |
| 38.13651327292124 | 0.689 |
| 38.15066468715668 | 0.739 |
| 38.16161578496297 | 0.776 |
| 38.17525048255921 | 0.776 |
| 38.18603488604228 | 0.862 |
| 38.20066968599955 | 0.837 |
| 38.215454498926796 | 0.849 |
| 38.23033932050069 | 0.886 |
| 38.2405070066452 | 0.849 |
| 38.25564184983571 | 0.837 |
| 38.270443336168924 | 0.886 |
| 38.28531148433685 | 0.899 |
| 38.30029632250468 | 0.874 |
| 38.31503112316132 | 0.936 |
| 38.32951590220134 | 0.911 |
| 38.34425070285797 | 0.874 |
| 38.359085536003114 | 0.849 |
| 38.37026998996735 | 0.874 |
| 38.38368798891703 | 0.812 |
| 38.40028965473175 | 0.763 |
| 38.41420770486196 | 0.812 |
| 38.42604222297668 | 0.825 |
| 38.441410422325134 | 0.837 |
| 38.45989560286204 | 0.812 |
| 38.474397055308025 | 0.776 |
| 38.48863182067871 | 0.689 |
| 38.49848279953003 | 0.689 |
| 38.513600969314574 | 0.603 |
| 38.52861915429433 | 0.652 |
| 38.5434539715449 | 0.665 |
| 38.5553884824117 | 0.677 |
| 38.56905651887258 | 0.652 |
| 38.583924667040506 | 0.64 |
| 38.598876166343686 | 0.554 |
| 38.613344287872316 | 0.517 |
| 38.62801241874695 | 0.542 |
| 38.63879683812459 | 0.517 |
| 38.652931586901346 | 0.431 |
| 38.66769971847534 | 0.406 |
| 38.69238552252452 | 0.406 |
| 38.70745370388031 | 0.419 |
| 38.72235518296559 | 0.406 |
| 38.73732335567475 | 0.394 |
| 38.75169145266215 | 0.382 |
| 38.76637624899546 | 0.382 |
| 38.7811110496521 | 0.406 |
| 38.79617923895518 | 0.431 |
| 38.81101405620575 | 0.443 |
| 38.82613221804301 | 0.505 |
| 38.84063368638356 | 0.492 |
| 38.85505178769429 | 0.517 |
| 38.870019952456154 | 0.579 |
| 38.88470475673675 | 0.652 |
| 38.899406218528746 | 0.665 |
| 38.91062401930491 | 0.665 |
| 38.92367532253265 | 0.702 |
| 38.93484310309092 | 0.652 |
| 38.94859446684519 | 0.763 |
| 38.963329283396405 | 0.751 |
| 38.97421370347341 | 0.788 |
| 38.98774838447571 | 0.825 |
| 38.99891617298126 | 0.886 |
| 39.01311758359273 | 0.911 |
| 39.03280288378398 | 0.911 |
| 39.04373731613159 | 0.911 |
| 39.05815541744232 | 0.923 |
| 39.07254020373026 | 0.911 |
| 39.0872750043869 | 0.923 |
| 39.102343169848126 | 0.911 |
| 39.11714465618134 | 0.911 |
| 39.13221283753713 | 0.899 |
| 39.14638091723124 | 0.911 |
| 39.1610990524292 | 0.948 |
| 39.17643392086029 | 0.972 |
| 39.19146875540415 | 0.997 |
| 39.20266986687978 | 0.96 |
| 39.21605455080668 | 0.96 |
| 39.22778905232747 | 0.948 |
| 39.2426572004954 | 0.985 |
| 39.25682530403137 | 0.985 |
| 39.267776385943094 | 0.985 |
| 39.28224449952443 | 0.96 |
| 39.292028816541034 | 0.948 |
| 39.30883048375448 | 0.972 |
| 39.322498536109926 | 0.985 |
| 39.33755003611247 | 0.972 |
| 39.35233483314514 | 0.948 |
| 39.367769718170166 | 0.936 |
| 39.3814044157664 | 0.936 |
| 39.39623923301697 | 0.972 |
| 39.411107389132184 | 0.948 |
| 39.4223585208257 | 0.972 |
| 39.43555983702342 | 0.96 |
| 39.446644266446434 | 0.972 |
| 39.46027897198995 | 0.96 |
| 39.475447154045106 | 0.972 |
| 39.486048221588135 | 0.972 |
| 39.50003293355306 | 0.997 |
| 39.51418435573578 | 0.985 |
| 39.528935837745664 | 0.985 |
| 39.54048698743184 | 0.985 |
| 39.55405502319336 | 0.972 |
| 39.56923987070719 | 0.985 |
| 39.58415802319845 | 0.985 |
| 39.59872615337372 | 0.985 |
| 39.6138276497523 | 0.985 |
| 39.625595506032305 | 0.985 |
| 39.644197352727254 | 0.972 |
| 39.65568183263143 | 0.96 |
| 39.66911652088165 | 0.997 |
| 39.68390131791433 | 0.997 |
| 39.698986172676086 | 0.997 |
| 39.714271036783856 | 0.997 |
| 39.724205350875856 | 0.985 |
| 39.73610655466715 | 0.96 |
| 39.749457883834836 | 0.96 |
| 39.76070899963379 | 0.985 |
| 39.77522711753845 | 0.997 |
| 39.78876182238261 | 0.972 |
| 39.80024628639221 | 0.985 |
| 39.8142810344696 | 0.997 |
| 39.82891581853231 | 0.997 |
| 39.843683966000874 | 0.972 |
| 39.85896883805593 | 0.985 |
| 39.873753635088605 | 0.997 |
| 39.88823843797048 | 0.96 |
| 39.89920618534088 | 0.948 |
| 39.91287422180176 | 0.936 |
| 39.9277923822403 | 0.96 |
| 39.9378433863322 | 0.948 |
| 39.95279488563538 | 0.96 |
| 39.967396354675294 | 0.923 |
| 39.987014969189964 | 0.911 |
| 40.00143308639527 | 0.899 |
| 40.012984236081444 | 0.899 |
| 40.02746902306875 | 0.886 |
| 40.04127039909363 | 0.874 |
| 40.05682195027669 | 0.862 |
| 40.06808975537618 | 0.862 |
| 40.082724539438885 | 0.874 |
| 40.09680928389231 | 0.837 |
| 40.110844016075134 | 0.849 |
| 40.13069600264232 | 0.825 |
| 40.1456475019455 | 0.837 |
| 40.159948937098186 | 0.763 |
| 40.17445038954417 | 0.788 |
| 40.188901821772255 | 0.812 |
| 40.20445338884989 | 0.751 |
| 40.21898817221324 | 0.763 |
| 40.233839654922484 | 0.689 |
| 40.247824382781985 | 0.652 |
| 40.26735967000325 | 0.615 |
| 40.282194487253825 | 0.603 |
| 40.29706263542175 | 0.603 |
| 40.30893048445384 | 0.542 |
| 40.32369863986969 | 0.542 |
| 40.33723332087199 | 0.431 |
| 40.35695195198059 | 0.308 |
| 40.37160341739654 | 0.308 |
| 40.38667160669963 | 0.209 |
| 40.397822721799216 | 0.123 |
| 40.412807536125186 | 0.025 |
| 40.42655891577403 | -0.037 |
| 40.44162710507711 | -0.037 |
| 40.45669527053833 | -0.049 |
| 40.47139673233032 | -0.111 |
| 40.48738167285919 | -0.135 |
| 40.50093301932017 | -0.185 |
| 40.51613455613454 | -0.209 |
| 40.530952684084575 | -0.259 |
| 40.541970451672874 | -0.271 |
| 40.56025562286377 | -0.295 |
| 40.575007104873656 | -0.382 |
| 40.5894918680191 | -0.468 |
| 40.60471007029216 | -0.529 |
| 40.61844476858775 | -0.603 |
| 40.63327958583832 | -0.542 |
| 40.64851445357005 | -0.554 |
| 40.66334927082062 | -0.603 |
| 40.67850078741709 | -0.652 |
| 40.69270220597585 | -0.714 |
| 40.70780370235443 | -0.776 |
| 40.72242183685303 | -0.788 |
| 40.741823768615724 | -0.825 |
| 40.753491600354515 | -0.837 |
| 40.767109632492065 | -0.862 |
| 40.78726165294647 | -0.899 |
| 40.80226315657298 | -0.886 |
| 40.81361428896586 | -0.936 |
| 40.82749900023143 | -0.936 |
| 40.84220048586528 | -0.997 |
| 40.85781869888306 | -0.972 |
| 40.87182010014852 | -0.972 |
| 40.8863715728124 | -1.034 |
| 40.9032565832138 | -1.034 |
| 40.91785803635915 | -1.009 |
| 40.936709936459856 | -1.096 |
| 40.95152808825175 | -1.009 |
| 40.966312885284424 | -0.997 |
| 40.98148106733958 | -1.009 |
| 40.99628255367279 | -1.034 |
| 41.01221748987834 | -1.071 |
| 41.02578550179799 | -1.096 |
| 41.0405869881312 | -1.059 |
| 41.05532178878784 | -1.034 |
| 41.07015660603841 | -1.046 |
| 41.084708070755006 | -1.046 |
| 41.09944287141164 | -0.997 |
| 41.11407767136892 | -0.96 |
| 41.12864578564962 | -0.923 |
| 41.14441403547923 | -0.886 |
| 41.15928218364716 | -0.886 |
| 41.17415033976237 | -0.923 |
| 41.188501771291094 | -0.899 |
| 41.203253253300986 | -0.899 |
| 41.21847143967946 | -0.948 |
| 41.23392298221588 | -0.948 |
| 41.24909117221832 | -0.985 |
| 41.26262585322062 | -1.009 |
| 41.27776070435842 | -1.009 |
| 41.29259552160899 | -1.046 |
| 41.30726365248362 | -1.009 |
| 41.321648422877 | -0.997 |
| 41.33643323580424 | -1.022 |
| 41.351084701220195 | -1.022 |
| 41.36588618755341 | -1.071 |
| 41.3818877696991 | -1.083 |
| 41.395389119784035 | -1.071 |
| 41.40995724995931 | -1.12 |
| 41.42464205423991 | -1.12 |
| 41.43921016852061 | -1.132 |
| 41.45909548600515 | -1.059 |
| 41.47416366736094 | -1.071 |
| 41.48878180185954 | -1.108 |
| 41.50348327159882 | -1.12 |
| 41.518584767977394 | -0.997 |
| 41.535269784927365 | -0.997 |
| 41.548971152305604 | -1.009 |
| 41.56452270348867 | -1.059 |
| 41.57859078248342 | -1.046 |
| 41.59414233366648 | -1.071 |
| 41.6095272064209 | -1.108 |
| 41.623911968866985 | -1.12 |
| 41.63909683227539 | -1.108 |
| 41.65073131720225 | -1.071 |
| 41.66406598885854 | -1.022 |
| 41.67868412335714 | -1.009 |
| 41.690835332870485 | -1.034 |
| 41.705236768722536 | -1.096 |
| 41.71902148723602 | -1.071 |
| 41.7379233678182 | -1.059 |
| 41.75777537027995 | -0.972 |
| 41.77707728544871 | -0.997 |
| 41.79681260585785 | -0.923 |
| 41.80781370004018 | -0.899 |
| 41.82614886760712 | -0.972 |
| 41.843117237091064 | -0.936 |
| 41.86356926759084 | -0.862 |
| 41.88253783384959 | -0.862 |
| 41.898439439137775 | -0.948 |
| 41.91730798880259 | -0.923 |
| 41.931992785135904 | -0.911 |
| 41.94794438680013 | -0.874 |
| 41.96719630559286 | -0.874 |
| 41.987098304430646 | -0.936 |
| 42.006550232569374 | -0.899 |
| 42.02135171890259 | -0.936 |
| 42.036969955762224 | -0.985 |
| 42.055588467915854 | -1.096 |
| 42.07210678259532 | -1.096 |
| 42.090775322914126 | -1.083 |
| 42.11082733472188 | -1.096 |
| 42.12616220315297 | -1.145 |
| 42.14171375433604 | -1.083 |
| 42.16071565151215 | -1.059 |
| 42.175933837890625 | -1.022 |
| 42.19503575166066 | -1.034 |
| 42.21470438639323 | -1.034 |
| 42.23030593395233 | -1.022 |
| 42.24929116566976 | -0.997 |
| 42.26495939890544 | -0.96 |
| 42.280094250043234 | -0.972 |
| 42.299796215693156 | -0.923 |
| 42.31576448281606 | -0.948 |
| 42.339666883150734 | -0.936 |
| 42.35530176957448 | -0.911 |
| 42.37358693281809 | -0.911 |
| 42.39352227052053 | -0.936 |
| 42.40857377052307 | -0.948 |
| 42.4280757188797 | -0.997 |
| 42.44752767086029 | -1.083 |
| 42.46456270217895 | -1.009 |
| 42.47956420580546 | -0.997 |
| 42.49296553929647 | -1.009 |
| 42.5125174999237 | -1.083 |
| 42.52728563944499 | -1.12 |
| 42.54255383809407 | -1.132 |
| 42.55720530351003 | -1.046 |
| 42.572323473294574 | -1.059 |
| 42.591925438245134 | -1.071 |
| 42.60267650286357 | -1.071 |
| 42.61677792072296 | -1.108 |
| 42.632196132342024 | -1.132 |
| 42.64756433963775 | -1.12 |
| 42.66211578845978 | -1.12 |
| 42.67731730143229 | -1.046 |
| 42.69061863422394 | -1.034 |
| 42.705620137850445 | -1.034 |
| 42.721905104319255 | -1.009 |
| 42.73565646807353 | -1.009 |
| 42.750257937113446 | -0.972 |
| 42.76529277165731 | -1.009 |
| 42.7799942334493 | -1.046 |
| 42.7946123679479 | -1.034 |
| 42.81426433722178 | -0.948 |
| 42.82584881782532 | -0.936 |
| 42.83986688454946 | -0.972 |
| 42.8549017349879 | -0.985 |
| 42.87155340512594 | -0.997 |
| 42.885121417045596 | -0.972 |
| 42.900672968228655 | -1.009 |
| 42.91427433490753 | -0.985 |
| 42.92905915578206 | -1.034 |
| 42.94361060460408 | -1.022 |
| 42.95801203250885 | -1.034 |
| 42.97291351954142 | -1.071 |
| 42.98913181622823 | -1.071 |
| 43.0045500199 | -1.071 |
| 43.02345191637675 | -1.046 |
| 43.0346197048823 | -1.022 |
| 43.049187819163 | -1.022 |
| 43.062672503789265 | -1.009 |
| 43.077640668551126 | -1.022 |
| 43.093608935674034 | -1.071 |
| 43.108027052879336 | -1.083 |
| 43.12271183331807 | -1.046 |
| 43.137146615982054 | -1.071 |
| 43.15183142026265 | -1.059 |
| 43.167049606641136 | -1.145 |
| 43.182184449831645 | -1.145 |
| 43.19678591887156 | -1.145 |
| 43.2125541528066 | -1.169 |
| 43.22767233848572 | -1.145 |
| 43.24595750172933 | -1.096 |
| 43.26222580273946 | -1.108 |
| 43.27732729911804 | -1.194 |
| 43.29266216754913 | -1.169 |
| 43.308180387814836 | -1.182 |
| 43.32336523532867 | -1.157 |
| 43.33853341738383 | -1.145 |
| 43.35310155550639 | -1.169 |
| 43.36735297044118 | -1.157 |
| 43.3815210501353 | -1.169 |
| 43.40052295525869 | -1.169 |
| 43.415424434343976 | -1.132 |
| 43.43020925521851 | -1.12 |
| 43.44587748845418 | -1.096 |
| 43.464829389254255 | -1.096 |
| 43.479380838076274 | -1.096 |
| 43.494365668296815 | -1.096 |
| 43.5098338842392 | -1.096 |
| 43.52390195528666 | -1.12 |
| 43.543653933207196 | -1.157 |
| 43.56003890037537 | -1.132 |
| 43.574340335528056 | -1.169 |
| 43.59325888951619 | -1.145 |
| 43.60842708746592 | -1.096 |
| 43.620228250821434 | -1.145 |
| 43.63514641920725 | -1.157 |
| 43.65018125375112 | -1.182 |
| 43.666116166114804 | -1.157 |
| 43.681234351793925 | -1.182 |
| 43.69985288778941 | -1.169 |
| 43.71433766682943 | -1.194 |
| 43.73015592098236 | -1.169 |
| 43.745474116007486 | -1.194 |
| 43.75925881862641 | -1.182 |
| 43.77399361928304 | -1.169 |
| 43.788528418540956 | -1.182 |
| 43.80436333815257 | -1.194 |
| 43.822848518689476 | -1.108 |
| 43.837099933624266 | -1.169 |
| 43.85633520285288 | -1.169 |
| 43.87133670647939 | -1.169 |
| 43.88600483735402 | -1.132 |
| 43.90095633665721 | -1.206 |
| 43.916491222381595 | -1.182 |
| 43.93490971724192 | -1.157 |
| 43.94961120287577 | -1.12 |
| 43.96484605471293 | -1.145 |
| 43.979330817858376 | -1.132 |
| 43.99611583550771 | -1.145 |
| 44.01426765124003 | -1.194 |
| 44.02938583691915 | -1.132 |
| 44.04435400168101 | -1.12 |
| 44.05978887081146 | -1.157 |
| 44.07912413279215 | -1.219 |
| 44.093925619125365 | -1.206 |
| 44.108710439999896 | -1.219 |
| 44.12439533869426 | -1.219 |
| 44.14378060499827 | -1.206 |
| 44.15874876976013 | -1.157 |
| 44.17826738357544 | -1.12 |
| 44.19493571917216 | -1.132 |
| 44.20870377222697 | -1.145 |
| 44.22457202275594 | -1.194 |
| 44.23965686957042 | -1.182 |
| 44.25832538604736 | -1.169 |
| 44.27337688604991 | -1.169 |
| 44.2935955842336 | -1.132 |
| 44.309080465634665 | -1.132 |
| 44.324498669306436 | -1.12 |
| 44.34400061766306 | -1.132 |
| 44.354485003153485 | -1.132 |
| 44.36983655293783 | -1.132 |
| 44.38528808752696 | -1.206 |
| 44.403739937146504 | -1.145 |
| 44.418341382344565 | -1.132 |
| 44.433442902565005 | -1.12 |
| 44.449011119206745 | -1.145 |
| 44.464112639427185 | -1.12 |
| 44.48241446812948 | -1.12 |
| 44.497415971755984 | -1.12 |
| 44.51273416678111 | -1.12 |
| 44.52846906979879 | -1.12 |
| 44.543237217267354 | -1.157 |
| 44.56223912239075 | -1.145 |
| 44.57710727055868 | -1.132 |
| 44.59302551746369 | -1.145 |
| 44.60876043637594 | -1.132 |
| 44.62711226940155 | -1.157 |
| 44.64306387106578 | -1.157 |
| 44.66181573867798 | -1.206 |
| 44.680917636553446 | -1.157 |
| 44.69730261961619 | -1.12 |
| 44.710837300618486 | -1.108 |
| 44.73055595556895 | -1.108 |
| 44.74562412103017 | -1.157 |
| 44.761459032694496 | -1.145 |
| 44.77662722269694 | -1.182 |
| 44.79171206951141 | -1.182 |
| 44.80973053773244 | -1.108 |
| 44.82528208891551 | -1.132 |
| 44.84421730041504 | -1.12 |
| 44.86443600654602 | -1.169 |
| 44.88002088864644 | -1.145 |
| 44.89523906707764 | -1.169 |
| 44.909823870658876 | -1.182 |
| 44.92420863310496 | -1.169 |
| 44.93884343306224 | -1.206 |
| 44.953678250312805 | -1.206 |
| 44.97338021596273 | -1.219 |
| 44.9885317325592 | -1.231 |
| 45.0043833176295 | -1.231 |
| 45.02303518454234 | -1.243 |
| 45.038020022710164 | -1.243 |
| 45.05295485655467 | -1.243 |
| 45.068656420707704 | -1.231 |
| 45.08442467053731 | -1.219 |
| 45.10262648264567 | -1.194 |
| 45.117644651730856 | -1.231 |
| 45.13772998650869 | -1.169 |
| 45.157581973075864 | -1.182 |
| 45.1815177043279 | -1.145 |
| 45.20236978530884 | -1.182 |
| 45.220971655845645 | -1.157 |
| 45.241907072067264 | -1.157 |
| 45.260425583521524 | -1.194 |
| 45.279860870043436 | -1.194 |
| 45.29926280180613 | -1.157 |
| 45.31889810562134 | -1.132 |
| 45.339500172932944 | -1.096 |
| 45.358568739891055 | -1.071 |
| 45.37797068754832 | -1.046 |
| 45.397422615687056 | -1.046 |
| 45.417357953389484 | -1.022 |
| 45.437126604715985 | -1.009 |
| 45.45676188468933 | -0.997 |
| 45.477113922437034 | -0.936 |
| 45.49334888458252 | -0.948 |
| 45.516717886924745 | -0.96 |
| 45.53640318711599 | -0.948 |
| 45.55615517298381 | -0.985 |
| 45.57582379976908 | -0.911 |
| 45.595909134546915 | -0.862 |
| 45.62034491697947 | -0.936 |
| 45.63994686603546 | -0.923 |
| 45.6593654870987 | -1.009 |
| 45.67921746571859 | -0.997 |
| 45.699902868270875 | -0.997 |
| 45.71945482095082 | -1.034 |
| 45.73834003607432 | -1.009 |
| 45.754575006167094 | -0.997 |
| 45.773110183080036 | -0.972 |
| 45.79296216964722 | -1.009 |
| 45.81294750372569 | -0.96 |
| 45.83271615505218 | -1.009 |
| 45.84878442287445 | -0.972 |
| 45.8679530064265 | -0.96 |
| 45.88710491657257 | -0.985 |
| 45.909057116508485 | -0.972 |
| 45.927675652503964 | -1.046 |
| 45.94284381866455 | -1.059 |
| 45.96231243610382 | -1.132 |
| 45.97724726994832 | -1.12 |
| 45.996799222628276 | -1.194 |
| 46.016567866007485 | -1.219 |
| 46.03783667087555 | -1.206 |
| 46.05692190329234 | -1.243 |
| 46.07359023888906 | -1.157 |
| 46.09697590668996 | -1.206 |
| 46.116294503211975 | -1.194 |
| 46.13581311702728 | -1.231 |
| 46.160298903783165 | -1.194 |
| 46.17515038649241 | -1.231 |
| 46.19465233484904 | -1.194 |
| 46.21465433438619 | -1.194 |
| 46.233522884051006 | -1.231 |
| 46.25274148782094 | -1.231 |
| 46.26807635625203 | -1.256 |
| 46.28772830168406 | -1.256 |
| 46.30761363506317 | -1.194 |
| 46.32746562163035 | -1.169 |
| 46.3474676211675 | -1.157 |
| 46.36393593947093 | -1.157 |
| 46.382421120007834 | -1.132 |
| 46.402106420199075 | -1.145 |
| 46.42169171969096 | -1.145 |
| 46.44151035149892 | -1.083 |
| 46.462662466367085 | -1.034 |
| 46.48614815076192 | -1.009 |
| 46.505316734313965 | -0.948 |
| 46.52470200061798 | -0.911 |
| 46.543737252553306 | -0.911 |
| 46.56903976599376 | -0.886 |
| 46.58367456595103 | -0.911 |
| 46.60364323457082 | -0.874 |
| 46.62311183611552 | -0.825 |
| 46.642880487442014 | -0.849 |
| 46.66214908758799 | -0.739 |
| 46.68196773529053 | -0.689 |
| 46.7024697860082 | -0.714 |
| 46.72245512008667 | -0.689 |
| 46.74260713259379 | -0.751 |
| 46.762609140078226 | -0.8 |
| 46.78131100336711 | -0.862 |
| 46.79817935625712 | -0.899 |
| 46.81793131828308 | -0.886 |
| 46.840766954421994 | -0.985 |
| 46.860385568936664 | -0.997 |
| 46.88065427144368 | -1.034 |
| 46.90050625006358 | -1.071 |
| 46.9204749027888 | -1.022 |
| 46.94017688433329 | -1.034 |
| 46.964379302660625 | -0.985 |
| 46.9839145898819 | -0.985 |
| 47.00346653461456 | -1.009 |
| 47.02258512179057 | -1.059 |
| 47.04677086671193 | -1.071 |
| 47.06782298882802 | -1.046 |
| 47.092042072614035 | -1.083 |
| 47.111960736910504 | -1.071 |
| 47.13302950064341 | -1.071 |
| 47.15346488952637 | -1.034 |
| 47.172333439191185 | -0.997 |
| 47.19215208689372 | -0.96 |
| 47.21158734957377 | -0.849 |
| 47.23107263247172 | -0.763 |
| 47.256158487002054 | -0.702 |
| 47.27487701574962 | -0.702 |
| 47.2945289850235 | -0.652 |
| 47.314464298884076 | -0.591 |
| 47.33526638348897 | -0.579 |
| 47.35510170459747 | -0.492 |
| 47.37490368684133 | -0.48 |
| 47.39390558401744 | -0.394 |
| 47.41387425263723 | -0.345 |
| 47.43362622261047 | -0.295 |
| 47.45886209011078 | -0.271 |
| 47.477747305234274 | -0.332 |
| 47.49809933503469 | -0.308 |
| 47.51826802094777 | -0.369 |
| 47.538953415552776 | -0.382 |
| 47.56255578994751 | -0.517 |
| 47.582991170883176 | -0.64 |
| 47.60360988775889 | -0.714 |
| 47.626995555559795 | -0.776 |
| 47.64678087234497 | -0.825 |
| 47.66836635271708 | -0.862 |
| 47.687151567141214 | -0.899 |
| 47.70675354003906 | -0.923 |
| 47.726255488395694 | -0.985 |
| 47.74645750522613 | -0.997 |
| 47.77070993582408 | -1.083 |
| 47.790578587849936 | -1.046 |
| 47.809813833236696 | -1.009 |
| 47.82948246796926 | -1.034 |
| 47.849517806371054 | -1.046 |
| 47.87453696727753 | -0.923 |
| 47.895755767822266 | -0.911 |
| 47.91595778465271 | -0.899 |
| 47.93552640279134 | -0.862 |
| 47.95869540373484 | -0.837 |
| 47.98338118394216 | -0.739 |
| 48.00004951953888 | -0.665 |
| 48.02001818815867 | -0.665 |
| 48.03843669891357 | -0.554 |
| 48.0585220336914 | -0.554 |
| 48.07825735410054 | -0.492 |
| 48.097892634073894 | -0.468 |
| 48.11822802225749 | -0.48 |
| 48.13819666703542 | -0.443 |
| 48.1579819838206 | -0.455 |
| 48.17871738274892 | -0.419 |
| 48.19748593966166 | -0.468 |
| 48.217271256446836 | -0.554 |
| 48.23743993441264 | -0.542 |
| 48.266526166598005 | -0.64 |
| 48.28667818705241 | -0.751 |
| 48.30136298338572 | -0.702 |
| 48.32084826628367 | -0.751 |
| 48.340416884422304 | -0.763 |
| 48.360802268981935 | -0.763 |
| 48.376353820165 | -0.702 |
| 48.394738984107974 | -0.689 |
| 48.41074059009552 | -0.689 |
| 48.42594210306803 | -0.714 |
| 48.44466065565745 | -0.677 |
| 48.46066225369771 | -0.763 |
| 48.47648049990336 | -0.788 |
| 48.49528238773346 | -0.849 |
| 48.51191736857096 | -0.751 |
| 48.53208607037862 | -0.8 |
| 48.550954620043434 | -0.837 |
| 48.57110661665599 | -0.849 |
| 48.586274822553 | -0.862 |
| 48.60312648614248 | -0.874 |
| 48.621961720784505 | -0.776 |
| 48.642380420366926 | -0.874 |
| 48.65739858945211 | -0.923 |
| 48.67703388532003 | -0.997 |
| 48.69671918551127 | -1.046 |
| 48.71382090250651 | -1.046 |
| 48.72892239888509 | -1.034 |
| 48.747524269421895 | -0.985 |
| 48.76235908667247 | -0.948 |
| 48.781511004765825 | -1.046 |
| 48.7973792552948 | -1.096 |
| 48.812864136695865 | -1.071 |
| 48.83123263518016 | -1.071 |
| 48.846450837453204 | -1.083 |
| 48.86240242322286 | -1.108 |
| 48.87603712081909 | -1.132 |
| 48.891038616498314 | -1.071 |
| 48.905440052350365 | -1.071 |
| 48.91985816955567 | -1.009 |
| 48.93956013520559 | -1.046 |
| 48.95457830429077 | -1.009 |
| 48.97074658870697 | -1.009 |
| 48.98491466840108 | -1.022 |
| 49.00096628665924 | -1.009 |
| 49.02020153999329 | -0.899 |
| 49.03575308322907 | -0.936 |
| 49.04903775056203 | -0.886 |
| 49.06345585187276 | -0.837 |
| 49.07857403755188 | -0.886 |
| 49.09830933411916 | -0.874 |
| 49.11297747294108 | -0.825 |
| 49.127612272898354 | -0.788 |
| 49.14216373761495 | -0.788 |
| 49.157898632685345 | -0.812 |
| 49.172516751289365 | -0.812 |
| 49.187784949938454 | -0.788 |
| 49.201969703038536 | -0.788 |
| 49.21663783391317 | -0.788 |
| 49.23183937072754 | -0.825 |
| 49.24775761763255 | -0.825 |
| 49.2624090830485 | -0.776 |
| 49.278194006284075 | -0.751 |
| 49.29329550266266 | -0.763 |
| 49.30903042157491 | -0.751 |
| 49.327832285563154 | -0.726 |
| 49.34256710211436 | -0.763 |
| 49.35841868718465 | -0.702 |
| 49.373703535397844 | -0.714 |
| 49.39357220331828 | -0.739 |
| 49.41222407023112 | -0.776 |
| 49.431475989023845 | -0.8 |
| 49.44764427344004 | -0.849 |
| 49.461345632870994 | -0.911 |
| 49.4772305727005 | -0.911 |
| 49.493048803011575 | -0.899 |
| 49.50780028502147 | -0.923 |
| 49.52286845048268 | -0.936 |
| 49.53763660589854 | -0.948 |
| 49.55285478432973 | -0.948 |
| 49.567322905858354 | -0.948 |
| 49.58215772310893 | -1.022 |
| 49.59677584966024 | -1.046 |
| 49.61287747224172 | -1.096 |
| 49.63237942059835 | -1.132 |
| 49.64698086579641 | -1.12 |
| 49.66199903488159 | -1.108 |
| 49.67773395379384 | -1.096 |
| 49.697219236691794 | -1.108 |
| 49.71677118937175 | -1.022 |
| 49.73288946946462 | -1.071 |
| 49.757225219408674 | -1.059 |
| 49.771910039583844 | -0.985 |
| 49.787578272819516 | -1.046 |
| 49.81131397088369 | -0.948 |
| 49.82771561940511 | -0.96 |
| 49.84095026652018 | -1.009 |
| 49.85541838804881 | -1.009 |
| 49.87025320529938 | -0.886 |
| 49.88470463752746 | -0.899 |
| 49.90423991680145 | -0.886 |
| 49.91855801741282 | -0.862 |
| 49.93420958518982 | -0.874 |
| 49.95362820625305 | -0.837 |
| 49.96947978337606 | -0.776 |
| 49.98441460132599 | -0.849 |
| 50.00331650575002 | -0.825 |
| 50.01923475265503 | -0.849 |
| 50.0345196167628 | -0.825 |
| 50.05413825511933 | -0.862 |
| 50.06927310625712 | -0.923 |
| 50.087891618410744 | -0.776 |
| 50.102859783172605 | -0.739 |
| 50.118928050994874 | -0.788 |
| 50.13807996908824 | -0.739 |
| 50.15303146839142 | -0.739 |
| 50.17176668643951 | -0.689 |
| 50.18676816622416 | -0.702 |
| 50.20298647085826 | -0.726 |
| 50.221938371658325 | -0.665 |
| 50.236489820480344 | -0.776 |
| 50.25220805009206 | -0.726 |
| 50.267926303545636 | -0.776 |
| 50.28717822233836 | -0.714 |
| 50.303496519724526 | -0.739 |
| 50.31881472269694 | -0.862 |
| 50.334282938639326 | -0.849 |
| 50.352851454416914 | -0.911 |
| 50.37233673731486 | -0.899 |
| 50.38828833897909 | -0.936 |
| 50.40855701764425 | -1.046 |
| 50.42694218953451 | -1.009 |
| 50.44284378687541 | -1.046 |
| 50.46127897103627 | -1.022 |
| 50.47684718767802 | -1.009 |
| 50.49046521981557 | -1.034 |
| 50.50476663907369 | -0.997 |
| 50.51968479951223 | -0.997 |
| 50.53923675219218 | -0.997 |
| 50.55402157306671 | -1.12 |
| 50.569089738527936 | -1.059 |
| 50.58547472159068 | -1.022 |
| 50.60464330514272 | -1.022 |
| 50.620578217506406 | -0.96 |
| 50.63939677079519 | -0.862 |
| 50.65976546605428 | -0.8 |
| 50.67973413467407 | -0.825 |
| 50.694802300135294 | -0.837 |
| 50.71452095508575 | -0.849 |
| 50.730789232254025 | -0.862 |
| 50.749507768948874 | -0.837 |
| 50.76614276568095 | -0.862 |
| 50.78487798372905 | -0.825 |
| 50.80599675178528 | -0.812 |
| 50.825082000096636 | -0.751 |
| 50.83993348280589 | -0.763 |
| 50.85575173695882 | -0.714 |
| 50.87452028592428 | -0.628 |
| 50.891055266062416 | -0.665 |
| 50.90992381572723 | -0.64 |
| 50.929459102948506 | -0.665 |
| 50.94487732251485 | -0.702 |
| 50.964345916112265 | -0.763 |
| 50.983697851498924 | -0.714 |
| 50.99996615250905 | -0.776 |
| 51.01850135326386 | -0.837 |
| 51.035002986590065 | -0.849 |
| 51.05380486647288 | -0.899 |
| 51.06542270183563 | -0.886 |
| 51.08374120394389 | -1.009 |
| 51.104276585578916 | -1.046 |
| 51.11884469985962 | -1.034 |
| 51.13844667275747 | -1.034 |
| 51.15386486848195 | -1.096 |
| 51.17323346932729 | -1.108 |
| 51.189368438720706 | -1.12 |
| 51.20480329990387 | -1.132 |
| 51.22363851865133 | -1.169 |
| 51.243123801549274 | -1.194 |
| 51.258808700243634 | -1.132 |
| 51.277543902397156 | -1.268 |
| 51.29326215585073 | -1.182 |
| 51.311847352981566 | -1.108 |
| 51.331432636578874 | -1.096 |
| 51.34623412291209 | -1.022 |
| 51.36201902230581 | -1.083 |
| 51.3808375676473 | -1.083 |
| 51.40028951962789 | -1.046 |
| 51.42060821851094 | -0.886 |
| 51.435493040084836 | -0.825 |
| 51.45137795607249 | -0.8 |
| 51.470446538925174 | -0.776 |
| 51.49129861990611 | -0.665 |
| 51.50965045293172 | -0.652 |
| 51.52590208848317 | -0.603 |
| 51.544620617230734 | -0.603 |
| 51.564605951309204 | -0.591 |
| 51.58480796813965 | -0.628 |
| 51.60150963465373 | -0.652 |
| 51.620194832483925 | -0.652 |
| 51.63507966995239 | -0.64 |
| 51.65471494992574 | -0.652 |
| 51.67116660277049 | -0.689 |
| 51.68943508466085 | -0.763 |
| 51.70902038415273 | -0.726 |
| 51.72835565408071 | -0.763 |
| 51.74849100112915 | -0.812 |
| 51.76374251842499 | -0.874 |
| 51.77999415397644 | -0.874 |
| 51.79839598337809 | -0.911 |
| 51.81348083813985 | -0.886 |
| 51.83313279946645 | -0.899 |
| 51.84893438816071 | -0.886 |
| 51.8672528664271 | -0.788 |
| 51.88222103913625 | -0.8 |
| 51.89727255503337 | -0.689 |
| 51.91659113566081 | -0.615 |
| 51.93610974947612 | -0.554 |
| 51.95322813987732 | -0.554 |
| 51.968029618263245 | -0.517 |
| 51.986664819717404 | -0.542 |
| 52.0065834681193 | -0.603 |
| 52.026068751017256 | -0.591 |
| 52.042520403862 | -0.603 |
| 52.06090556780497 | -0.615 |
| 52.08090756734212 | -0.603 |
| 52.100592867533365 | -0.689 |
| 52.12006148497264 | -0.763 |
| 52.135313002268475 | -0.812 |
| 52.1515146334966 | -0.837 |
| 52.17013316949208 | -0.96 |
| 52.19015181859334 | -1.096 |
| 52.209570439656574 | -1.009 |
| 52.225572037696836 | -1.022 |
| 52.2446572860082 | -1.009 |
| 52.264309255282086 | -1.083 |
| 52.28406121730804 | -1.083 |
| 52.30411322116852 | -1.108 |
| 52.32066488265991 | -1.083 |
| 52.33928340276082 | -1.108 |
| 52.359768788019814 | -0.96 |
| 52.37488696575165 | -0.972 |
| 52.390805236498515 | -0.985 |
| 52.405756719907124 | -0.862 |
| 52.424575273195906 | -0.849 |
| 52.44411055246989 | -0.8 |
| 52.465746053059895 | -0.615 |
| 52.48081421852112 | -0.505 |
| 52.50089956919352 | -0.492 |
| 52.520301500956215 | -0.48 |
| 52.54015350341797 | -0.505 |
| 52.554754956563315 | -0.406 |
| 52.57060653368632 | -0.357 |
| 52.58400786717733 | -0.382 |
| 52.59989279905955 | -0.431 |
| 52.61882801850637 | -0.505 |
| 52.63346281846364 | -0.443 |
| 52.64953108628591 | -0.431 |
| 52.66469926834107 | -0.517 |
| 52.682967766126 | -0.455 |
| 52.70328647295634 | -0.505 |
| 52.72275508244832 | -0.529 |
| 52.74175698757172 | -0.615 |
| 52.76127560138703 | -0.665 |
| 52.77622710069021 | -0.751 |
| 52.79701251983643 | -0.837 |
| 52.813197469711305 | -0.862 |
| 52.827782249450685 | -0.96 |
| 52.84623409907023 | -0.948 |
| 52.86093556880951 | -0.936 |
| 52.877120518684386 | -0.972 |
| 52.892788751920065 | -1.12 |
| 52.90787358283997 | -1.096 |
| 52.9239418665568 | -1.157 |
| 52.947660899162294 | -1.243 |
| 52.967712903022765 | -1.256 |
| 52.98713151613871 | -1.293 |
| 52.99868266582489 | -1.256 |
| 53.017367887496945 | -1.206 |
| 53.036969836552935 | -1.169 |
| 53.05650511582692 | -1.169 |
| 53.07645711898804 | -1.096 |
| 53.095975732803346 | -0.997 |
| 53.11117725372314 | -0.972 |
| 53.12984578609466 | -0.862 |
| 53.145597370465595 | -0.776 |
| 53.16163229942322 | -0.714 |
| 53.179917470614114 | -0.542 |
| 53.19615241686503 | -0.468 |
| 53.21468760172526 | -0.468 |
| 53.23400620619456 | -0.332 |
| 53.253591505686444 | -0.246 |
| 53.27286008993784 | -0.135 |
| 53.28811162312825 | -0.049 |
| 53.30327980518341 | -0.037 |
| 53.31838130156199 | -0.062 |
| 53.333799521128334 | 0.012 |
| 53.349117716153465 | 0.062 |
| 53.36470260620117 | 0.062 |
| 53.38898836771647 | 0.049 |
| 53.401189589500426 | -0.012 |
| 53.42025817235311 | 0.074 |
| 53.43525965213776 | 0.074 |
| 53.456711800893146 | -0.062 |
| 53.470396502812704 | -0.098 |
| 53.48646478652954 | -0.16 |
| 53.50091621875763 | -0.234 |
| 53.51556768417358 | -0.283 |
| 53.53561970392863 | -0.419 |
| 53.5498877843221 | -0.431 |
| 53.56515598297119 | -0.357 |
| 53.58400786717733 | -0.505 |
| 53.600042804082236 | -0.542 |
| 53.61881135304769 | -0.542 |
| 53.6348462899526 | -0.615 |
| 53.653948203722635 | -0.812 |
| 53.66873300075531 | -0.825 |
| 53.68476795355479 | -0.886 |
| 53.70336980024974 | -0.923 |
| 53.72307176589966 | -0.936 |
| 53.73830661773682 | -0.997 |
| 53.75297477245331 | -0.972 |
| 53.76907637119293 | -1.022 |
| 53.787461535135904 | -1.059 |
| 53.80703016916911 | -1.071 |
| 53.822165020306905 | -1.083 |
| 53.83799993991852 | -1.096 |
| 53.85175130367279 | -1.12 |
| 53.87121992111206 | -1.071 |
| 53.886388103167214 | -1.059 |
| 53.906006733576454 | -1.022 |
| 53.92565870285034 | -1.034 |
| 53.94164361953735 | -1.071 |
| 53.960745533307396 | -0.997 |
| 53.9762637535731 | -0.936 |
| 53.99518232345581 | -1.009 |
| 54.01026715437571 | -0.948 |
| 54.02693548997243 | -0.849 |
| 54.045404005050656 | -0.788 |
| 54.06450590292613 | -0.726 |
| 54.079957469304404 | -0.603 |
| 54.098992705345154 | -0.554 |
| 54.11917805671692 | -0.505 |
| 54.13412954012553 | -0.431 |
| 54.15018113454183 | -0.357 |
| 54.168532983462015 | -0.271 |
| 54.18551800251007 | -0.209 |
| 54.20103623867035 | -0.111 |
| 54.219588088989255 | -0.111 |
| 54.23548968633016 | -0.074 |
| 54.25382485389709 | -0.098 |
| 54.27399351596832 | 0.111 |
| 54.28879500230153 | 0.123 |
| 54.30878033638 | 0.246 |
| 54.32364848454793 | 0.259 |
| 54.34268373648326 | 0.32 |
| 54.35858531792959 | 0.357 |
| 54.37707050641378 | 0.443 |
| 54.39337213834127 | 0.406 |
| 54.40747353235881 | 0.505 |
| 54.427108836174014 | 0.48 |
| 54.4470775047938 | 0.48 |
| 54.462829073270164 | 0.579 |
| 54.48081420262655 | 0.591 |
| 54.500466171900435 | 0.591 |
| 54.51948473453522 | 0.579 |
| 54.53908669948578 | 0.615 |
| 54.559355386098225 | 0.591 |
| 54.578073938687645 | 0.591 |
| 54.59814260005951 | 0.615 |
| 54.61396085421244 | 0.628 |
| 54.63289608955383 | 0.603 |
| 54.65283140341441 | 0.603 |
| 54.66908303896586 | 0.677 |
| 54.68748486836751 | 0.677 |
| 54.70256972312927 | 0.702 |
| 54.72182163397471 | 0.702 |
| 54.74099021752675 | 0.677 |
| 54.757258502642316 | 0.665 |
| 54.77532698313395 | 0.665 |
| 54.7912619193395 | 0.652 |
| 54.80968042214712 | 0.603 |
| 54.82929905255636 | 0.591 |
| 54.8455840031306 | 0.492 |
| 54.85996878941854 | 0.382 |
| 54.874186873435974 | 0.369 |
| 54.88982176780701 | 0.308 |
| 54.90500662326813 | 0.394 |
| 54.92335845629374 | 0.234 |
| 54.93824326992035 | 0.345 |
| 54.95491162141164 | 0.16 |
| 54.972830073038736 | 0.185 |
| 54.992432037989296 | 0.32 |
| 55.00718350410462 | 0.369 |
| 55.021701622009275 | 0.419 |
| 55.03680313428243 | 0.345 |
| 55.052654719352724 | 0.419 |
| 55.071006552378336 | 0.369 |
| 55.08659143447876 | 0.419 |
| 55.10145960648855 | 0.48 |
| 55.12012813886007 | 0.431 |
| 55.13956340154012 | 0.419 |
| 55.159248701731364 | 0.505 |
| 55.17910070419312 | 0.492 |
| 55.19850263595581 | 0.505 |
| 55.21802124977112 | 0.579 |
| 55.23760653336843 | 0.529 |
| 55.25397485097249 | 0.566 |
| 55.272126666704814 | 0.517 |
| 55.2918453057607 | 0.529 |
| 55.30674678484599 | 0.48 |
| 55.326115385691324 | 0.529 |
| 55.34220033486684 | 0.591 |
| 55.36023546854655 | 0.603 |
| 55.3766871213913 | 0.603 |
| 55.395422315597536 | 0.591 |
| 55.41174062093099 | 0.566 |
| 55.43062583605448 | 0.628 |
| 55.45059450467428 | 0.665 |
| 55.47042981783549 | 0.603 |
| 55.49028182029724 | 0.554 |
| 55.507000136375424 | 0.591 |
| 55.525418655077615 | 0.492 |
| 55.542020320892334 | 0.529 |
| 55.56045548915863 | 0.505 |
| 55.57950740655263 | 0.443 |
| 55.59420886834462 | 0.492 |
| 55.613660820325215 | 0.308 |
| 55.63007911841075 | 0.308 |
| 55.64541398684184 | 0.123 |
| 55.66454923947652 | 0.037 |
| 55.68416786988576 | -0.148 |
| 55.70380314985911 | -0.148 |
| 55.71983810265859 | -0.308 |
| 55.73818991978963 | -0.32 |
| 55.75409151713053 | -0.517 |
| 55.769893105824785 | -0.529 |
| 55.785244639714556 | -0.603 |
| 55.804146536191304 | -0.702 |
| 55.82018147309621 | -0.751 |
| 55.84393383661906 | -0.874 |
| 55.85963540077209 | -0.936 |
| 55.87802058855693 | -0.886 |
| 55.89402218659719 | -0.899 |
| 55.91335745652517 | -0.948 |
| 55.93307608763377 | -1.022 |
| 55.94881098270416 | -1.022 |
| 55.967729552586874 | -1.009 |
| 55.98746484915416 | -1.009 |
| 56.00860030651093 | -0.985 |
| 56.0273021697998 | -0.874 |
| 56.0431537548701 | -0.812 |
| 56.06195563475291 | -0.776 |
| 56.078023902575175 | -0.652 |
| 56.09720915158589 | -0.554 |
| 56.11229400634765 | -0.369 |
| 56.12842895189921 | -0.283 |
| 56.147047487894696 | -0.111 |
| 56.16338243484497 | -0.025 |
| 56.1790673494339 | 0.012 |
| 56.19740251700083 | 0.123 |
| 56.213587466875715 | 0.246 |
| 56.23255603313446 | 0.32 |
| 56.25247468948364 | 0.382 |
| 56.27215998967488 | 0.455 |
| 56.29174528916677 | 0.529 |
| 56.311830615997316 | 0.591 |
| 56.331832615534466 | 0.677 |
| 56.34665076732635 | 0.603 |
| 56.366152715682986 | 0.628 |
| 56.386171388626096 | 0.615 |
| 56.40078952312469 | 0.579 |
| 56.41995810667674 | 0.579 |
| 56.440026768048604 | 0.628 |
| 56.46482925415039 | 0.628 |
| 56.484364533424376 | 0.64 |
| 56.50456655025482 | 0.566 |
| 56.5237518231074 | 0.591 |
| 56.543087069193525 | 0.332 |
| 56.56377248764038 | 0.197 |
| 56.57814058462779 | 0.172 |
| 56.59470891952515 | 0.037 |
| 56.612977401415506 | -0.012 |
| 56.633246103922524 | -0.074 |
| 56.65336476961772 | -0.197 |
| 56.672583349545796 | -0.234 |
| 56.69211865266164 | -0.32 |
| 56.71243733565013 | -0.369 |
| 56.72902233600617 | -0.357 |
| 56.74772419929504 | -0.419 |
| 56.76710948944092 | -0.529 |
| 56.78359444936117 | -0.628 |
| 56.80304640134175 | -0.726 |
| 56.82671543757121 | -0.677 |
| 56.84628407160441 | -0.714 |
| 56.86218565305074 | -0.837 |
| 56.880420819918314 | -0.825 |
| 56.89983941713969 | -0.788 |
| 56.91929135322571 | -0.8 |
| 56.93937670389811 | -0.763 |
| 56.9561283826828 | -0.714 |
| 56.975113622347514 | -0.763 |
| 56.99514895280202 | -0.751 |
| 57.0150009393692 | -0.64 |
| 57.03460290431976 | -0.517 |
| 57.05135456720988 | -0.517 |
| 57.07152325312297 | -0.492 |
| 57.09207530021668 | -0.32 |
| 57.11069383621216 | -0.222 |
| 57.13094584941864 | -0.135 |
| 57.15084785620372 | -0.086 |
| 57.170566487312314 | -0.098 |
| 57.18658475081126 | -0.025 |
| 57.20566999912262 | 0.012 |
| 57.22193828423818 | 0.086 |
| 57.2411235332489 | 0.222 |
| 57.25810856819153 | 0.209 |
| 57.28136090437571 | 0.271 |
| 57.30122955640157 | 0.32 |
| 57.32083152135213 | 0.369 |
| 57.34145023822784 | 0.357 |
| 57.35636840661367 | 0.357 |
| 57.38093752066295 | 0.382 |
| 57.40158958435059 | 0.48 |
| 57.42150825659434 | 0.431 |
| 57.441393566131595 | 0.443 |
| 57.460395471254984 | 0.419 |
| 57.48056414922078 | 0.455 |
| 57.50084950129191 | 0.455 |
| 57.52045146624247 | 0.468 |
| 57.53978673617045 | 0.492 |
| 57.560355472564694 | 0.566 |
| 57.58012410004934 | 0.603 |
| 57.60012609958649 | 0.603 |
| 57.615010937054954 | 0.591 |
| 57.63132921854655 | 0.615 |
| 57.65049780209859 | 0.615 |
| 57.670583152770995 | 0.615 |
| 57.684917918841045 | 0.591 |
| 57.70433651606242 | 0.591 |
| 57.724255188306174 | 0.566 |
| 57.73865661621094 | 0.554 |
| 57.75905866622925 | 0.566 |
| 57.77772720654806 | 0.579 |
| 57.79384548664093 | 0.554 |
| 57.812197319666545 | 0.566 |
| 57.82858228683472 | 0.566 |
| 57.85143457253774 | 0.542 |
| 57.871236554781596 | 0.554 |
| 57.8909551858902 | 0.542 |
| 57.90679010550181 | 0.542 |
| 57.92679210503896 | 0.554 |
| 57.946344049771625 | 0.579 |
| 57.96287905375163 | 0.579 |
| 57.98171427249908 | 0.529 |
| 58.001732937494914 | 0.529 |
| 58.021968285242714 | 0.542 |
| 58.04057015577952 | 0.566 |
| 58.059972087542214 | 0.542 |
| 58.07987408638 | 0.529 |
| 58.09964272181193 | 0.529 |
| 58.11931135654449 | 0.542 |
| 58.138963317871095 | 0.554 |
| 58.159565369288124 | 0.554 |
| 58.174283520380655 | 0.566 |
| 58.19386880397796 | 0.579 |
| 58.21380413373311 | 0.591 |
| 58.23333942095439 | 0.603 |
| 58.253241419792175 | 0.603 |
| 58.26834291617076 | 0.603 |
| 58.28767818609874 | 0.591 |
| 58.30713013807932 | 0.554 |
| 58.32343177000681 | 0.517 |
| 58.34198362032573 | 0.542 |
| 58.36175227165222 | 0.529 |
| 58.38152089913686 | 0.468 |
| 58.40180626710256 | 0.394 |
| 58.42119153340658 | 0.308 |
| 58.44061015446981 | 0.357 |
| 58.45976207256317 | 0.209 |
| 58.47891396681468 | 0.098 |
| 58.498682618141174 | 0.111 |
| 58.518434604008995 | 0.025 |
| 58.53800322214762 | -0.074 |
| 58.55775518417359 | -0.148 |
| 58.577073788642885 | -0.209 |
| 58.59410883585612 | -0.185 |
| 58.613610768318175 | -0.197 |
| 58.63307938575745 | -0.222 |
| 58.65299805005392 | -0.197 |
| 58.673750122388206 | -0.345 |
| 58.69275201956431 | -0.209 |
| 58.71278735001882 | -0.222 |
| 58.733656120300296 | -0.185 |
| 58.75197462240855 | 0.037 |
| 58.768859632809956 | -0.025 |
| 58.78784487247467 | 0.246 |
| 58.80733015537262 | 0.259 |
| 58.82649873892466 | 0.443 |
| 58.8461173693339 | 0.369 |
| 58.86533594926198 | 0.455 |
| 58.88507125377655 | 0.517 |
| 58.90530660152435 | 0.517 |
| 58.925141938527425 | 0.542 |
| 58.94472722212473 | 0.529 |
| 58.964745887120564 | 0.529 |
| 58.98424783547719 | 0.505 |
| 59.00383311907451 | 0.505 |
| 59.023418418566386 | 0.492 |
| 59.042770353953046 | 0.468 |
| 59.06343908309937 | 0.443 |
| 59.081724254290265 | 0.419 |
| 59.102026287714644 | 0.431 |
| 59.11752783457438 | 0.406 |
| 59.137213134765624 | 0.369 |
| 59.15644838809967 | 0.357 |
| 59.17551697095235 | 0.345 |
| 59.190351788202925 | 0.332 |
| 59.20660339991252 | 0.345 |
| 59.224571871757504 | 0.32 |
| 59.240106749534604 | 0.332 |
| 59.25542495250702 | 0.32 |
| 59.27391013304393 | 0.32 |
| 59.29439551830292 | 0.332 |
| 59.3137307882309 | 0.332 |
| 59.332899371782936 | 0.345 |
| 59.35210128625234 | 0.332 |
| 59.37135322093964 | 0.332 |
| 59.39078848361969 | 0.332 |
| 59.41029043992361 | 0.332 |
| 59.42990907033285 | 0.332 |
| 59.444760553042094 | 0.332 |
| 59.4644791841507 | 0.32 |
| 59.484381182988486 | 0.32 |
| 59.50389980475108 | 0.332 |
| 59.52020143667857 | 0.332 |
| 59.53831990559896 | 0.345 |
| 59.55495490233103 | 0.32 |
| 59.57385678291321 | 0.345 |
| 59.59415881633758 | 0.345 |
| 59.608993633588156 | 0.332 |
| 59.628328903516135 | 0.332 |
| 59.64746415615082 | 0.357 |
| 59.666982769966125 | 0.394 |
| 59.69183525244395 | 0.394 |
| 59.70642005602519 | 0.406 |
| 59.7225883324941 | 0.431 |
| 59.741306869188946 | 0.443 |
| 59.76069213549296 | 0.48 |
| 59.776927105585735 | 0.48 |
| 59.795212252934775 | 0.48 |
| 59.81083048979441 | 0.48 |
| 59.82999907334646 | 0.455 |
| 59.84831756750743 | 0.419 |
| 59.864485851923625 | 0.468 |
| 59.88262100219727 | 0.431 |
| 59.902072954177854 | 0.308 |
| 59.92137486934662 | 0.394 |
| 59.94119351704915 | 0.394 |
| 59.957428487141925 | 0.246 |
| 59.97628037134806 | 0.148 |
| 59.99304869969686 | 0.148 |
| 60.01115051905314 | 0.135 |
| 60.03060247103373 | 0.185 |
| 60.04987105528514 | 0.135 |
| 60.06918965180715 | 0.16 |
| 60.08927498658498 | 0.148 |
| 60.10892697175344 | -0.012 |
| 60.12877893447876 | 0.135 |
| 60.149114322662356 | 0.135 |
| 60.164299170176186 | 0.197 |
| 60.18400113582611 | 0.172 |
| 60.203286385536195 | 0.123 |
| 60.22315505345662 | 0.185 |
| 60.24299036661784 | 0.209 |
| 60.263625772794086 | 0.369 |
| 60.28021074930827 | 0.295 |
| 60.29866259892781 | 0.259 |
| 60.32363177140554 | 0.259 |
| 60.34305036862691 | 0.345 |
| 60.3630190372467 | 0.357 |
| 60.382487654685974 | 0.394 |
| 60.40357308387756 | 0.369 |
| 60.42230828603109 | 0.382 |
| 60.442126933733626 | 0.369 |
| 60.462495652834576 | 0.431 |
| 60.48126418590546 | 0.455 |
| 60.501449553171796 | 0.468 |
| 60.5211681842804 | 0.455 |
| 60.541286849975585 | 0.443 |
| 60.561038835843405 | 0.48 |
| 60.581290849049886 | 0.443 |
| 60.60120952129364 | 0.406 |
| 60.62137819925944 | 0.406 |
| 60.640996837615965 | 0.406 |
| 60.66091548601786 | 0.419 |
| 60.681317536036175 | 0.419 |
| 60.69756915569305 | 0.394 |
| 60.71802118619283 | 0.345 |
| 60.73620635668437 | 0.332 |
| 60.75537493228912 | 0.345 |
| 60.77481020291646 | 0.345 |
| 60.79446217219035 | 0.345 |
| 60.813164035479225 | 0.332 |
| 60.832916021347046 | 0.332 |
| 60.852517986297606 | 0.369 |
| 60.87302003701528 | 0.382 |
| 60.896772400538126 | 0.345 |
| 60.915874322255455 | 0.345 |
| 60.934842888514204 | 0.308 |
| 60.954744871457414 | 0.32 |
| 60.97368008295695 | 0.357 |
| 60.99324871699015 | 0.345 |
| 61.013334051767984 | 0.357 |
| 61.033069372177124 | 0.32 |
| 61.05383810202281 | 0.345 |
| 61.07245663801829 | 0.332 |
| 61.09280866781871 | 0.283 |
| 61.111710572242735 | 0.308 |
| 61.13141253789266 | 0.332 |
| 61.15044776598612 | 0.357 |
| 61.17435015042623 | 0.332 |
| 61.19426882266998 | 0.295 |
| 61.21402078469594 | 0.259 |
| 61.234889554977414 | 0.246 |
| 61.25852523644765 | 1.44 |
| 61.277610484759016 | 1.366 |
| 61.30177957216899 | 1.366 |
| 61.320814800262454 | 1.366 |
| 61.34005006949107 | 1.391 |